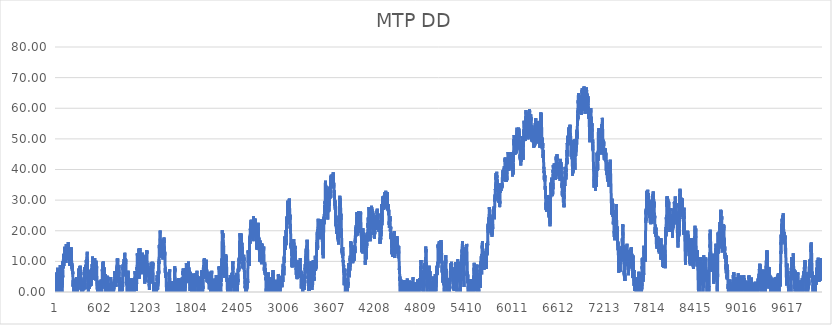
| Category | MTP DD |
|---|---|
| 0 | 0 |
| 1 | 1.56 |
| 2 | 0.56 |
| 3 | 2.81 |
| 4 | 5.21 |
| 5 | 6.337 |
| 6 | 5.343 |
| 7 | 4.35 |
| 8 | 3.353 |
| 9 | 2.357 |
| 10 | 3.92 |
| 11 | 2.94 |
| 12 | 1.94 |
| 13 | 4.39 |
| 14 | 3.39 |
| 15 | 2.41 |
| 16 | 3.31 |
| 17 | 2.33 |
| 18 | 4.15 |
| 19 | 6.13 |
| 20 | 7.89 |
| 21 | 6.89 |
| 22 | 5.91 |
| 23 | 4.93 |
| 24 | 3.95 |
| 25 | 2.97 |
| 26 | 4.79 |
| 27 | 3.79 |
| 28 | 2.81 |
| 29 | 1.83 |
| 30 | 0.85 |
| 31 | 0 |
| 32 | 0 |
| 33 | 1.603 |
| 34 | 0.607 |
| 35 | 2.107 |
| 36 | 1.107 |
| 37 | 1.497 |
| 38 | 0.5 |
| 39 | 1.863 |
| 40 | 0.867 |
| 41 | 3.367 |
| 42 | 2.37 |
| 43 | 3.673 |
| 44 | 2.677 |
| 45 | 4.297 |
| 46 | 4.852 |
| 47 | 3.857 |
| 48 | 5.38 |
| 49 | 4.383 |
| 50 | 3.387 |
| 51 | 6.237 |
| 52 | 5.257 |
| 53 | 4.277 |
| 54 | 6.977 |
| 55 | 8.817 |
| 56 | 7.817 |
| 57 | 6.837 |
| 58 | 7.883 |
| 59 | 6.89 |
| 60 | 5.897 |
| 61 | 4.917 |
| 62 | 3.937 |
| 63 | 2.957 |
| 64 | 1.977 |
| 65 | 0.997 |
| 66 | 2.017 |
| 67 | 1.037 |
| 68 | 0.057 |
| 69 | 0 |
| 70 | 0 |
| 71 | 0 |
| 72 | 0 |
| 73 | 0 |
| 74 | 2.352 |
| 75 | 1.355 |
| 76 | 0.357 |
| 77 | 0 |
| 78 | 0 |
| 79 | 0 |
| 80 | 0 |
| 81 | 2.1 |
| 82 | 3.24 |
| 83 | 2.24 |
| 84 | 4.02 |
| 85 | 3.02 |
| 86 | 5.77 |
| 87 | 4.77 |
| 88 | 7.22 |
| 89 | 9.08 |
| 90 | 8.08 |
| 91 | 10.08 |
| 92 | 9.08 |
| 93 | 9.705 |
| 94 | 8.71 |
| 95 | 7.71 |
| 96 | 9.86 |
| 97 | 12.41 |
| 98 | 11.43 |
| 99 | 12.45 |
| 100 | 11.47 |
| 101 | 10.49 |
| 102 | 9.51 |
| 103 | 8.53 |
| 104 | 10.73 |
| 105 | 9.75 |
| 106 | 10.75 |
| 107 | 9.77 |
| 108 | 10.79 |
| 109 | 9.79 |
| 110 | 11.19 |
| 111 | 10.19 |
| 112 | 12.59 |
| 113 | 11.59 |
| 114 | 13.59 |
| 115 | 14.77 |
| 116 | 13.79 |
| 117 | 12.81 |
| 118 | 14.45 |
| 119 | 13.45 |
| 120 | 14.61 |
| 121 | 13.63 |
| 122 | 12.63 |
| 123 | 13.47 |
| 124 | 12.49 |
| 125 | 11.51 |
| 126 | 10.51 |
| 127 | 13.41 |
| 128 | 12.43 |
| 129 | 11.45 |
| 130 | 10.47 |
| 131 | 9.47 |
| 132 | 12.02 |
| 133 | 14.87 |
| 134 | 15.66 |
| 135 | 14.66 |
| 136 | 13.68 |
| 137 | 12.7 |
| 138 | 14.06 |
| 139 | 14.99 |
| 140 | 14.01 |
| 141 | 13.03 |
| 142 | 12.05 |
| 143 | 11.07 |
| 144 | 12.07 |
| 145 | 13.59 |
| 146 | 12.59 |
| 147 | 11.61 |
| 148 | 12.63 |
| 149 | 14.47 |
| 150 | 13.49 |
| 151 | 12.51 |
| 152 | 14.33 |
| 153 | 13.33 |
| 154 | 12.35 |
| 155 | 11.353 |
| 156 | 12.737 |
| 157 | 11.74 |
| 158 | 12.76 |
| 159 | 11.76 |
| 160 | 14.26 |
| 161 | 16.31 |
| 162 | 15.33 |
| 163 | 14.35 |
| 164 | 13.37 |
| 165 | 12.39 |
| 166 | 11.41 |
| 167 | 10.43 |
| 168 | 12.48 |
| 169 | 11.48 |
| 170 | 10.483 |
| 171 | 11.927 |
| 172 | 10.93 |
| 173 | 12.31 |
| 174 | 11.31 |
| 175 | 10.33 |
| 176 | 9.35 |
| 177 | 10.59 |
| 178 | 9.61 |
| 179 | 8.63 |
| 180 | 10.47 |
| 181 | 9.47 |
| 182 | 8.47 |
| 183 | 10.47 |
| 184 | 11.63 |
| 185 | 10.63 |
| 186 | 11.48 |
| 187 | 10.5 |
| 188 | 12.5 |
| 189 | 11.52 |
| 190 | 10.54 |
| 191 | 9.54 |
| 192 | 11.38 |
| 193 | 14.18 |
| 194 | 13.2 |
| 195 | 12.22 |
| 196 | 11.24 |
| 197 | 10.24 |
| 198 | 12.08 |
| 199 | 13.34 |
| 200 | 14.64 |
| 201 | 13.64 |
| 202 | 12.66 |
| 203 | 11.68 |
| 204 | 10.7 |
| 205 | 9.72 |
| 206 | 8.74 |
| 207 | 9.49 |
| 208 | 8.51 |
| 209 | 7.53 |
| 210 | 8.93 |
| 211 | 7.93 |
| 212 | 6.93 |
| 213 | 8.67 |
| 214 | 7.69 |
| 215 | 6.71 |
| 216 | 7.857 |
| 217 | 6.863 |
| 218 | 5.87 |
| 219 | 6.7 |
| 220 | 5.7 |
| 221 | 4.72 |
| 222 | 3.74 |
| 223 | 2.75 |
| 224 | 1.75 |
| 225 | 3.85 |
| 226 | 2.87 |
| 227 | 1.87 |
| 228 | 4.32 |
| 229 | 3.34 |
| 230 | 2.36 |
| 231 | 1.38 |
| 232 | 0.4 |
| 233 | 0 |
| 234 | 0 |
| 235 | 0 |
| 236 | 2.2 |
| 237 | 1.22 |
| 238 | 0.24 |
| 239 | 0 |
| 240 | 1.24 |
| 241 | 2.407 |
| 242 | 1.413 |
| 243 | 0.42 |
| 244 | 2.3 |
| 245 | 1.3 |
| 246 | 3.24 |
| 247 | 2.26 |
| 248 | 3.44 |
| 249 | 2.46 |
| 250 | 1.48 |
| 251 | 0.5 |
| 252 | 0 |
| 253 | 0.99 |
| 254 | 0 |
| 255 | 0 |
| 256 | 0.8 |
| 257 | 0 |
| 258 | 0.83 |
| 259 | 2.49 |
| 260 | 1.49 |
| 261 | 0.492 |
| 262 | 0 |
| 263 | 0 |
| 264 | 2.552 |
| 265 | 3.972 |
| 266 | 2.972 |
| 267 | 4.132 |
| 268 | 3.152 |
| 269 | 4.832 |
| 270 | 3.852 |
| 271 | 2.872 |
| 272 | 1.892 |
| 273 | 0.912 |
| 274 | 2.792 |
| 275 | 1.792 |
| 276 | 0.792 |
| 277 | 2.792 |
| 278 | 1.792 |
| 279 | 0.792 |
| 280 | 0 |
| 281 | 0 |
| 282 | 0 |
| 283 | 0 |
| 284 | 1.6 |
| 285 | 0.6 |
| 286 | 1.76 |
| 287 | 0.78 |
| 288 | 2.44 |
| 289 | 1.44 |
| 290 | 3.22 |
| 291 | 2.22 |
| 292 | 4.22 |
| 293 | 3.22 |
| 294 | 4.5 |
| 295 | 6.04 |
| 296 | 5.06 |
| 297 | 4.08 |
| 298 | 5.01 |
| 299 | 6.39 |
| 300 | 5.39 |
| 301 | 7.69 |
| 302 | 6.69 |
| 303 | 5.71 |
| 304 | 7.59 |
| 305 | 6.61 |
| 306 | 5.63 |
| 307 | 4.65 |
| 308 | 5.61 |
| 309 | 4.63 |
| 310 | 3.65 |
| 311 | 2.67 |
| 312 | 5.22 |
| 313 | 7.77 |
| 314 | 6.77 |
| 315 | 8.51 |
| 316 | 7.51 |
| 317 | 8.59 |
| 318 | 7.59 |
| 319 | 6.61 |
| 320 | 6.97 |
| 321 | 5.99 |
| 322 | 5.01 |
| 323 | 4.03 |
| 324 | 3.05 |
| 325 | 2.07 |
| 326 | 1.07 |
| 327 | 3.52 |
| 328 | 2.54 |
| 329 | 1.54 |
| 330 | 4.24 |
| 331 | 3.26 |
| 332 | 2.28 |
| 333 | 1.3 |
| 334 | 0.3 |
| 335 | 2.55 |
| 336 | 1.57 |
| 337 | 0.59 |
| 338 | 0 |
| 339 | 0 |
| 340 | 2.4 |
| 341 | 1.42 |
| 342 | 0.44 |
| 343 | 0 |
| 344 | 0 |
| 345 | 0 |
| 346 | 1.448 |
| 347 | 0.455 |
| 348 | 0 |
| 349 | 0 |
| 350 | 0 |
| 351 | 0 |
| 352 | 0 |
| 353 | 0 |
| 354 | 0 |
| 355 | 0 |
| 356 | 0 |
| 357 | 0 |
| 358 | 0 |
| 359 | 0 |
| 360 | 2 |
| 361 | 1.003 |
| 362 | 2.567 |
| 363 | 1.57 |
| 364 | 0.57 |
| 365 | 2.11 |
| 366 | 4.01 |
| 367 | 3.01 |
| 368 | 4.71 |
| 369 | 3.71 |
| 370 | 6.51 |
| 371 | 5.53 |
| 372 | 8.13 |
| 373 | 7.15 |
| 374 | 6.17 |
| 375 | 5.19 |
| 376 | 4.21 |
| 377 | 3.213 |
| 378 | 4.837 |
| 379 | 3.84 |
| 380 | 2.86 |
| 381 | 1.88 |
| 382 | 0.9 |
| 383 | 3 |
| 384 | 5.85 |
| 385 | 7.01 |
| 386 | 6.01 |
| 387 | 7.41 |
| 388 | 8.87 |
| 389 | 7.87 |
| 390 | 8.5 |
| 391 | 7.51 |
| 392 | 6.52 |
| 393 | 8.1 |
| 394 | 7.1 |
| 395 | 6.12 |
| 396 | 8.97 |
| 397 | 10.45 |
| 398 | 9.47 |
| 399 | 8.49 |
| 400 | 7.51 |
| 401 | 6.53 |
| 402 | 7.79 |
| 403 | 9.71 |
| 404 | 8.71 |
| 405 | 10.67 |
| 406 | 9.67 |
| 407 | 11.51 |
| 408 | 13.113 |
| 409 | 12.117 |
| 410 | 11.12 |
| 411 | 10.14 |
| 412 | 9.16 |
| 413 | 8.18 |
| 414 | 7.2 |
| 415 | 6.22 |
| 416 | 5.24 |
| 417 | 4.24 |
| 418 | 5.82 |
| 419 | 4.84 |
| 420 | 3.86 |
| 421 | 2.88 |
| 422 | 1.9 |
| 423 | 0.92 |
| 424 | 0 |
| 425 | 2.1 |
| 426 | 3.12 |
| 427 | 2.12 |
| 428 | 4.72 |
| 429 | 3.725 |
| 430 | 2.73 |
| 431 | 4.935 |
| 432 | 3.94 |
| 433 | 2.96 |
| 434 | 1.98 |
| 435 | 1 |
| 436 | 2.12 |
| 437 | 4.47 |
| 438 | 3.49 |
| 439 | 4.933 |
| 440 | 3.937 |
| 441 | 2.94 |
| 442 | 3.685 |
| 443 | 2.69 |
| 444 | 1.69 |
| 445 | 4.29 |
| 446 | 5.85 |
| 447 | 4.87 |
| 448 | 7.22 |
| 449 | 6.24 |
| 450 | 5.26 |
| 451 | 4.28 |
| 452 | 3.3 |
| 453 | 6.1 |
| 454 | 7.3 |
| 455 | 6.3 |
| 456 | 5.32 |
| 457 | 4.34 |
| 458 | 3.36 |
| 459 | 4.05 |
| 460 | 3.07 |
| 461 | 2.07 |
| 462 | 4.07 |
| 463 | 3.07 |
| 464 | 5.47 |
| 465 | 4.47 |
| 466 | 3.47 |
| 467 | 6.07 |
| 468 | 5.09 |
| 469 | 7.79 |
| 470 | 6.81 |
| 471 | 5.83 |
| 472 | 7.63 |
| 473 | 9.07 |
| 474 | 8.09 |
| 475 | 7.11 |
| 476 | 7.82 |
| 477 | 9.7 |
| 478 | 11.56 |
| 479 | 10.58 |
| 480 | 9.6 |
| 481 | 8.62 |
| 482 | 10.56 |
| 483 | 9.56 |
| 484 | 8.58 |
| 485 | 10.16 |
| 486 | 9.16 |
| 487 | 10.48 |
| 488 | 9.5 |
| 489 | 8.52 |
| 490 | 7.54 |
| 491 | 6.56 |
| 492 | 5.56 |
| 493 | 8.26 |
| 494 | 7.28 |
| 495 | 8.287 |
| 496 | 7.293 |
| 497 | 6.3 |
| 498 | 5.32 |
| 499 | 4.34 |
| 500 | 4.94 |
| 501 | 3.96 |
| 502 | 5.08 |
| 503 | 7.02 |
| 504 | 6.04 |
| 505 | 5.04 |
| 506 | 7 |
| 507 | 8.84 |
| 508 | 11.09 |
| 509 | 10.11 |
| 510 | 9.13 |
| 511 | 10.157 |
| 512 | 9.163 |
| 513 | 8.17 |
| 514 | 7.19 |
| 515 | 6.21 |
| 516 | 7.693 |
| 517 | 6.697 |
| 518 | 5.7 |
| 519 | 4.72 |
| 520 | 3.72 |
| 521 | 6.52 |
| 522 | 5.52 |
| 523 | 8.42 |
| 524 | 7.42 |
| 525 | 10.22 |
| 526 | 9.24 |
| 527 | 8.26 |
| 528 | 7.28 |
| 529 | 6.3 |
| 530 | 8.4 |
| 531 | 7.42 |
| 532 | 8.7 |
| 533 | 7.72 |
| 534 | 6.74 |
| 535 | 5.76 |
| 536 | 4.78 |
| 537 | 3.8 |
| 538 | 2.82 |
| 539 | 1.84 |
| 540 | 0.84 |
| 541 | 3.59 |
| 542 | 2.61 |
| 543 | 1.63 |
| 544 | 0.65 |
| 545 | 0 |
| 546 | 2.005 |
| 547 | 1.01 |
| 548 | 0.015 |
| 549 | 0 |
| 550 | 1.44 |
| 551 | 2.085 |
| 552 | 1.09 |
| 553 | 0.09 |
| 554 | 2.03 |
| 555 | 1.05 |
| 556 | 0.05 |
| 557 | 1.17 |
| 558 | 0.19 |
| 559 | 0 |
| 560 | 1.48 |
| 561 | 0.48 |
| 562 | 3.08 |
| 563 | 2.1 |
| 564 | 3.64 |
| 565 | 2.66 |
| 566 | 1.68 |
| 567 | 3.46 |
| 568 | 2.46 |
| 569 | 1.46 |
| 570 | 3.22 |
| 571 | 2.24 |
| 572 | 1.26 |
| 573 | 0.28 |
| 574 | 0 |
| 575 | 0 |
| 576 | 0 |
| 577 | 0 |
| 578 | 0 |
| 579 | 2 |
| 580 | 1.02 |
| 581 | 2.48 |
| 582 | 1.48 |
| 583 | 3.4 |
| 584 | 2.4 |
| 585 | 1.42 |
| 586 | 0.44 |
| 587 | 0 |
| 588 | 1.7 |
| 589 | 4.05 |
| 590 | 3.07 |
| 591 | 2.09 |
| 592 | 1.09 |
| 593 | 3.44 |
| 594 | 2.46 |
| 595 | 1.48 |
| 596 | 0.5 |
| 597 | 0.82 |
| 598 | 0 |
| 599 | 0 |
| 600 | 0 |
| 601 | 0 |
| 602 | 0 |
| 603 | 0 |
| 604 | 2.7 |
| 605 | 4.2 |
| 606 | 5.68 |
| 607 | 7.42 |
| 608 | 6.42 |
| 609 | 7.58 |
| 610 | 6.58 |
| 611 | 8.12 |
| 612 | 9.64 |
| 613 | 8.64 |
| 614 | 7.66 |
| 615 | 6.68 |
| 616 | 7.58 |
| 617 | 8.48 |
| 618 | 7.48 |
| 619 | 9.93 |
| 620 | 8.93 |
| 621 | 7.93 |
| 622 | 9.41 |
| 623 | 8.43 |
| 624 | 7.45 |
| 625 | 6.453 |
| 626 | 8.037 |
| 627 | 7.04 |
| 628 | 6.06 |
| 629 | 5.08 |
| 630 | 4.08 |
| 631 | 6.53 |
| 632 | 7.99 |
| 633 | 6.99 |
| 634 | 6.01 |
| 635 | 5.03 |
| 636 | 4.05 |
| 637 | 3.07 |
| 638 | 2.09 |
| 639 | 1.09 |
| 640 | 2.91 |
| 641 | 1.91 |
| 642 | 3.45 |
| 643 | 5.85 |
| 644 | 4.87 |
| 645 | 5.68 |
| 646 | 4.68 |
| 647 | 3.7 |
| 648 | 2.72 |
| 649 | 1.74 |
| 650 | 0.76 |
| 651 | 0 |
| 652 | 1.94 |
| 653 | 0.94 |
| 654 | 2.66 |
| 655 | 1.68 |
| 656 | 0.7 |
| 657 | 2.42 |
| 658 | 1.42 |
| 659 | 3.18 |
| 660 | 3.92 |
| 661 | 2.94 |
| 662 | 1.94 |
| 663 | 3.72 |
| 664 | 2.74 |
| 665 | 1.76 |
| 666 | 2.677 |
| 667 | 1.683 |
| 668 | 0.69 |
| 669 | 2.31 |
| 670 | 4.91 |
| 671 | 3.93 |
| 672 | 2.93 |
| 673 | 5.28 |
| 674 | 4.3 |
| 675 | 3.32 |
| 676 | 4.48 |
| 677 | 5.035 |
| 678 | 4.04 |
| 679 | 4.655 |
| 680 | 3.66 |
| 681 | 2.68 |
| 682 | 1.7 |
| 683 | 0.72 |
| 684 | 0 |
| 685 | 0 |
| 686 | 2.55 |
| 687 | 1.57 |
| 688 | 0.59 |
| 689 | 1.5 |
| 690 | 2.52 |
| 691 | 1.54 |
| 692 | 2.37 |
| 693 | 1.39 |
| 694 | 0.41 |
| 695 | 0 |
| 696 | 0 |
| 697 | 0 |
| 698 | 0.87 |
| 699 | 0 |
| 700 | 0 |
| 701 | 0 |
| 702 | 2.25 |
| 703 | 1.25 |
| 704 | 2.89 |
| 705 | 1.89 |
| 706 | 0.91 |
| 707 | 0 |
| 708 | 0 |
| 709 | 0 |
| 710 | 0 |
| 711 | 0 |
| 712 | 0 |
| 713 | 0 |
| 714 | 0 |
| 715 | 0 |
| 716 | 0 |
| 717 | 2.1 |
| 718 | 4.9 |
| 719 | 3.92 |
| 720 | 2.94 |
| 721 | 1.96 |
| 722 | 0.98 |
| 723 | 1.485 |
| 724 | 0.49 |
| 725 | 1.34 |
| 726 | 0.36 |
| 727 | 1.7 |
| 728 | 3.22 |
| 729 | 2.22 |
| 730 | 3.307 |
| 731 | 2.313 |
| 732 | 1.32 |
| 733 | 0.34 |
| 734 | 0 |
| 735 | 0 |
| 736 | 1.84 |
| 737 | 0.86 |
| 738 | 0 |
| 739 | 1.62 |
| 740 | 2.86 |
| 741 | 1.88 |
| 742 | 2.86 |
| 743 | 1.86 |
| 744 | 0.88 |
| 745 | 0 |
| 746 | 0 |
| 747 | 0 |
| 748 | 0 |
| 749 | 0 |
| 750 | 0 |
| 751 | 0 |
| 752 | 0 |
| 753 | 1.647 |
| 754 | 0.667 |
| 755 | 0 |
| 756 | 1.92 |
| 757 | 0.92 |
| 758 | 2.16 |
| 759 | 3.26 |
| 760 | 2.26 |
| 761 | 2.985 |
| 762 | 1.99 |
| 763 | 2.77 |
| 764 | 4.07 |
| 765 | 3.07 |
| 766 | 2.09 |
| 767 | 4.09 |
| 768 | 3.11 |
| 769 | 4.87 |
| 770 | 6.63 |
| 771 | 5.65 |
| 772 | 4.65 |
| 773 | 6.75 |
| 774 | 5.75 |
| 775 | 6.75 |
| 776 | 5.75 |
| 777 | 4.77 |
| 778 | 3.79 |
| 779 | 2.81 |
| 780 | 1.83 |
| 781 | 2.63 |
| 782 | 1.65 |
| 783 | 2.18 |
| 784 | 2.88 |
| 785 | 1.88 |
| 786 | 3.88 |
| 787 | 5.62 |
| 788 | 4.62 |
| 789 | 6.52 |
| 790 | 5.52 |
| 791 | 4.54 |
| 792 | 3.54 |
| 793 | 5.59 |
| 794 | 7.69 |
| 795 | 6.71 |
| 796 | 8.11 |
| 797 | 7.11 |
| 798 | 8.31 |
| 799 | 7.31 |
| 800 | 6.33 |
| 801 | 8.78 |
| 802 | 10.93 |
| 803 | 9.93 |
| 804 | 8.95 |
| 805 | 7.97 |
| 806 | 6.97 |
| 807 | 5.97 |
| 808 | 8.37 |
| 809 | 10.92 |
| 810 | 9.94 |
| 811 | 8.96 |
| 812 | 7.98 |
| 813 | 7 |
| 814 | 6.02 |
| 815 | 5.02 |
| 816 | 4.02 |
| 817 | 5.98 |
| 818 | 5 |
| 819 | 4 |
| 820 | 3 |
| 821 | 5.85 |
| 822 | 7.01 |
| 823 | 6.03 |
| 824 | 6.55 |
| 825 | 8.8 |
| 826 | 7.82 |
| 827 | 6.84 |
| 828 | 5.86 |
| 829 | 4.88 |
| 830 | 3.9 |
| 831 | 2.903 |
| 832 | 1.907 |
| 833 | 3.65 |
| 834 | 2.67 |
| 835 | 1.69 |
| 836 | 0.71 |
| 837 | 0 |
| 838 | 2.1 |
| 839 | 4.85 |
| 840 | 3.87 |
| 841 | 2.89 |
| 842 | 1.91 |
| 843 | 0.93 |
| 844 | 0 |
| 845 | 0 |
| 846 | 0 |
| 847 | 0 |
| 848 | 1.14 |
| 849 | 3.69 |
| 850 | 2.71 |
| 851 | 1.717 |
| 852 | 3.385 |
| 853 | 2.392 |
| 854 | 1.4 |
| 855 | 3.1 |
| 856 | 2.1 |
| 857 | 1.12 |
| 858 | 0.14 |
| 859 | 0 |
| 860 | 1.34 |
| 861 | 0.36 |
| 862 | 0 |
| 863 | 0 |
| 864 | 1.12 |
| 865 | 2.34 |
| 866 | 1.36 |
| 867 | 0.38 |
| 868 | 3.28 |
| 869 | 2.3 |
| 870 | 1.32 |
| 871 | 0.32 |
| 872 | 2.24 |
| 873 | 1.24 |
| 874 | 3.14 |
| 875 | 5.79 |
| 876 | 8.14 |
| 877 | 7.14 |
| 878 | 9 |
| 879 | 8.02 |
| 880 | 7.04 |
| 881 | 6.06 |
| 882 | 5.08 |
| 883 | 6.3 |
| 884 | 5.3 |
| 885 | 7.04 |
| 886 | 9.54 |
| 887 | 8.56 |
| 888 | 9.78 |
| 889 | 8.8 |
| 890 | 7.82 |
| 891 | 9.74 |
| 892 | 10.78 |
| 893 | 9.78 |
| 894 | 8.8 |
| 895 | 7.82 |
| 896 | 6.84 |
| 897 | 8.4 |
| 898 | 10.6 |
| 899 | 11.53 |
| 900 | 10.53 |
| 901 | 12.78 |
| 902 | 11.8 |
| 903 | 10.82 |
| 904 | 9.84 |
| 905 | 8.86 |
| 906 | 7.88 |
| 907 | 9.26 |
| 908 | 8.26 |
| 909 | 7.26 |
| 910 | 9.66 |
| 911 | 10.96 |
| 912 | 9.96 |
| 913 | 8.963 |
| 914 | 10.707 |
| 915 | 9.71 |
| 916 | 8.73 |
| 917 | 7.75 |
| 918 | 6.77 |
| 919 | 5.79 |
| 920 | 4.81 |
| 921 | 3.83 |
| 922 | 2.85 |
| 923 | 4.15 |
| 924 | 3.17 |
| 925 | 2.19 |
| 926 | 3.59 |
| 927 | 2.59 |
| 928 | 4.74 |
| 929 | 3.76 |
| 930 | 2.78 |
| 931 | 1.8 |
| 932 | 0.82 |
| 933 | 0 |
| 934 | 0.51 |
| 935 | 2.86 |
| 936 | 1.86 |
| 937 | 4.21 |
| 938 | 5.57 |
| 939 | 4.59 |
| 940 | 3.61 |
| 941 | 5.27 |
| 942 | 6.57 |
| 943 | 5.57 |
| 944 | 4.57 |
| 945 | 6.97 |
| 946 | 5.99 |
| 947 | 5.01 |
| 948 | 4.03 |
| 949 | 3.05 |
| 950 | 4.69 |
| 951 | 3.69 |
| 952 | 2.71 |
| 953 | 1.73 |
| 954 | 2.89 |
| 955 | 1.89 |
| 956 | 2.977 |
| 957 | 1.983 |
| 958 | 0.99 |
| 959 | 1.92 |
| 960 | 3.14 |
| 961 | 2.14 |
| 962 | 1.16 |
| 963 | 0.18 |
| 964 | 0 |
| 965 | 2.7 |
| 966 | 1.72 |
| 967 | 2.42 |
| 968 | 1.44 |
| 969 | 0.46 |
| 970 | 0 |
| 971 | 0 |
| 972 | 0 |
| 973 | 2.702 |
| 974 | 1.722 |
| 975 | 2.849 |
| 976 | 1.856 |
| 977 | 0.862 |
| 978 | 0 |
| 979 | 0 |
| 980 | 0 |
| 981 | 1.5 |
| 982 | 3.7 |
| 983 | 2.72 |
| 984 | 1.72 |
| 985 | 4.32 |
| 986 | 3.32 |
| 987 | 4.4 |
| 988 | 3.42 |
| 989 | 2.44 |
| 990 | 1.46 |
| 991 | 0.48 |
| 992 | 0 |
| 993 | 0 |
| 994 | 2.15 |
| 995 | 1.17 |
| 996 | 0.19 |
| 997 | 0 |
| 998 | 0 |
| 999 | 0 |
| 1000 | 0 |
| 1001 | 2 |
| 1002 | 2.41 |
| 1003 | 4.35 |
| 1004 | 3.35 |
| 1005 | 2.35 |
| 1006 | 4.21 |
| 1007 | 3.21 |
| 1008 | 2.21 |
| 1009 | 1.23 |
| 1010 | 0.25 |
| 1011 | 0 |
| 1012 | 2.1 |
| 1013 | 1.1 |
| 1014 | 0.12 |
| 1015 | 0 |
| 1016 | 0 |
| 1017 | 0 |
| 1018 | 0 |
| 1019 | 1.2 |
| 1020 | 0.203 |
| 1021 | 1.767 |
| 1022 | 0.77 |
| 1023 | 0 |
| 1024 | 1.68 |
| 1025 | 3 |
| 1026 | 2 |
| 1027 | 1 |
| 1028 | 3.45 |
| 1029 | 2.47 |
| 1030 | 1.49 |
| 1031 | 3.35 |
| 1032 | 2.37 |
| 1033 | 4.62 |
| 1034 | 3.62 |
| 1035 | 5.04 |
| 1036 | 6.84 |
| 1037 | 5.84 |
| 1038 | 4.84 |
| 1039 | 3.86 |
| 1040 | 2.88 |
| 1041 | 1.9 |
| 1042 | 0.92 |
| 1043 | 2.16 |
| 1044 | 1.18 |
| 1045 | 2.38 |
| 1046 | 1.387 |
| 1047 | 2.493 |
| 1048 | 1.5 |
| 1049 | 0.5 |
| 1050 | 2.3 |
| 1051 | 1.3 |
| 1052 | 0.32 |
| 1053 | 1.27 |
| 1054 | 2.31 |
| 1055 | 1.31 |
| 1056 | 0.31 |
| 1057 | 3.01 |
| 1058 | 4.49 |
| 1059 | 5.53 |
| 1060 | 7.01 |
| 1061 | 8.19 |
| 1062 | 7.19 |
| 1063 | 8.12 |
| 1064 | 10.17 |
| 1065 | 11.1 |
| 1066 | 12.62 |
| 1067 | 11.62 |
| 1068 | 12.7 |
| 1069 | 11.72 |
| 1070 | 10.74 |
| 1071 | 9.76 |
| 1072 | 8.76 |
| 1073 | 10.16 |
| 1074 | 9.18 |
| 1075 | 8.2 |
| 1076 | 7.2 |
| 1077 | 9.4 |
| 1078 | 8.4 |
| 1079 | 10.75 |
| 1080 | 12.33 |
| 1081 | 11.35 |
| 1082 | 10.37 |
| 1083 | 12.25 |
| 1084 | 14.17 |
| 1085 | 13.17 |
| 1086 | 12.19 |
| 1087 | 11.21 |
| 1088 | 10.23 |
| 1089 | 9.25 |
| 1090 | 8.27 |
| 1091 | 7.29 |
| 1092 | 6.31 |
| 1093 | 5.33 |
| 1094 | 4.33 |
| 1095 | 7.08 |
| 1096 | 6.08 |
| 1097 | 7.52 |
| 1098 | 9.72 |
| 1099 | 11.5 |
| 1100 | 10.5 |
| 1101 | 13.15 |
| 1102 | 14.377 |
| 1103 | 13.383 |
| 1104 | 12.39 |
| 1105 | 11.41 |
| 1106 | 10.413 |
| 1107 | 12.157 |
| 1108 | 11.16 |
| 1109 | 10.16 |
| 1110 | 11.11 |
| 1111 | 10.13 |
| 1112 | 9.15 |
| 1113 | 8.17 |
| 1114 | 9.91 |
| 1115 | 11.79 |
| 1116 | 10.79 |
| 1117 | 9.81 |
| 1118 | 8.83 |
| 1119 | 7.85 |
| 1120 | 8.81 |
| 1121 | 7.81 |
| 1122 | 6.83 |
| 1123 | 5.83 |
| 1124 | 7.93 |
| 1125 | 6.93 |
| 1126 | 8.77 |
| 1127 | 7.79 |
| 1128 | 10.34 |
| 1129 | 11.48 |
| 1130 | 10.5 |
| 1131 | 9.52 |
| 1132 | 12.27 |
| 1133 | 11.29 |
| 1134 | 12.79 |
| 1135 | 11.81 |
| 1136 | 10.83 |
| 1137 | 11.76 |
| 1138 | 10.76 |
| 1139 | 12.14 |
| 1140 | 11.16 |
| 1141 | 10.163 |
| 1142 | 11.707 |
| 1143 | 10.71 |
| 1144 | 11.27 |
| 1145 | 11.87 |
| 1146 | 10.89 |
| 1147 | 9.91 |
| 1148 | 11.63 |
| 1149 | 10.65 |
| 1150 | 9.657 |
| 1151 | 8.665 |
| 1152 | 10.352 |
| 1153 | 9.36 |
| 1154 | 8.38 |
| 1155 | 7.4 |
| 1156 | 6.4 |
| 1157 | 8.22 |
| 1158 | 7.22 |
| 1159 | 6.24 |
| 1160 | 5.26 |
| 1161 | 4.28 |
| 1162 | 3.3 |
| 1163 | 3.745 |
| 1164 | 2.75 |
| 1165 | 4.11 |
| 1166 | 5.59 |
| 1167 | 4.59 |
| 1168 | 5.31 |
| 1169 | 4.33 |
| 1170 | 3.33 |
| 1171 | 5.58 |
| 1172 | 4.6 |
| 1173 | 5.5 |
| 1174 | 4.5 |
| 1175 | 6.16 |
| 1176 | 5.18 |
| 1177 | 4.2 |
| 1178 | 5.78 |
| 1179 | 4.8 |
| 1180 | 7.25 |
| 1181 | 8.47 |
| 1182 | 7.49 |
| 1183 | 6.49 |
| 1184 | 8.54 |
| 1185 | 11.04 |
| 1186 | 10.06 |
| 1187 | 11.42 |
| 1188 | 12.38 |
| 1189 | 13.46 |
| 1190 | 12.46 |
| 1191 | 13.66 |
| 1192 | 12.68 |
| 1193 | 11.7 |
| 1194 | 10.72 |
| 1195 | 9.74 |
| 1196 | 8.76 |
| 1197 | 9.39 |
| 1198 | 8.41 |
| 1199 | 7.43 |
| 1200 | 6.45 |
| 1201 | 8.21 |
| 1202 | 9.357 |
| 1203 | 8.363 |
| 1204 | 7.37 |
| 1205 | 8.497 |
| 1206 | 7.503 |
| 1207 | 6.51 |
| 1208 | 5.53 |
| 1209 | 6.65 |
| 1210 | 5.65 |
| 1211 | 7.75 |
| 1212 | 6.75 |
| 1213 | 5.77 |
| 1214 | 6.99 |
| 1215 | 5.99 |
| 1216 | 5.01 |
| 1217 | 4.03 |
| 1218 | 3.05 |
| 1219 | 4.11 |
| 1220 | 3.11 |
| 1221 | 2.13 |
| 1222 | 2.635 |
| 1223 | 1.64 |
| 1224 | 0.64 |
| 1225 | 1.86 |
| 1226 | 2.64 |
| 1227 | 5.59 |
| 1228 | 6.5 |
| 1229 | 7.76 |
| 1230 | 6.76 |
| 1231 | 5.78 |
| 1232 | 4.8 |
| 1233 | 6.22 |
| 1234 | 5.22 |
| 1235 | 7.87 |
| 1236 | 6.89 |
| 1237 | 5.91 |
| 1238 | 4.91 |
| 1239 | 3.91 |
| 1240 | 5.83 |
| 1241 | 4.83 |
| 1242 | 6.79 |
| 1243 | 5.81 |
| 1244 | 6.89 |
| 1245 | 5.89 |
| 1246 | 7.99 |
| 1247 | 9.73 |
| 1248 | 8.73 |
| 1249 | 7.75 |
| 1250 | 6.77 |
| 1251 | 5.79 |
| 1252 | 4.81 |
| 1253 | 3.81 |
| 1254 | 5.81 |
| 1255 | 4.81 |
| 1256 | 3.81 |
| 1257 | 2.81 |
| 1258 | 5.01 |
| 1259 | 7.91 |
| 1260 | 9.41 |
| 1261 | 8.41 |
| 1262 | 9.89 |
| 1263 | 8.91 |
| 1264 | 7.93 |
| 1265 | 6.93 |
| 1266 | 7.89 |
| 1267 | 9.61 |
| 1268 | 8.63 |
| 1269 | 7.63 |
| 1270 | 9.51 |
| 1271 | 8.51 |
| 1272 | 7.53 |
| 1273 | 6.55 |
| 1274 | 5.57 |
| 1275 | 4.59 |
| 1276 | 3.61 |
| 1277 | 2.63 |
| 1278 | 1.65 |
| 1279 | 0.67 |
| 1280 | 0 |
| 1281 | 0 |
| 1282 | 1.24 |
| 1283 | 0.24 |
| 1284 | 0 |
| 1285 | 0 |
| 1286 | 1.68 |
| 1287 | 0.7 |
| 1288 | 0 |
| 1289 | 0 |
| 1290 | 0 |
| 1291 | 0 |
| 1292 | 0 |
| 1293 | 0 |
| 1294 | 0 |
| 1295 | 0 |
| 1296 | 0 |
| 1297 | 1.32 |
| 1298 | 0.32 |
| 1299 | 0 |
| 1300 | 1.68 |
| 1301 | 0.68 |
| 1302 | 0 |
| 1303 | 0 |
| 1304 | 0 |
| 1305 | 0 |
| 1306 | 0 |
| 1307 | 1.64 |
| 1308 | 3.16 |
| 1309 | 2.18 |
| 1310 | 1.2 |
| 1311 | 0.22 |
| 1312 | 0.93 |
| 1313 | 1.47 |
| 1314 | 2.14 |
| 1315 | 3.097 |
| 1316 | 2.103 |
| 1317 | 1.11 |
| 1318 | 0.13 |
| 1319 | 0 |
| 1320 | 0 |
| 1321 | 0 |
| 1322 | 0 |
| 1323 | 2.2 |
| 1324 | 3.72 |
| 1325 | 5.46 |
| 1326 | 4.48 |
| 1327 | 3.5 |
| 1328 | 4.567 |
| 1329 | 3.573 |
| 1330 | 2.58 |
| 1331 | 1.6 |
| 1332 | 0.62 |
| 1333 | 1.6 |
| 1334 | 2.78 |
| 1335 | 1.8 |
| 1336 | 3.22 |
| 1337 | 4.96 |
| 1338 | 6.8 |
| 1339 | 5.82 |
| 1340 | 4.84 |
| 1341 | 3.86 |
| 1342 | 2.88 |
| 1343 | 4.93 |
| 1344 | 3.95 |
| 1345 | 5.15 |
| 1346 | 7.03 |
| 1347 | 6.03 |
| 1348 | 8.88 |
| 1349 | 10.1 |
| 1350 | 9.1 |
| 1351 | 10.82 |
| 1352 | 11.54 |
| 1353 | 12.68 |
| 1354 | 15.33 |
| 1355 | 14.35 |
| 1356 | 13.37 |
| 1357 | 12.39 |
| 1358 | 11.39 |
| 1359 | 12.89 |
| 1360 | 13.91 |
| 1361 | 12.91 |
| 1362 | 15.56 |
| 1363 | 14.56 |
| 1364 | 17.46 |
| 1365 | 20.11 |
| 1366 | 19.11 |
| 1367 | 18.11 |
| 1368 | 17.13 |
| 1369 | 16.15 |
| 1370 | 16.58 |
| 1371 | 15.6 |
| 1372 | 14.6 |
| 1373 | 16.9 |
| 1374 | 15.92 |
| 1375 | 14.94 |
| 1376 | 13.96 |
| 1377 | 12.96 |
| 1378 | 11.96 |
| 1379 | 14.21 |
| 1380 | 13.23 |
| 1381 | 12.25 |
| 1382 | 11.25 |
| 1383 | 13.3 |
| 1384 | 12.32 |
| 1385 | 11.32 |
| 1386 | 13.52 |
| 1387 | 16.27 |
| 1388 | 15.29 |
| 1389 | 14.29 |
| 1390 | 17.04 |
| 1391 | 16.06 |
| 1392 | 15.08 |
| 1393 | 14.083 |
| 1394 | 15.467 |
| 1395 | 14.47 |
| 1396 | 15.597 |
| 1397 | 14.603 |
| 1398 | 13.61 |
| 1399 | 12.63 |
| 1400 | 11.63 |
| 1401 | 10.63 |
| 1402 | 12.73 |
| 1403 | 13.66 |
| 1404 | 14.76 |
| 1405 | 13.76 |
| 1406 | 15.66 |
| 1407 | 14.66 |
| 1408 | 13.68 |
| 1409 | 15 |
| 1410 | 16.16 |
| 1411 | 15.16 |
| 1412 | 14.16 |
| 1413 | 15.76 |
| 1414 | 16.96 |
| 1415 | 15.98 |
| 1416 | 17.76 |
| 1417 | 16.76 |
| 1418 | 15.78 |
| 1419 | 14.8 |
| 1420 | 13.82 |
| 1421 | 12.825 |
| 1422 | 14.79 |
| 1423 | 13.795 |
| 1424 | 12.8 |
| 1425 | 11.82 |
| 1426 | 13.14 |
| 1427 | 12.14 |
| 1428 | 11.16 |
| 1429 | 10.18 |
| 1430 | 9.2 |
| 1431 | 8.22 |
| 1432 | 7.24 |
| 1433 | 6.24 |
| 1434 | 8.18 |
| 1435 | 7.18 |
| 1436 | 6.2 |
| 1437 | 5.22 |
| 1438 | 6.603 |
| 1439 | 5.607 |
| 1440 | 4.61 |
| 1441 | 5.44 |
| 1442 | 6.39 |
| 1443 | 5.39 |
| 1444 | 4.41 |
| 1445 | 3.43 |
| 1446 | 2.45 |
| 1447 | 1.453 |
| 1448 | 3.177 |
| 1449 | 2.18 |
| 1450 | 1.2 |
| 1451 | 0.22 |
| 1452 | 0 |
| 1453 | 0 |
| 1454 | 1.52 |
| 1455 | 0.52 |
| 1456 | 0 |
| 1457 | 0 |
| 1458 | 1.663 |
| 1459 | 0.667 |
| 1460 | 0 |
| 1461 | 1.503 |
| 1462 | 0.507 |
| 1463 | 0 |
| 1464 | 0 |
| 1465 | 0 |
| 1466 | 0 |
| 1467 | 0 |
| 1468 | 0 |
| 1469 | 1.12 |
| 1470 | 0.14 |
| 1471 | 0 |
| 1472 | 2.3 |
| 1473 | 1.32 |
| 1474 | 0.34 |
| 1475 | 0 |
| 1476 | 0 |
| 1477 | 0 |
| 1478 | 1.067 |
| 1479 | 0.073 |
| 1480 | 0 |
| 1481 | 0 |
| 1482 | 0.85 |
| 1483 | 2.27 |
| 1484 | 3.41 |
| 1485 | 2.41 |
| 1486 | 4.61 |
| 1487 | 3.63 |
| 1488 | 5.17 |
| 1489 | 5.69 |
| 1490 | 7.41 |
| 1491 | 6.41 |
| 1492 | 5.43 |
| 1493 | 4.45 |
| 1494 | 3.47 |
| 1495 | 2.49 |
| 1496 | 1.51 |
| 1497 | 0.53 |
| 1498 | 1.99 |
| 1499 | 1.01 |
| 1500 | 0.03 |
| 1501 | 0 |
| 1502 | 0 |
| 1503 | 0 |
| 1504 | 0 |
| 1505 | 0 |
| 1506 | 0 |
| 1507 | 0 |
| 1508 | 0 |
| 1509 | 0.85 |
| 1510 | 0 |
| 1511 | 0 |
| 1512 | 0 |
| 1513 | 0 |
| 1514 | 0 |
| 1515 | 0 |
| 1516 | 1.723 |
| 1517 | 0.727 |
| 1518 | 0 |
| 1519 | 0 |
| 1520 | 2.05 |
| 1521 | 1.05 |
| 1522 | 0.07 |
| 1523 | 0 |
| 1524 | 2.1 |
| 1525 | 1.12 |
| 1526 | 0.14 |
| 1527 | 2.34 |
| 1528 | 3.6 |
| 1529 | 2.6 |
| 1530 | 1.6 |
| 1531 | 2.55 |
| 1532 | 1.57 |
| 1533 | 0.59 |
| 1534 | 0 |
| 1535 | 1.52 |
| 1536 | 0.52 |
| 1537 | 0 |
| 1538 | 0 |
| 1539 | 0 |
| 1540 | 0 |
| 1541 | 0 |
| 1542 | 0 |
| 1543 | 0 |
| 1544 | 1.08 |
| 1545 | 0.08 |
| 1546 | 2.43 |
| 1547 | 3.33 |
| 1548 | 2.33 |
| 1549 | 1.33 |
| 1550 | 0.33 |
| 1551 | 2.83 |
| 1552 | 1.83 |
| 1553 | 4.63 |
| 1554 | 5.05 |
| 1555 | 6.49 |
| 1556 | 8.39 |
| 1557 | 7.39 |
| 1558 | 6.41 |
| 1559 | 7.65 |
| 1560 | 6.65 |
| 1561 | 5.67 |
| 1562 | 4.69 |
| 1563 | 3.71 |
| 1564 | 2.71 |
| 1565 | 4.07 |
| 1566 | 3.09 |
| 1567 | 2.11 |
| 1568 | 1.13 |
| 1569 | 0.13 |
| 1570 | 1.83 |
| 1571 | 0.85 |
| 1572 | 0 |
| 1573 | 1.74 |
| 1574 | 0.74 |
| 1575 | 0 |
| 1576 | 0 |
| 1577 | 0 |
| 1578 | 1.785 |
| 1579 | 0.79 |
| 1580 | 0 |
| 1581 | 0 |
| 1582 | 0 |
| 1583 | 0 |
| 1584 | 0.76 |
| 1585 | 0 |
| 1586 | 0 |
| 1587 | 0 |
| 1588 | 0 |
| 1589 | 0 |
| 1590 | 0 |
| 1591 | 1.66 |
| 1592 | 0.68 |
| 1593 | 0 |
| 1594 | 0 |
| 1595 | 0 |
| 1596 | 0 |
| 1597 | 1.1 |
| 1598 | 0.1 |
| 1599 | 0 |
| 1600 | 0 |
| 1601 | 0 |
| 1602 | 1.74 |
| 1603 | 4.54 |
| 1604 | 3.56 |
| 1605 | 2.58 |
| 1606 | 1.6 |
| 1607 | 0.62 |
| 1608 | 2.22 |
| 1609 | 1.22 |
| 1610 | 3.57 |
| 1611 | 2.59 |
| 1612 | 1.61 |
| 1613 | 0.63 |
| 1614 | 0 |
| 1615 | 1.32 |
| 1616 | 3.77 |
| 1617 | 4.48 |
| 1618 | 3.5 |
| 1619 | 2.52 |
| 1620 | 1.54 |
| 1621 | 0.56 |
| 1622 | 0 |
| 1623 | 1.6 |
| 1624 | 3.48 |
| 1625 | 2.48 |
| 1626 | 3.47 |
| 1627 | 2.47 |
| 1628 | 1.49 |
| 1629 | 0.51 |
| 1630 | 0 |
| 1631 | 0 |
| 1632 | 2.25 |
| 1633 | 1.25 |
| 1634 | 0.25 |
| 1635 | 0 |
| 1636 | 0 |
| 1637 | 0.91 |
| 1638 | 0 |
| 1639 | 0 |
| 1640 | 0 |
| 1641 | 0 |
| 1642 | 0.92 |
| 1643 | 0 |
| 1644 | 0 |
| 1645 | 0 |
| 1646 | 0 |
| 1647 | 1.66 |
| 1648 | 0.66 |
| 1649 | 0 |
| 1650 | 0 |
| 1651 | 2 |
| 1652 | 1.02 |
| 1653 | 2.92 |
| 1654 | 4.84 |
| 1655 | 3.86 |
| 1656 | 2.88 |
| 1657 | 1.9 |
| 1658 | 0.92 |
| 1659 | 2.14 |
| 1660 | 3.66 |
| 1661 | 2.68 |
| 1662 | 1.68 |
| 1663 | 3.58 |
| 1664 | 6.53 |
| 1665 | 5.55 |
| 1666 | 6.85 |
| 1667 | 5.85 |
| 1668 | 7.69 |
| 1669 | 6.69 |
| 1670 | 5.69 |
| 1671 | 4.71 |
| 1672 | 3.73 |
| 1673 | 2.75 |
| 1674 | 1.77 |
| 1675 | 0.79 |
| 1676 | 0 |
| 1677 | 0.82 |
| 1678 | 0 |
| 1679 | 0 |
| 1680 | 0 |
| 1681 | 0 |
| 1682 | 0 |
| 1683 | 1.447 |
| 1684 | 0.468 |
| 1685 | 0 |
| 1686 | 0 |
| 1687 | 0 |
| 1688 | 0 |
| 1689 | 2.1 |
| 1690 | 1.1 |
| 1691 | 0.12 |
| 1692 | 1.26 |
| 1693 | 3.41 |
| 1694 | 2.41 |
| 1695 | 1.41 |
| 1696 | 3.39 |
| 1697 | 2.41 |
| 1698 | 3.91 |
| 1699 | 6.56 |
| 1700 | 7.82 |
| 1701 | 6.82 |
| 1702 | 5.84 |
| 1703 | 4.86 |
| 1704 | 3.88 |
| 1705 | 2.88 |
| 1706 | 5.38 |
| 1707 | 6.76 |
| 1708 | 7.57 |
| 1709 | 9.35 |
| 1710 | 8.35 |
| 1711 | 7.35 |
| 1712 | 8.91 |
| 1713 | 7.93 |
| 1714 | 6.95 |
| 1715 | 5.97 |
| 1716 | 7.47 |
| 1717 | 8.99 |
| 1718 | 7.99 |
| 1719 | 7.01 |
| 1720 | 6.03 |
| 1721 | 8.01 |
| 1722 | 7.03 |
| 1723 | 6.05 |
| 1724 | 5.07 |
| 1725 | 6.19 |
| 1726 | 7.99 |
| 1727 | 7.01 |
| 1728 | 6.03 |
| 1729 | 5.05 |
| 1730 | 4.07 |
| 1731 | 3.07 |
| 1732 | 5.37 |
| 1733 | 4.39 |
| 1734 | 5.93 |
| 1735 | 8.58 |
| 1736 | 9.98 |
| 1737 | 8.98 |
| 1738 | 8 |
| 1739 | 7.02 |
| 1740 | 6.04 |
| 1741 | 5.04 |
| 1742 | 7.99 |
| 1743 | 7.01 |
| 1744 | 6.03 |
| 1745 | 5.05 |
| 1746 | 4.07 |
| 1747 | 3.09 |
| 1748 | 5.39 |
| 1749 | 7.17 |
| 1750 | 6.19 |
| 1751 | 5.21 |
| 1752 | 4.22 |
| 1753 | 3.24 |
| 1754 | 2.26 |
| 1755 | 1.28 |
| 1756 | 0.3 |
| 1757 | 0 |
| 1758 | 1.5 |
| 1759 | 4.2 |
| 1760 | 3.22 |
| 1761 | 2.22 |
| 1762 | 4.87 |
| 1763 | 6.573 |
| 1764 | 5.577 |
| 1765 | 4.58 |
| 1766 | 3.6 |
| 1767 | 2.62 |
| 1768 | 1.64 |
| 1769 | 4.14 |
| 1770 | 3.16 |
| 1771 | 2.18 |
| 1772 | 3.06 |
| 1773 | 2.06 |
| 1774 | 1.08 |
| 1775 | 0.1 |
| 1776 | 0 |
| 1777 | 0 |
| 1778 | 0 |
| 1779 | 0 |
| 1780 | 1.72 |
| 1781 | 0.72 |
| 1782 | 2.44 |
| 1783 | 3.84 |
| 1784 | 2.86 |
| 1785 | 1.88 |
| 1786 | 0.9 |
| 1787 | 0 |
| 1788 | 0 |
| 1789 | 1.7 |
| 1790 | 3.64 |
| 1791 | 4.417 |
| 1792 | 3.423 |
| 1793 | 2.43 |
| 1794 | 3.115 |
| 1795 | 2.12 |
| 1796 | 3.54 |
| 1797 | 6.04 |
| 1798 | 5.06 |
| 1799 | 5.907 |
| 1800 | 4.913 |
| 1801 | 3.92 |
| 1802 | 5.172 |
| 1803 | 4.184 |
| 1804 | 3.196 |
| 1805 | 2.208 |
| 1806 | 1.22 |
| 1807 | 1.75 |
| 1808 | 2.23 |
| 1809 | 2.91 |
| 1810 | 1.93 |
| 1811 | 0.95 |
| 1812 | 0 |
| 1813 | 0 |
| 1814 | 2.9 |
| 1815 | 3.76 |
| 1816 | 2.78 |
| 1817 | 1.8 |
| 1818 | 0.82 |
| 1819 | 0 |
| 1820 | 1.3 |
| 1821 | 3.26 |
| 1822 | 2.26 |
| 1823 | 3.4 |
| 1824 | 2.42 |
| 1825 | 3.26 |
| 1826 | 5.22 |
| 1827 | 4.24 |
| 1828 | 3.26 |
| 1829 | 2.28 |
| 1830 | 4.06 |
| 1831 | 5.82 |
| 1832 | 4.82 |
| 1833 | 3.84 |
| 1834 | 4.72 |
| 1835 | 6.18 |
| 1836 | 5.18 |
| 1837 | 6.22 |
| 1838 | 5.24 |
| 1839 | 4.26 |
| 1840 | 3.28 |
| 1841 | 2.3 |
| 1842 | 3.46 |
| 1843 | 2.48 |
| 1844 | 3.64 |
| 1845 | 5.36 |
| 1846 | 4.36 |
| 1847 | 5.8 |
| 1848 | 6.94 |
| 1849 | 5.96 |
| 1850 | 4.98 |
| 1851 | 4 |
| 1852 | 5.42 |
| 1853 | 4.42 |
| 1854 | 3.44 |
| 1855 | 2.46 |
| 1856 | 1.48 |
| 1857 | 2.923 |
| 1858 | 1.927 |
| 1859 | 0.93 |
| 1860 | 0 |
| 1861 | 0 |
| 1862 | 0 |
| 1863 | 1.16 |
| 1864 | 0.16 |
| 1865 | 1.58 |
| 1866 | 3.02 |
| 1867 | 2.02 |
| 1868 | 2.5 |
| 1869 | 1.52 |
| 1870 | 0.54 |
| 1871 | 0 |
| 1872 | 1.443 |
| 1873 | 0.447 |
| 1874 | 2.447 |
| 1875 | 1.447 |
| 1876 | 0.45 |
| 1877 | 2.093 |
| 1878 | 1.097 |
| 1879 | 0.097 |
| 1880 | 1.377 |
| 1881 | 3.297 |
| 1882 | 5.057 |
| 1883 | 4.057 |
| 1884 | 3.077 |
| 1885 | 2.097 |
| 1886 | 1.097 |
| 1887 | 3.547 |
| 1888 | 2.567 |
| 1889 | 1.587 |
| 1890 | 0.59 |
| 1891 | 2.253 |
| 1892 | 1.257 |
| 1893 | 3.507 |
| 1894 | 2.527 |
| 1895 | 1.547 |
| 1896 | 0.567 |
| 1897 | 0 |
| 1898 | 1.2 |
| 1899 | 0.2 |
| 1900 | 0 |
| 1901 | 0 |
| 1902 | 0 |
| 1903 | 0 |
| 1904 | 1.82 |
| 1905 | 3.26 |
| 1906 | 2.26 |
| 1907 | 1.28 |
| 1908 | 3.88 |
| 1909 | 5.93 |
| 1910 | 4.93 |
| 1911 | 7.08 |
| 1912 | 6.1 |
| 1913 | 5.12 |
| 1914 | 4.14 |
| 1915 | 6.69 |
| 1916 | 5.71 |
| 1917 | 4.73 |
| 1918 | 3.75 |
| 1919 | 2.77 |
| 1920 | 1.79 |
| 1921 | 0.81 |
| 1922 | 0 |
| 1923 | 0 |
| 1924 | 0 |
| 1925 | 2.05 |
| 1926 | 1.05 |
| 1927 | 4 |
| 1928 | 6.6 |
| 1929 | 5.62 |
| 1930 | 4.64 |
| 1931 | 6.32 |
| 1932 | 7.8 |
| 1933 | 8.86 |
| 1934 | 7.86 |
| 1935 | 6.88 |
| 1936 | 5.885 |
| 1937 | 4.89 |
| 1938 | 7.045 |
| 1939 | 6.05 |
| 1940 | 7.95 |
| 1941 | 9.09 |
| 1942 | 10.93 |
| 1943 | 9.95 |
| 1944 | 8.97 |
| 1945 | 10.43 |
| 1946 | 9.43 |
| 1947 | 10.91 |
| 1948 | 9.91 |
| 1949 | 8.93 |
| 1950 | 7.93 |
| 1951 | 9.73 |
| 1952 | 8.73 |
| 1953 | 7.75 |
| 1954 | 6.77 |
| 1955 | 5.79 |
| 1956 | 6.43 |
| 1957 | 5.43 |
| 1958 | 7.29 |
| 1959 | 6.31 |
| 1960 | 5.33 |
| 1961 | 4.35 |
| 1962 | 7.1 |
| 1963 | 6.12 |
| 1964 | 8.12 |
| 1965 | 7.12 |
| 1966 | 8.18 |
| 1967 | 8.805 |
| 1968 | 7.81 |
| 1969 | 8.91 |
| 1970 | 7.91 |
| 1971 | 10.56 |
| 1972 | 9.58 |
| 1973 | 8.6 |
| 1974 | 7.62 |
| 1975 | 6.64 |
| 1976 | 5.64 |
| 1977 | 7.3 |
| 1978 | 6.32 |
| 1979 | 5.34 |
| 1980 | 4.36 |
| 1981 | 3.38 |
| 1982 | 4.2 |
| 1983 | 3.2 |
| 1984 | 4.34 |
| 1985 | 3.36 |
| 1986 | 5.18 |
| 1987 | 5.84 |
| 1988 | 4.86 |
| 1989 | 3.86 |
| 1990 | 6.41 |
| 1991 | 5.43 |
| 1992 | 4.45 |
| 1993 | 5.93 |
| 1994 | 4.93 |
| 1995 | 3.95 |
| 1996 | 2.97 |
| 1997 | 4.65 |
| 1998 | 3.65 |
| 1999 | 5.29 |
| 2000 | 4.31 |
| 2001 | 5.51 |
| 2002 | 4.53 |
| 2003 | 3.55 |
| 2004 | 2.57 |
| 2005 | 3.85 |
| 2006 | 2.87 |
| 2007 | 3.82 |
| 2008 | 2.84 |
| 2009 | 1.86 |
| 2010 | 0.86 |
| 2011 | 3.06 |
| 2012 | 2.06 |
| 2013 | 3.96 |
| 2014 | 5.64 |
| 2015 | 4.64 |
| 2016 | 6.58 |
| 2017 | 5.58 |
| 2018 | 4.6 |
| 2019 | 3.62 |
| 2020 | 2.64 |
| 2021 | 3.245 |
| 2022 | 2.25 |
| 2023 | 3.35 |
| 2024 | 2.35 |
| 2025 | 1.37 |
| 2026 | 0.39 |
| 2027 | 0 |
| 2028 | 0 |
| 2029 | 0 |
| 2030 | 0 |
| 2031 | 0 |
| 2032 | 2.45 |
| 2033 | 1.45 |
| 2034 | 0.47 |
| 2035 | 0 |
| 2036 | 0.6 |
| 2037 | 2.8 |
| 2038 | 1.82 |
| 2039 | 2.77 |
| 2040 | 5.52 |
| 2041 | 6.94 |
| 2042 | 5.96 |
| 2043 | 4.98 |
| 2044 | 4 |
| 2045 | 3.02 |
| 2046 | 2.04 |
| 2047 | 1.06 |
| 2048 | 0.06 |
| 2049 | 0 |
| 2050 | 2.4 |
| 2051 | 3.48 |
| 2052 | 2.48 |
| 2053 | 1.5 |
| 2054 | 0.52 |
| 2055 | 0 |
| 2056 | 0 |
| 2057 | 0 |
| 2058 | 2.55 |
| 2059 | 1.57 |
| 2060 | 0.59 |
| 2061 | 2.05 |
| 2062 | 1.05 |
| 2063 | 0.07 |
| 2064 | 0 |
| 2065 | 2.1 |
| 2066 | 1.1 |
| 2067 | 0.12 |
| 2068 | 0 |
| 2069 | 0 |
| 2070 | 0 |
| 2071 | 0.83 |
| 2072 | 0 |
| 2073 | 1.98 |
| 2074 | 2.98 |
| 2075 | 4.2 |
| 2076 | 3.2 |
| 2077 | 2.2 |
| 2078 | 4.3 |
| 2079 | 3.32 |
| 2080 | 2.34 |
| 2081 | 1.36 |
| 2082 | 0.363 |
| 2083 | 2.067 |
| 2084 | 1.07 |
| 2085 | 0.09 |
| 2086 | 0 |
| 2087 | 0.51 |
| 2088 | 0 |
| 2089 | 0.71 |
| 2090 | 2.21 |
| 2091 | 1.23 |
| 2092 | 0.25 |
| 2093 | 0 |
| 2094 | 0 |
| 2095 | 1.64 |
| 2096 | 3.64 |
| 2097 | 2.643 |
| 2098 | 4.387 |
| 2099 | 3.39 |
| 2100 | 4.26 |
| 2101 | 5.56 |
| 2102 | 4.56 |
| 2103 | 3.58 |
| 2104 | 2.6 |
| 2105 | 1.62 |
| 2106 | 2.607 |
| 2107 | 1.613 |
| 2108 | 0.62 |
| 2109 | 0 |
| 2110 | 2.2 |
| 2111 | 2.91 |
| 2112 | 1.91 |
| 2113 | 0.91 |
| 2114 | 3.46 |
| 2115 | 4.07 |
| 2116 | 3.09 |
| 2117 | 2.11 |
| 2118 | 1.13 |
| 2119 | 2.77 |
| 2120 | 1.77 |
| 2121 | 0.77 |
| 2122 | 2.69 |
| 2123 | 1.71 |
| 2124 | 0.73 |
| 2125 | 1.97 |
| 2126 | 0.97 |
| 2127 | 2.23 |
| 2128 | 1.243 |
| 2129 | 0.257 |
| 2130 | 2.807 |
| 2131 | 4.067 |
| 2132 | 3.087 |
| 2133 | 4.447 |
| 2134 | 3.467 |
| 2135 | 2.487 |
| 2136 | 4.387 |
| 2137 | 6.287 |
| 2138 | 8.247 |
| 2139 | 7.267 |
| 2140 | 8.407 |
| 2141 | 7.407 |
| 2142 | 6.427 |
| 2143 | 5.447 |
| 2144 | 4.467 |
| 2145 | 3.487 |
| 2146 | 2.507 |
| 2147 | 1.527 |
| 2148 | 0.547 |
| 2149 | 0 |
| 2150 | 0 |
| 2151 | 0 |
| 2152 | 0 |
| 2153 | 0 |
| 2154 | 1.68 |
| 2155 | 0.7 |
| 2156 | 0 |
| 2157 | 1.84 |
| 2158 | 0.84 |
| 2159 | 0 |
| 2160 | 2.9 |
| 2161 | 1.9 |
| 2162 | 4.15 |
| 2163 | 5.35 |
| 2164 | 4.37 |
| 2165 | 3.39 |
| 2166 | 4.47 |
| 2167 | 6.39 |
| 2168 | 5.41 |
| 2169 | 6.61 |
| 2170 | 8.13 |
| 2171 | 10.58 |
| 2172 | 9.58 |
| 2173 | 10.84 |
| 2174 | 9.84 |
| 2175 | 8.84 |
| 2176 | 11.04 |
| 2177 | 13.89 |
| 2178 | 16.54 |
| 2179 | 18.79 |
| 2180 | 20.21 |
| 2181 | 19.21 |
| 2182 | 18.23 |
| 2183 | 17.25 |
| 2184 | 16.27 |
| 2185 | 15.29 |
| 2186 | 16.97 |
| 2187 | 18.61 |
| 2188 | 17.61 |
| 2189 | 19.17 |
| 2190 | 18.19 |
| 2191 | 17.21 |
| 2192 | 16.23 |
| 2193 | 15.25 |
| 2194 | 14.25 |
| 2195 | 16.11 |
| 2196 | 15.11 |
| 2197 | 15.805 |
| 2198 | 14.81 |
| 2199 | 13.83 |
| 2200 | 12.85 |
| 2201 | 11.87 |
| 2202 | 10.89 |
| 2203 | 9.898 |
| 2204 | 11.565 |
| 2205 | 10.572 |
| 2206 | 9.58 |
| 2207 | 8.6 |
| 2208 | 7.62 |
| 2209 | 6.64 |
| 2210 | 5.66 |
| 2211 | 4.66 |
| 2212 | 6.58 |
| 2213 | 5.6 |
| 2214 | 4.62 |
| 2215 | 6.72 |
| 2216 | 5.72 |
| 2217 | 4.72 |
| 2218 | 6.92 |
| 2219 | 8.8 |
| 2220 | 10.56 |
| 2221 | 9.56 |
| 2222 | 8.56 |
| 2223 | 7.56 |
| 2224 | 9.28 |
| 2225 | 11.93 |
| 2226 | 12.345 |
| 2227 | 11.35 |
| 2228 | 10.37 |
| 2229 | 10.79 |
| 2230 | 9.79 |
| 2231 | 11.84 |
| 2232 | 10.86 |
| 2233 | 9.88 |
| 2234 | 8.9 |
| 2235 | 7.908 |
| 2236 | 9.195 |
| 2237 | 8.203 |
| 2238 | 7.21 |
| 2239 | 6.23 |
| 2240 | 5.25 |
| 2241 | 4.27 |
| 2242 | 3.29 |
| 2243 | 4.59 |
| 2244 | 3.59 |
| 2245 | 2.61 |
| 2246 | 1.63 |
| 2247 | 0.65 |
| 2248 | 0 |
| 2249 | 0 |
| 2250 | 1.56 |
| 2251 | 0.58 |
| 2252 | 0 |
| 2253 | 0 |
| 2254 | 2.1 |
| 2255 | 4 |
| 2256 | 3 |
| 2257 | 2.02 |
| 2258 | 1.04 |
| 2259 | 2.88 |
| 2260 | 1.9 |
| 2261 | 0.92 |
| 2262 | 0 |
| 2263 | 0 |
| 2264 | 0 |
| 2265 | 0 |
| 2266 | 0 |
| 2267 | 0 |
| 2268 | 0.93 |
| 2269 | 0 |
| 2270 | 0 |
| 2271 | 0 |
| 2272 | 0.79 |
| 2273 | 0 |
| 2274 | 0 |
| 2275 | 2.6 |
| 2276 | 1.62 |
| 2277 | 0.62 |
| 2278 | 3.22 |
| 2279 | 4.38 |
| 2280 | 3.38 |
| 2281 | 2.4 |
| 2282 | 1.4 |
| 2283 | 4.15 |
| 2284 | 5.533 |
| 2285 | 4.537 |
| 2286 | 3.54 |
| 2287 | 2.56 |
| 2288 | 1.58 |
| 2289 | 0.58 |
| 2290 | 2.98 |
| 2291 | 1.99 |
| 2292 | 1.01 |
| 2293 | 0.03 |
| 2294 | 1.45 |
| 2295 | 3.8 |
| 2296 | 2.82 |
| 2297 | 4.38 |
| 2298 | 3.4 |
| 2299 | 2.42 |
| 2300 | 5.27 |
| 2301 | 4.29 |
| 2302 | 3.31 |
| 2303 | 2.33 |
| 2304 | 1.33 |
| 2305 | 4.03 |
| 2306 | 6.28 |
| 2307 | 5.3 |
| 2308 | 4.32 |
| 2309 | 3.34 |
| 2310 | 2.36 |
| 2311 | 4.18 |
| 2312 | 6.23 |
| 2313 | 5.23 |
| 2314 | 4.25 |
| 2315 | 5.45 |
| 2316 | 6.83 |
| 2317 | 8.31 |
| 2318 | 7.31 |
| 2319 | 10.11 |
| 2320 | 9.13 |
| 2321 | 8.15 |
| 2322 | 7.17 |
| 2323 | 6.19 |
| 2324 | 5.21 |
| 2325 | 4.215 |
| 2326 | 3.22 |
| 2327 | 5.375 |
| 2328 | 4.38 |
| 2329 | 3.4 |
| 2330 | 4.58 |
| 2331 | 3.6 |
| 2332 | 2.62 |
| 2333 | 3.96 |
| 2334 | 2.98 |
| 2335 | 2 |
| 2336 | 1.02 |
| 2337 | 0.04 |
| 2338 | 2.79 |
| 2339 | 1.79 |
| 2340 | 0.81 |
| 2341 | 1.395 |
| 2342 | 0.4 |
| 2343 | 0 |
| 2344 | 0 |
| 2345 | 0 |
| 2346 | 0 |
| 2347 | 1.92 |
| 2348 | 0.94 |
| 2349 | 0 |
| 2350 | 1.603 |
| 2351 | 0.607 |
| 2352 | 0 |
| 2353 | 0 |
| 2354 | 0 |
| 2355 | 0 |
| 2356 | 0 |
| 2357 | 2.2 |
| 2358 | 3.24 |
| 2359 | 2.26 |
| 2360 | 1.28 |
| 2361 | 0.28 |
| 2362 | 0 |
| 2363 | 2.85 |
| 2364 | 5.45 |
| 2365 | 4.45 |
| 2366 | 3.47 |
| 2367 | 6.02 |
| 2368 | 5.02 |
| 2369 | 5.625 |
| 2370 | 4.63 |
| 2371 | 3.65 |
| 2372 | 4.87 |
| 2373 | 6.293 |
| 2374 | 5.297 |
| 2375 | 4.3 |
| 2376 | 3.32 |
| 2377 | 2.34 |
| 2378 | 1.36 |
| 2379 | 0.38 |
| 2380 | 0 |
| 2381 | 2.35 |
| 2382 | 4.29 |
| 2383 | 3.29 |
| 2384 | 2.29 |
| 2385 | 4.23 |
| 2386 | 3.23 |
| 2387 | 5.83 |
| 2388 | 6.79 |
| 2389 | 7.53 |
| 2390 | 6.55 |
| 2391 | 7.77 |
| 2392 | 9.23 |
| 2393 | 8.23 |
| 2394 | 7.23 |
| 2395 | 7.76 |
| 2396 | 6.78 |
| 2397 | 8.4 |
| 2398 | 7.4 |
| 2399 | 9.8 |
| 2400 | 10.9 |
| 2401 | 9.9 |
| 2402 | 11.22 |
| 2403 | 10.24 |
| 2404 | 9.26 |
| 2405 | 10.82 |
| 2406 | 13.32 |
| 2407 | 14.8 |
| 2408 | 13.8 |
| 2409 | 16.7 |
| 2410 | 15.7 |
| 2411 | 14.7 |
| 2412 | 17.4 |
| 2413 | 19.24 |
| 2414 | 18.24 |
| 2415 | 17.26 |
| 2416 | 18.92 |
| 2417 | 17.94 |
| 2418 | 16.96 |
| 2419 | 17.66 |
| 2420 | 19.14 |
| 2421 | 18.16 |
| 2422 | 17.163 |
| 2423 | 18.787 |
| 2424 | 17.79 |
| 2425 | 16.81 |
| 2426 | 15.813 |
| 2427 | 17.557 |
| 2428 | 16.56 |
| 2429 | 19.06 |
| 2430 | 18.06 |
| 2431 | 18.55 |
| 2432 | 17.57 |
| 2433 | 16.59 |
| 2434 | 15.61 |
| 2435 | 14.63 |
| 2436 | 13.65 |
| 2437 | 16.1 |
| 2438 | 15.12 |
| 2439 | 14.14 |
| 2440 | 13.16 |
| 2441 | 12.16 |
| 2442 | 14.76 |
| 2443 | 13.78 |
| 2444 | 12.8 |
| 2445 | 11.82 |
| 2446 | 10.84 |
| 2447 | 9.86 |
| 2448 | 8.88 |
| 2449 | 7.883 |
| 2450 | 9.627 |
| 2451 | 8.63 |
| 2452 | 7.63 |
| 2453 | 9.83 |
| 2454 | 8.85 |
| 2455 | 10.21 |
| 2456 | 11.357 |
| 2457 | 10.363 |
| 2458 | 9.37 |
| 2459 | 8.39 |
| 2460 | 7.41 |
| 2461 | 9.71 |
| 2462 | 12.16 |
| 2463 | 11.18 |
| 2464 | 10.2 |
| 2465 | 11.26 |
| 2466 | 10.26 |
| 2467 | 9.28 |
| 2468 | 8.3 |
| 2469 | 7.32 |
| 2470 | 6.34 |
| 2471 | 5.343 |
| 2472 | 4.345 |
| 2473 | 7.098 |
| 2474 | 6.1 |
| 2475 | 5.12 |
| 2476 | 4.14 |
| 2477 | 3.16 |
| 2478 | 2.18 |
| 2479 | 1.2 |
| 2480 | 2.46 |
| 2481 | 3.66 |
| 2482 | 2.66 |
| 2483 | 4.02 |
| 2484 | 3.04 |
| 2485 | 2.06 |
| 2486 | 1.08 |
| 2487 | 0.1 |
| 2488 | 0 |
| 2489 | 1.548 |
| 2490 | 0.555 |
| 2491 | 0 |
| 2492 | 0 |
| 2493 | 2.25 |
| 2494 | 3.47 |
| 2495 | 2.49 |
| 2496 | 1.51 |
| 2497 | 0.53 |
| 2498 | 0 |
| 2499 | 0 |
| 2500 | 0 |
| 2501 | 0 |
| 2502 | 0 |
| 2503 | 2.15 |
| 2504 | 1.15 |
| 2505 | 2.27 |
| 2506 | 3.11 |
| 2507 | 2.11 |
| 2508 | 3.45 |
| 2509 | 4.43 |
| 2510 | 3.43 |
| 2511 | 2.433 |
| 2512 | 3.957 |
| 2513 | 2.96 |
| 2514 | 4.22 |
| 2515 | 6 |
| 2516 | 8.45 |
| 2517 | 11.05 |
| 2518 | 13.6 |
| 2519 | 12.62 |
| 2520 | 11.64 |
| 2521 | 10.66 |
| 2522 | 9.66 |
| 2523 | 11.86 |
| 2524 | 10.86 |
| 2525 | 9.88 |
| 2526 | 8.883 |
| 2527 | 10.167 |
| 2528 | 9.17 |
| 2529 | 10.57 |
| 2530 | 11.63 |
| 2531 | 10.63 |
| 2532 | 9.65 |
| 2533 | 8.67 |
| 2534 | 9.49 |
| 2535 | 8.49 |
| 2536 | 10.74 |
| 2537 | 12.56 |
| 2538 | 15.01 |
| 2539 | 16.07 |
| 2540 | 16.645 |
| 2541 | 15.65 |
| 2542 | 17.9 |
| 2543 | 16.92 |
| 2544 | 15.94 |
| 2545 | 18.39 |
| 2546 | 17.41 |
| 2547 | 18.89 |
| 2548 | 20.69 |
| 2549 | 19.71 |
| 2550 | 18.73 |
| 2551 | 20.07 |
| 2552 | 21.59 |
| 2553 | 20.59 |
| 2554 | 19.59 |
| 2555 | 21.64 |
| 2556 | 20.64 |
| 2557 | 22.74 |
| 2558 | 21.74 |
| 2559 | 23.6 |
| 2560 | 22.6 |
| 2561 | 23.44 |
| 2562 | 22.44 |
| 2563 | 21.46 |
| 2564 | 20.48 |
| 2565 | 19.5 |
| 2566 | 21.28 |
| 2567 | 20.3 |
| 2568 | 19.32 |
| 2569 | 18.34 |
| 2570 | 20.59 |
| 2571 | 22.84 |
| 2572 | 21.84 |
| 2573 | 20.86 |
| 2574 | 19.88 |
| 2575 | 18.9 |
| 2576 | 17.92 |
| 2577 | 18.74 |
| 2578 | 20.68 |
| 2579 | 19.68 |
| 2580 | 18.68 |
| 2581 | 21.53 |
| 2582 | 20.55 |
| 2583 | 19.57 |
| 2584 | 18.59 |
| 2585 | 17.61 |
| 2586 | 16.61 |
| 2587 | 19.01 |
| 2588 | 21.71 |
| 2589 | 22.85 |
| 2590 | 24.75 |
| 2591 | 23.77 |
| 2592 | 22.79 |
| 2593 | 21.81 |
| 2594 | 20.83 |
| 2595 | 19.85 |
| 2596 | 18.87 |
| 2597 | 17.87 |
| 2598 | 20.12 |
| 2599 | 19.14 |
| 2600 | 18.14 |
| 2601 | 20.64 |
| 2602 | 19.64 |
| 2603 | 18.64 |
| 2604 | 20.94 |
| 2605 | 19.96 |
| 2606 | 18.96 |
| 2607 | 21.76 |
| 2608 | 23.7 |
| 2609 | 22.7 |
| 2610 | 24.02 |
| 2611 | 23.04 |
| 2612 | 22.06 |
| 2613 | 21.08 |
| 2614 | 22.42 |
| 2615 | 23.76 |
| 2616 | 22.76 |
| 2617 | 21.78 |
| 2618 | 20.8 |
| 2619 | 19.82 |
| 2620 | 18.84 |
| 2621 | 17.86 |
| 2622 | 19.54 |
| 2623 | 18.54 |
| 2624 | 17.56 |
| 2625 | 19.08 |
| 2626 | 18.08 |
| 2627 | 17.1 |
| 2628 | 16.12 |
| 2629 | 15.14 |
| 2630 | 14.16 |
| 2631 | 16.71 |
| 2632 | 15.71 |
| 2633 | 14.73 |
| 2634 | 13.75 |
| 2635 | 15.27 |
| 2636 | 14.27 |
| 2637 | 15.55 |
| 2638 | 14.57 |
| 2639 | 15.12 |
| 2640 | 16.44 |
| 2641 | 19.24 |
| 2642 | 18.24 |
| 2643 | 20.99 |
| 2644 | 22.23 |
| 2645 | 21.25 |
| 2646 | 20.27 |
| 2647 | 19.29 |
| 2648 | 20.237 |
| 2649 | 19.243 |
| 2650 | 18.25 |
| 2651 | 19.91 |
| 2652 | 22.61 |
| 2653 | 21.63 |
| 2654 | 20.65 |
| 2655 | 19.67 |
| 2656 | 18.69 |
| 2657 | 17.71 |
| 2658 | 16.73 |
| 2659 | 15.73 |
| 2660 | 17.71 |
| 2661 | 16.71 |
| 2662 | 15.73 |
| 2663 | 16.77 |
| 2664 | 15.79 |
| 2665 | 14.81 |
| 2666 | 13.83 |
| 2667 | 12.85 |
| 2668 | 11.87 |
| 2669 | 10.87 |
| 2670 | 9.87 |
| 2671 | 12.42 |
| 2672 | 11.44 |
| 2673 | 12.35 |
| 2674 | 11.35 |
| 2675 | 10.35 |
| 2676 | 13.25 |
| 2677 | 15.19 |
| 2678 | 16.79 |
| 2679 | 15.79 |
| 2680 | 14.81 |
| 2681 | 13.83 |
| 2682 | 12.85 |
| 2683 | 11.87 |
| 2684 | 10.89 |
| 2685 | 9.91 |
| 2686 | 11.71 |
| 2687 | 10.73 |
| 2688 | 9.73 |
| 2689 | 12.58 |
| 2690 | 11.6 |
| 2691 | 10.62 |
| 2692 | 11.035 |
| 2693 | 10.04 |
| 2694 | 9.06 |
| 2695 | 11.11 |
| 2696 | 12.75 |
| 2697 | 14.53 |
| 2698 | 13.53 |
| 2699 | 15.93 |
| 2700 | 14.95 |
| 2701 | 13.97 |
| 2702 | 12.99 |
| 2703 | 12.01 |
| 2704 | 13.43 |
| 2705 | 15.53 |
| 2706 | 14.53 |
| 2707 | 13.55 |
| 2708 | 12.57 |
| 2709 | 11.59 |
| 2710 | 13.29 |
| 2711 | 12.29 |
| 2712 | 11.31 |
| 2713 | 13.15 |
| 2714 | 12.15 |
| 2715 | 14.15 |
| 2716 | 13.15 |
| 2717 | 12.17 |
| 2718 | 11.19 |
| 2719 | 12.53 |
| 2720 | 11.53 |
| 2721 | 10.53 |
| 2722 | 13.03 |
| 2723 | 14.83 |
| 2724 | 13.83 |
| 2725 | 12.83 |
| 2726 | 11.85 |
| 2727 | 10.87 |
| 2728 | 9.89 |
| 2729 | 8.91 |
| 2730 | 7.93 |
| 2731 | 6.95 |
| 2732 | 8.03 |
| 2733 | 7.05 |
| 2734 | 8.25 |
| 2735 | 7.27 |
| 2736 | 6.29 |
| 2737 | 7.37 |
| 2738 | 9.67 |
| 2739 | 8.67 |
| 2740 | 7.69 |
| 2741 | 6.71 |
| 2742 | 5.73 |
| 2743 | 7.53 |
| 2744 | 6.55 |
| 2745 | 5.57 |
| 2746 | 7.77 |
| 2747 | 6.79 |
| 2748 | 5.81 |
| 2749 | 4.83 |
| 2750 | 3.85 |
| 2751 | 4.897 |
| 2752 | 3.903 |
| 2753 | 2.91 |
| 2754 | 1.93 |
| 2755 | 0.95 |
| 2756 | 0 |
| 2757 | 1.1 |
| 2758 | 0.1 |
| 2759 | 0 |
| 2760 | 1.42 |
| 2761 | 3.97 |
| 2762 | 2.97 |
| 2763 | 1.97 |
| 2764 | 4.32 |
| 2765 | 3.34 |
| 2766 | 2.36 |
| 2767 | 1.38 |
| 2768 | 0.4 |
| 2769 | 0 |
| 2770 | 0 |
| 2771 | 0 |
| 2772 | 0 |
| 2773 | 2 |
| 2774 | 1 |
| 2775 | 2.38 |
| 2776 | 4.43 |
| 2777 | 3.45 |
| 2778 | 2.47 |
| 2779 | 4.33 |
| 2780 | 3.33 |
| 2781 | 2.35 |
| 2782 | 4.45 |
| 2783 | 3.45 |
| 2784 | 5.65 |
| 2785 | 4.65 |
| 2786 | 6.35 |
| 2787 | 5.37 |
| 2788 | 4.39 |
| 2789 | 3.41 |
| 2790 | 2.41 |
| 2791 | 3.47 |
| 2792 | 2.49 |
| 2793 | 1.51 |
| 2794 | 0.53 |
| 2795 | 1.57 |
| 2796 | 0.57 |
| 2797 | 0 |
| 2798 | 0 |
| 2799 | 0 |
| 2800 | 0 |
| 2801 | 0 |
| 2802 | 0 |
| 2803 | 1.72 |
| 2804 | 0.72 |
| 2805 | 0 |
| 2806 | 0 |
| 2807 | 1 |
| 2808 | 1.8 |
| 2809 | 4.1 |
| 2810 | 3.1 |
| 2811 | 4.38 |
| 2812 | 3.4 |
| 2813 | 2.42 |
| 2814 | 1.44 |
| 2815 | 0.447 |
| 2816 | 2.155 |
| 2817 | 1.162 |
| 2818 | 0.17 |
| 2819 | 0 |
| 2820 | 1.76 |
| 2821 | 0.76 |
| 2822 | 0 |
| 2823 | 1.92 |
| 2824 | 4.87 |
| 2825 | 3.89 |
| 2826 | 2.91 |
| 2827 | 1.93 |
| 2828 | 3.673 |
| 2829 | 2.677 |
| 2830 | 1.68 |
| 2831 | 0.7 |
| 2832 | 0 |
| 2833 | 1.08 |
| 2834 | 2.4 |
| 2835 | 1.4 |
| 2836 | 3.14 |
| 2837 | 2.14 |
| 2838 | 1.16 |
| 2839 | 2.8 |
| 2840 | 1.8 |
| 2841 | 3.02 |
| 2842 | 4.3 |
| 2843 | 6.2 |
| 2844 | 5.2 |
| 2845 | 4.2 |
| 2846 | 7.15 |
| 2847 | 6.17 |
| 2848 | 5.19 |
| 2849 | 4.21 |
| 2850 | 3.21 |
| 2851 | 4.81 |
| 2852 | 3.83 |
| 2853 | 2.85 |
| 2854 | 1.87 |
| 2855 | 0.89 |
| 2856 | 0 |
| 2857 | 0 |
| 2858 | 0 |
| 2859 | 0 |
| 2860 | 2.25 |
| 2861 | 1.256 |
| 2862 | 0.262 |
| 2863 | 0 |
| 2864 | 0 |
| 2865 | 2.606 |
| 2866 | 1.626 |
| 2867 | 0.646 |
| 2868 | 0 |
| 2869 | 1.36 |
| 2870 | 0.36 |
| 2871 | 0 |
| 2872 | 0 |
| 2873 | 0 |
| 2874 | 0 |
| 2875 | 0 |
| 2876 | 2.45 |
| 2877 | 1.47 |
| 2878 | 0.49 |
| 2879 | 0 |
| 2880 | 0.86 |
| 2881 | 0 |
| 2882 | 0 |
| 2883 | 0 |
| 2884 | 0.96 |
| 2885 | 0 |
| 2886 | 0 |
| 2887 | 0 |
| 2888 | 0 |
| 2889 | 0 |
| 2890 | 0 |
| 2891 | 2.55 |
| 2892 | 4.03 |
| 2893 | 3.05 |
| 2894 | 2.07 |
| 2895 | 1.09 |
| 2896 | 0.11 |
| 2897 | 0 |
| 2898 | 1.68 |
| 2899 | 0.7 |
| 2900 | 1.98 |
| 2901 | 0.98 |
| 2902 | 3.38 |
| 2903 | 2.38 |
| 2904 | 1.4 |
| 2905 | 2.08 |
| 2906 | 1.1 |
| 2907 | 0.12 |
| 2908 | 0 |
| 2909 | 0 |
| 2910 | 0 |
| 2911 | 1.42 |
| 2912 | 3.12 |
| 2913 | 2.12 |
| 2914 | 4.72 |
| 2915 | 5.72 |
| 2916 | 4.72 |
| 2917 | 5.907 |
| 2918 | 4.913 |
| 2919 | 3.92 |
| 2920 | 2.94 |
| 2921 | 1.96 |
| 2922 | 0.98 |
| 2923 | 1.49 |
| 2924 | 0.49 |
| 2925 | 3.19 |
| 2926 | 2.192 |
| 2927 | 1.195 |
| 2928 | 0.197 |
| 2929 | 2.6 |
| 2930 | 4.7 |
| 2931 | 3.71 |
| 2932 | 2.73 |
| 2933 | 1.75 |
| 2934 | 2.74 |
| 2935 | 1.74 |
| 2936 | 0.76 |
| 2937 | 0 |
| 2938 | 0 |
| 2939 | 0 |
| 2940 | 0 |
| 2941 | 0 |
| 2942 | 0 |
| 2943 | 1.28 |
| 2944 | 3.53 |
| 2945 | 5.21 |
| 2946 | 4.23 |
| 2947 | 3.25 |
| 2948 | 2.27 |
| 2949 | 3.95 |
| 2950 | 2.97 |
| 2951 | 4.53 |
| 2952 | 3.53 |
| 2953 | 2.53 |
| 2954 | 4.68 |
| 2955 | 3.7 |
| 2956 | 4.727 |
| 2957 | 3.733 |
| 2958 | 2.74 |
| 2959 | 1.76 |
| 2960 | 4.51 |
| 2961 | 3.53 |
| 2962 | 2.55 |
| 2963 | 1.55 |
| 2964 | 3.6 |
| 2965 | 5.44 |
| 2966 | 4.46 |
| 2967 | 3.46 |
| 2968 | 4.72 |
| 2969 | 5.98 |
| 2970 | 4.98 |
| 2971 | 7.23 |
| 2972 | 6.25 |
| 2973 | 5.27 |
| 2974 | 4.29 |
| 2975 | 3.31 |
| 2976 | 5.05 |
| 2977 | 6.81 |
| 2978 | 9.21 |
| 2979 | 8.23 |
| 2980 | 7.25 |
| 2981 | 8.55 |
| 2982 | 7.57 |
| 2983 | 6.59 |
| 2984 | 5.59 |
| 2985 | 8.44 |
| 2986 | 7.46 |
| 2987 | 6.48 |
| 2988 | 5.48 |
| 2989 | 8.43 |
| 2990 | 9.61 |
| 2991 | 11.55 |
| 2992 | 10.55 |
| 2993 | 9.55 |
| 2994 | 11.31 |
| 2995 | 13.03 |
| 2996 | 14.41 |
| 2997 | 16.81 |
| 2998 | 15.81 |
| 2999 | 18.11 |
| 3000 | 17.13 |
| 3001 | 16.15 |
| 3002 | 15.17 |
| 3003 | 14.19 |
| 3004 | 15.45 |
| 3005 | 17.6 |
| 3006 | 16.62 |
| 3007 | 15.64 |
| 3008 | 14.66 |
| 3009 | 13.68 |
| 3010 | 15.68 |
| 3011 | 17.4 |
| 3012 | 16.4 |
| 3013 | 18.4 |
| 3014 | 20.22 |
| 3015 | 19.24 |
| 3016 | 18.26 |
| 3017 | 17.28 |
| 3018 | 16.3 |
| 3019 | 15.3 |
| 3020 | 17.22 |
| 3021 | 18.64 |
| 3022 | 20.99 |
| 3023 | 19.99 |
| 3024 | 22.44 |
| 3025 | 24.64 |
| 3026 | 23.66 |
| 3027 | 22.68 |
| 3028 | 21.7 |
| 3029 | 20.72 |
| 3030 | 21.48 |
| 3031 | 24.13 |
| 3032 | 23.15 |
| 3033 | 22.15 |
| 3034 | 23.99 |
| 3035 | 26.94 |
| 3036 | 29.79 |
| 3037 | 28.81 |
| 3038 | 27.81 |
| 3039 | 29.65 |
| 3040 | 28.67 |
| 3041 | 27.69 |
| 3042 | 26.71 |
| 3043 | 25.73 |
| 3044 | 24.73 |
| 3045 | 26.47 |
| 3046 | 25.49 |
| 3047 | 24.51 |
| 3048 | 23.51 |
| 3049 | 25.81 |
| 3050 | 27.77 |
| 3051 | 26.77 |
| 3052 | 28.29 |
| 3053 | 27.31 |
| 3054 | 26.33 |
| 3055 | 25.33 |
| 3056 | 27.73 |
| 3057 | 30.48 |
| 3058 | 29.5 |
| 3059 | 28.5 |
| 3060 | 30.46 |
| 3061 | 29.48 |
| 3062 | 28.5 |
| 3063 | 27.52 |
| 3064 | 26.54 |
| 3065 | 25.56 |
| 3066 | 24.58 |
| 3067 | 23.6 |
| 3068 | 24.88 |
| 3069 | 23.88 |
| 3070 | 25.24 |
| 3071 | 24.26 |
| 3072 | 23.28 |
| 3073 | 22.3 |
| 3074 | 21.32 |
| 3075 | 20.34 |
| 3076 | 19.36 |
| 3077 | 18.38 |
| 3078 | 17.4 |
| 3079 | 16.42 |
| 3080 | 15.44 |
| 3081 | 14.46 |
| 3082 | 15.98 |
| 3083 | 14.98 |
| 3084 | 14 |
| 3085 | 16.05 |
| 3086 | 15.07 |
| 3087 | 14.09 |
| 3088 | 13.11 |
| 3089 | 12.13 |
| 3090 | 11.15 |
| 3091 | 10.17 |
| 3092 | 9.19 |
| 3093 | 8.19 |
| 3094 | 10.99 |
| 3095 | 10.01 |
| 3096 | 9.01 |
| 3097 | 8.01 |
| 3098 | 10.41 |
| 3099 | 9.43 |
| 3100 | 12.08 |
| 3101 | 11.08 |
| 3102 | 13.38 |
| 3103 | 12.4 |
| 3104 | 13.03 |
| 3105 | 13.79 |
| 3106 | 12.79 |
| 3107 | 11.79 |
| 3108 | 10.79 |
| 3109 | 13.64 |
| 3110 | 12.66 |
| 3111 | 15.61 |
| 3112 | 14.63 |
| 3113 | 13.65 |
| 3114 | 12.67 |
| 3115 | 14.82 |
| 3116 | 17.32 |
| 3117 | 16.32 |
| 3118 | 15.34 |
| 3119 | 16.19 |
| 3120 | 15.19 |
| 3121 | 14.21 |
| 3122 | 13.23 |
| 3123 | 15.11 |
| 3124 | 14.11 |
| 3125 | 13.13 |
| 3126 | 12.137 |
| 3127 | 13.163 |
| 3128 | 12.17 |
| 3129 | 11.19 |
| 3130 | 10.21 |
| 3131 | 12.71 |
| 3132 | 11.71 |
| 3133 | 10.71 |
| 3134 | 13.51 |
| 3135 | 15.09 |
| 3136 | 14.11 |
| 3137 | 15.03 |
| 3138 | 14.03 |
| 3139 | 13.05 |
| 3140 | 12.07 |
| 3141 | 11.09 |
| 3142 | 10.11 |
| 3143 | 9.11 |
| 3144 | 8.11 |
| 3145 | 10.51 |
| 3146 | 9.53 |
| 3147 | 8.55 |
| 3148 | 7.57 |
| 3149 | 6.59 |
| 3150 | 5.59 |
| 3151 | 7.89 |
| 3152 | 6.91 |
| 3153 | 8.09 |
| 3154 | 7.095 |
| 3155 | 9.15 |
| 3156 | 8.155 |
| 3157 | 7.16 |
| 3158 | 6.18 |
| 3159 | 5.2 |
| 3160 | 4.2 |
| 3161 | 5.64 |
| 3162 | 4.643 |
| 3163 | 6.027 |
| 3164 | 5.03 |
| 3165 | 7.38 |
| 3166 | 6.38 |
| 3167 | 5.38 |
| 3168 | 4.4 |
| 3169 | 6.04 |
| 3170 | 5.04 |
| 3171 | 7.04 |
| 3172 | 6.04 |
| 3173 | 7.58 |
| 3174 | 9.56 |
| 3175 | 8.56 |
| 3176 | 7.58 |
| 3177 | 6.6 |
| 3178 | 5.62 |
| 3179 | 6.27 |
| 3180 | 5.27 |
| 3181 | 8.07 |
| 3182 | 7.07 |
| 3183 | 9.62 |
| 3184 | 8.62 |
| 3185 | 10.3 |
| 3186 | 9.32 |
| 3187 | 8.34 |
| 3188 | 7.36 |
| 3189 | 6.38 |
| 3190 | 5.4 |
| 3191 | 7.7 |
| 3192 | 6.7 |
| 3193 | 5.7 |
| 3194 | 6.84 |
| 3195 | 8.48 |
| 3196 | 7.5 |
| 3197 | 6.52 |
| 3198 | 5.54 |
| 3199 | 4.56 |
| 3200 | 6.18 |
| 3201 | 8.48 |
| 3202 | 11.13 |
| 3203 | 10.13 |
| 3204 | 9.15 |
| 3205 | 8.17 |
| 3206 | 7.19 |
| 3207 | 6.21 |
| 3208 | 5.23 |
| 3209 | 6.22 |
| 3210 | 7.06 |
| 3211 | 6.06 |
| 3212 | 5.08 |
| 3213 | 4.1 |
| 3214 | 3.12 |
| 3215 | 2.14 |
| 3216 | 1.16 |
| 3217 | 2.78 |
| 3218 | 4.76 |
| 3219 | 3.76 |
| 3220 | 6.01 |
| 3221 | 6.67 |
| 3222 | 5.69 |
| 3223 | 4.71 |
| 3224 | 3.73 |
| 3225 | 2.75 |
| 3226 | 5.4 |
| 3227 | 4.42 |
| 3228 | 3.44 |
| 3229 | 2.46 |
| 3230 | 1.46 |
| 3231 | 3.76 |
| 3232 | 2.78 |
| 3233 | 1.8 |
| 3234 | 0.82 |
| 3235 | 0 |
| 3236 | 2 |
| 3237 | 1 |
| 3238 | 3 |
| 3239 | 2.02 |
| 3240 | 3.6 |
| 3241 | 4.38 |
| 3242 | 5.05 |
| 3243 | 4.07 |
| 3244 | 5.633 |
| 3245 | 4.637 |
| 3246 | 3.64 |
| 3247 | 2.66 |
| 3248 | 1.68 |
| 3249 | 0.7 |
| 3250 | 1.69 |
| 3251 | 3.33 |
| 3252 | 5.73 |
| 3253 | 4.75 |
| 3254 | 3.77 |
| 3255 | 2.79 |
| 3256 | 3.697 |
| 3257 | 2.703 |
| 3258 | 1.71 |
| 3259 | 0.73 |
| 3260 | 2.21 |
| 3261 | 3.87 |
| 3262 | 2.87 |
| 3263 | 5.32 |
| 3264 | 4.32 |
| 3265 | 6.67 |
| 3266 | 7.91 |
| 3267 | 6.91 |
| 3268 | 9.11 |
| 3269 | 8.13 |
| 3270 | 7.15 |
| 3271 | 6.15 |
| 3272 | 8.8 |
| 3273 | 10.54 |
| 3274 | 9.56 |
| 3275 | 11.28 |
| 3276 | 10.28 |
| 3277 | 11.84 |
| 3278 | 10.84 |
| 3279 | 12.36 |
| 3280 | 14 |
| 3281 | 13 |
| 3282 | 12 |
| 3283 | 14.65 |
| 3284 | 15.095 |
| 3285 | 14.1 |
| 3286 | 13.12 |
| 3287 | 12.14 |
| 3288 | 14.12 |
| 3289 | 13.12 |
| 3290 | 14.06 |
| 3291 | 15.98 |
| 3292 | 17.06 |
| 3293 | 16.06 |
| 3294 | 15.06 |
| 3295 | 14.06 |
| 3296 | 17.01 |
| 3297 | 16.03 |
| 3298 | 15.05 |
| 3299 | 14.07 |
| 3300 | 13.09 |
| 3301 | 12.11 |
| 3302 | 11.13 |
| 3303 | 10.15 |
| 3304 | 9.17 |
| 3305 | 8.19 |
| 3306 | 7.21 |
| 3307 | 6.23 |
| 3308 | 5.25 |
| 3309 | 4.27 |
| 3310 | 3.29 |
| 3311 | 2.31 |
| 3312 | 1.31 |
| 3313 | 0.31 |
| 3314 | 2.61 |
| 3315 | 1.63 |
| 3316 | 2.69 |
| 3317 | 1.71 |
| 3318 | 0.71 |
| 3319 | 2.29 |
| 3320 | 1.29 |
| 3321 | 0.29 |
| 3322 | 2.39 |
| 3323 | 1.39 |
| 3324 | 3.94 |
| 3325 | 2.94 |
| 3326 | 1.94 |
| 3327 | 4.34 |
| 3328 | 6.34 |
| 3329 | 5.36 |
| 3330 | 4.38 |
| 3331 | 3.4 |
| 3332 | 4.52 |
| 3333 | 6.16 |
| 3334 | 7.18 |
| 3335 | 6.18 |
| 3336 | 5.183 |
| 3337 | 6.767 |
| 3338 | 5.77 |
| 3339 | 7.45 |
| 3340 | 6.47 |
| 3341 | 8.82 |
| 3342 | 9.5 |
| 3343 | 8.503 |
| 3344 | 10.047 |
| 3345 | 9.05 |
| 3346 | 8.07 |
| 3347 | 7.09 |
| 3348 | 8.51 |
| 3349 | 7.51 |
| 3350 | 6.53 |
| 3351 | 5.55 |
| 3352 | 4.57 |
| 3353 | 3.59 |
| 3354 | 2.61 |
| 3355 | 1.63 |
| 3356 | 0.65 |
| 3357 | 2.63 |
| 3358 | 1.63 |
| 3359 | 3.73 |
| 3360 | 2.73 |
| 3361 | 4.63 |
| 3362 | 3.65 |
| 3363 | 2.67 |
| 3364 | 1.69 |
| 3365 | 2.64 |
| 3366 | 5.24 |
| 3367 | 6.26 |
| 3368 | 8.56 |
| 3369 | 7.58 |
| 3370 | 6.6 |
| 3371 | 8.24 |
| 3372 | 10.44 |
| 3373 | 9.46 |
| 3374 | 8.48 |
| 3375 | 10.44 |
| 3376 | 9.46 |
| 3377 | 8.48 |
| 3378 | 7.5 |
| 3379 | 6.52 |
| 3380 | 5.54 |
| 3381 | 4.56 |
| 3382 | 3.58 |
| 3383 | 4.92 |
| 3384 | 3.92 |
| 3385 | 4.84 |
| 3386 | 7.64 |
| 3387 | 6.66 |
| 3388 | 5.66 |
| 3389 | 7.5 |
| 3390 | 6.5 |
| 3391 | 8.6 |
| 3392 | 10 |
| 3393 | 9 |
| 3394 | 10 |
| 3395 | 9.02 |
| 3396 | 8.04 |
| 3397 | 8.88 |
| 3398 | 10.88 |
| 3399 | 11.84 |
| 3400 | 10.84 |
| 3401 | 9.86 |
| 3402 | 8.88 |
| 3403 | 7.9 |
| 3404 | 6.92 |
| 3405 | 8.56 |
| 3406 | 10.56 |
| 3407 | 9.58 |
| 3408 | 8.6 |
| 3409 | 7.62 |
| 3410 | 8.84 |
| 3411 | 7.84 |
| 3412 | 10.49 |
| 3413 | 9.49 |
| 3414 | 11.79 |
| 3415 | 13.29 |
| 3416 | 15.89 |
| 3417 | 14.893 |
| 3418 | 16.297 |
| 3419 | 15.3 |
| 3420 | 14.3 |
| 3421 | 16.3 |
| 3422 | 15.3 |
| 3423 | 17 |
| 3424 | 19.65 |
| 3425 | 18.67 |
| 3426 | 17.69 |
| 3427 | 16.71 |
| 3428 | 15.73 |
| 3429 | 14.75 |
| 3430 | 13.75 |
| 3431 | 15.23 |
| 3432 | 17.68 |
| 3433 | 20.48 |
| 3434 | 19.48 |
| 3435 | 21.28 |
| 3436 | 23.2 |
| 3437 | 23.925 |
| 3438 | 22.93 |
| 3439 | 21.95 |
| 3440 | 20.97 |
| 3441 | 19.99 |
| 3442 | 18.99 |
| 3443 | 20.61 |
| 3444 | 21.63 |
| 3445 | 22.77 |
| 3446 | 21.77 |
| 3447 | 23.77 |
| 3448 | 22.79 |
| 3449 | 21.81 |
| 3450 | 20.83 |
| 3451 | 19.85 |
| 3452 | 18.87 |
| 3453 | 17.873 |
| 3454 | 19.197 |
| 3455 | 18.2 |
| 3456 | 17.22 |
| 3457 | 18.07 |
| 3458 | 19.57 |
| 3459 | 18.57 |
| 3460 | 21.32 |
| 3461 | 22.13 |
| 3462 | 22.705 |
| 3463 | 21.71 |
| 3464 | 20.73 |
| 3465 | 19.75 |
| 3466 | 18.77 |
| 3467 | 17.77 |
| 3468 | 19.77 |
| 3469 | 18.79 |
| 3470 | 19.93 |
| 3471 | 21.39 |
| 3472 | 20.41 |
| 3473 | 19.43 |
| 3474 | 21.48 |
| 3475 | 20.48 |
| 3476 | 19.48 |
| 3477 | 21.14 |
| 3478 | 22.3 |
| 3479 | 21.3 |
| 3480 | 23.65 |
| 3481 | 22.65 |
| 3482 | 21.67 |
| 3483 | 20.69 |
| 3484 | 19.71 |
| 3485 | 18.73 |
| 3486 | 20.03 |
| 3487 | 19.03 |
| 3488 | 20.93 |
| 3489 | 19.93 |
| 3490 | 18.93 |
| 3491 | 17.95 |
| 3492 | 16.97 |
| 3493 | 15.99 |
| 3494 | 15.01 |
| 3495 | 14.03 |
| 3496 | 13.05 |
| 3497 | 12.07 |
| 3498 | 13.25 |
| 3499 | 12.25 |
| 3500 | 14.95 |
| 3501 | 13.95 |
| 3502 | 12.97 |
| 3503 | 11.99 |
| 3504 | 11.01 |
| 3505 | 12.41 |
| 3506 | 15.06 |
| 3507 | 15.96 |
| 3508 | 16.87 |
| 3509 | 19.32 |
| 3510 | 21.87 |
| 3511 | 24.57 |
| 3512 | 23.57 |
| 3513 | 22.59 |
| 3514 | 24.15 |
| 3515 | 23.15 |
| 3516 | 22.15 |
| 3517 | 24.4 |
| 3518 | 23.4 |
| 3519 | 25.8 |
| 3520 | 24.8 |
| 3521 | 27.6 |
| 3522 | 26.6 |
| 3523 | 28.38 |
| 3524 | 27.4 |
| 3525 | 26.4 |
| 3526 | 27.38 |
| 3527 | 29.63 |
| 3528 | 28.63 |
| 3529 | 29.85 |
| 3530 | 31.47 |
| 3531 | 33.23 |
| 3532 | 35.73 |
| 3533 | 34.75 |
| 3534 | 36.35 |
| 3535 | 35.37 |
| 3536 | 34.39 |
| 3537 | 33.41 |
| 3538 | 32.43 |
| 3539 | 33.65 |
| 3540 | 32.65 |
| 3541 | 34.7 |
| 3542 | 33.7 |
| 3543 | 32.72 |
| 3544 | 31.74 |
| 3545 | 30.76 |
| 3546 | 29.78 |
| 3547 | 28.8 |
| 3548 | 27.8 |
| 3549 | 29.85 |
| 3550 | 32.45 |
| 3551 | 31.47 |
| 3552 | 32.877 |
| 3553 | 31.885 |
| 3554 | 30.892 |
| 3555 | 29.9 |
| 3556 | 28.92 |
| 3557 | 27.94 |
| 3558 | 26.96 |
| 3559 | 25.98 |
| 3560 | 27.62 |
| 3561 | 26.62 |
| 3562 | 25.64 |
| 3563 | 24.66 |
| 3564 | 23.66 |
| 3565 | 26.56 |
| 3566 | 28.16 |
| 3567 | 27.16 |
| 3568 | 26.16 |
| 3569 | 28.1 |
| 3570 | 27.12 |
| 3571 | 26.12 |
| 3572 | 28.1 |
| 3573 | 27.1 |
| 3574 | 28.22 |
| 3575 | 29.4 |
| 3576 | 30.25 |
| 3577 | 29.25 |
| 3578 | 28.27 |
| 3579 | 27.29 |
| 3580 | 26.31 |
| 3581 | 28.21 |
| 3582 | 29.53 |
| 3583 | 28.53 |
| 3584 | 30.07 |
| 3585 | 29.07 |
| 3586 | 28.07 |
| 3587 | 30.07 |
| 3588 | 32.77 |
| 3589 | 31.77 |
| 3590 | 34.22 |
| 3591 | 33.227 |
| 3592 | 34.453 |
| 3593 | 33.46 |
| 3594 | 32.48 |
| 3595 | 31.5 |
| 3596 | 30.52 |
| 3597 | 33.42 |
| 3598 | 34.62 |
| 3599 | 35.82 |
| 3600 | 34.82 |
| 3601 | 33.82 |
| 3602 | 35.64 |
| 3603 | 34.64 |
| 3604 | 37.14 |
| 3605 | 36.14 |
| 3606 | 37.9 |
| 3607 | 36.9 |
| 3608 | 35.9 |
| 3609 | 38.3 |
| 3610 | 37.3 |
| 3611 | 36.31 |
| 3612 | 35.33 |
| 3613 | 34.33 |
| 3614 | 36.19 |
| 3615 | 35.19 |
| 3616 | 34.21 |
| 3617 | 35.23 |
| 3618 | 34.23 |
| 3619 | 35.81 |
| 3620 | 34.81 |
| 3621 | 36.43 |
| 3622 | 38.29 |
| 3623 | 37.31 |
| 3624 | 36.31 |
| 3625 | 37.81 |
| 3626 | 36.83 |
| 3627 | 35.85 |
| 3628 | 34.87 |
| 3629 | 33.89 |
| 3630 | 36.29 |
| 3631 | 38.15 |
| 3632 | 37.15 |
| 3633 | 36.15 |
| 3634 | 38.5 |
| 3635 | 37.5 |
| 3636 | 39.06 |
| 3637 | 38.06 |
| 3638 | 37.08 |
| 3639 | 36.1 |
| 3640 | 35.12 |
| 3641 | 34.14 |
| 3642 | 35.663 |
| 3643 | 34.667 |
| 3644 | 33.67 |
| 3645 | 32.69 |
| 3646 | 31.71 |
| 3647 | 30.71 |
| 3648 | 31.87 |
| 3649 | 33.25 |
| 3650 | 32.27 |
| 3651 | 31.29 |
| 3652 | 30.31 |
| 3653 | 29.33 |
| 3654 | 28.33 |
| 3655 | 30.13 |
| 3656 | 29.15 |
| 3657 | 28.17 |
| 3658 | 29.813 |
| 3659 | 28.817 |
| 3660 | 27.82 |
| 3661 | 26.823 |
| 3662 | 28.427 |
| 3663 | 27.43 |
| 3664 | 26.45 |
| 3665 | 25.47 |
| 3666 | 24.49 |
| 3667 | 23.492 |
| 3668 | 22.495 |
| 3669 | 21.497 |
| 3670 | 23.95 |
| 3671 | 22.955 |
| 3672 | 24.94 |
| 3673 | 23.945 |
| 3674 | 22.95 |
| 3675 | 21.97 |
| 3676 | 20.99 |
| 3677 | 20.01 |
| 3678 | 19.01 |
| 3679 | 21.26 |
| 3680 | 20.26 |
| 3681 | 19.28 |
| 3682 | 21.48 |
| 3683 | 20.48 |
| 3684 | 19.48 |
| 3685 | 20.96 |
| 3686 | 19.96 |
| 3687 | 22.21 |
| 3688 | 21.21 |
| 3689 | 20.23 |
| 3690 | 19.25 |
| 3691 | 18.27 |
| 3692 | 17.27 |
| 3693 | 19.13 |
| 3694 | 21.28 |
| 3695 | 20.28 |
| 3696 | 21.42 |
| 3697 | 20.42 |
| 3698 | 19.44 |
| 3699 | 18.46 |
| 3700 | 17.48 |
| 3701 | 16.5 |
| 3702 | 17.48 |
| 3703 | 16.48 |
| 3704 | 15.48 |
| 3705 | 17.63 |
| 3706 | 19.63 |
| 3707 | 18.63 |
| 3708 | 17.63 |
| 3709 | 19.49 |
| 3710 | 18.51 |
| 3711 | 20.96 |
| 3712 | 23.61 |
| 3713 | 22.61 |
| 3714 | 24.61 |
| 3715 | 26.71 |
| 3716 | 28.91 |
| 3717 | 27.91 |
| 3718 | 26.93 |
| 3719 | 28.73 |
| 3720 | 27.73 |
| 3721 | 30.28 |
| 3722 | 31.4 |
| 3723 | 30.4 |
| 3724 | 29.42 |
| 3725 | 30.58 |
| 3726 | 29.58 |
| 3727 | 28.6 |
| 3728 | 27.6 |
| 3729 | 26.6 |
| 3730 | 29.45 |
| 3731 | 28.47 |
| 3732 | 27.49 |
| 3733 | 26.51 |
| 3734 | 25.53 |
| 3735 | 24.55 |
| 3736 | 23.57 |
| 3737 | 25.575 |
| 3738 | 24.58 |
| 3739 | 23.585 |
| 3740 | 22.59 |
| 3741 | 21.61 |
| 3742 | 20.63 |
| 3743 | 19.65 |
| 3744 | 18.67 |
| 3745 | 17.69 |
| 3746 | 16.71 |
| 3747 | 15.73 |
| 3748 | 14.75 |
| 3749 | 13.77 |
| 3750 | 12.79 |
| 3751 | 14.25 |
| 3752 | 13.25 |
| 3753 | 12.258 |
| 3754 | 14.146 |
| 3755 | 13.154 |
| 3756 | 12.162 |
| 3757 | 11.17 |
| 3758 | 12.75 |
| 3759 | 11.75 |
| 3760 | 14.7 |
| 3761 | 13.72 |
| 3762 | 12.74 |
| 3763 | 11.76 |
| 3764 | 10.78 |
| 3765 | 9.8 |
| 3766 | 10.38 |
| 3767 | 9.4 |
| 3768 | 8.42 |
| 3769 | 7.44 |
| 3770 | 6.44 |
| 3771 | 9.09 |
| 3772 | 8.11 |
| 3773 | 7.13 |
| 3774 | 6.15 |
| 3775 | 5.17 |
| 3776 | 4.19 |
| 3777 | 3.19 |
| 3778 | 2.19 |
| 3779 | 4.99 |
| 3780 | 7.29 |
| 3781 | 6.31 |
| 3782 | 5.33 |
| 3783 | 4.33 |
| 3784 | 6.53 |
| 3785 | 5.53 |
| 3786 | 7.63 |
| 3787 | 6.65 |
| 3788 | 5.67 |
| 3789 | 4.69 |
| 3790 | 3.71 |
| 3791 | 2.73 |
| 3792 | 1.75 |
| 3793 | 0.77 |
| 3794 | 0 |
| 3795 | 0 |
| 3796 | 0 |
| 3797 | 1.42 |
| 3798 | 3.2 |
| 3799 | 2.2 |
| 3800 | 1.2 |
| 3801 | 0.2 |
| 3802 | 2.8 |
| 3803 | 1.8 |
| 3804 | 4.5 |
| 3805 | 3.52 |
| 3806 | 2.54 |
| 3807 | 1.56 |
| 3808 | 0.58 |
| 3809 | 0 |
| 3810 | 0 |
| 3811 | 1.2 |
| 3812 | 0.22 |
| 3813 | 0 |
| 3814 | 2.3 |
| 3815 | 1.32 |
| 3816 | 0.34 |
| 3817 | 0 |
| 3818 | 0 |
| 3819 | 0.97 |
| 3820 | 0 |
| 3821 | 2.4 |
| 3822 | 3.94 |
| 3823 | 2.96 |
| 3824 | 1.98 |
| 3825 | 3.303 |
| 3826 | 2.307 |
| 3827 | 1.31 |
| 3828 | 3.25 |
| 3829 | 2.25 |
| 3830 | 4.5 |
| 3831 | 6.16 |
| 3832 | 5.16 |
| 3833 | 7.36 |
| 3834 | 6.36 |
| 3835 | 7.4 |
| 3836 | 6.4 |
| 3837 | 8.12 |
| 3838 | 7.12 |
| 3839 | 9.47 |
| 3840 | 8.49 |
| 3841 | 7.51 |
| 3842 | 6.53 |
| 3843 | 5.55 |
| 3844 | 7.75 |
| 3845 | 6.77 |
| 3846 | 5.79 |
| 3847 | 4.81 |
| 3848 | 6.13 |
| 3849 | 8.23 |
| 3850 | 7.25 |
| 3851 | 7.935 |
| 3852 | 6.94 |
| 3853 | 9.04 |
| 3854 | 8.04 |
| 3855 | 9.66 |
| 3856 | 11.02 |
| 3857 | 10.02 |
| 3858 | 11.84 |
| 3859 | 10.84 |
| 3860 | 9.86 |
| 3861 | 8.88 |
| 3862 | 10.22 |
| 3863 | 11.7 |
| 3864 | 14.2 |
| 3865 | 16.6 |
| 3866 | 15.62 |
| 3867 | 14.64 |
| 3868 | 16.2 |
| 3869 | 15.2 |
| 3870 | 14.22 |
| 3871 | 13.24 |
| 3872 | 12.26 |
| 3873 | 11.26 |
| 3874 | 13.31 |
| 3875 | 14.993 |
| 3876 | 13.997 |
| 3877 | 13 |
| 3878 | 12 |
| 3879 | 13.82 |
| 3880 | 12.82 |
| 3881 | 15.37 |
| 3882 | 14.39 |
| 3883 | 13.41 |
| 3884 | 12.41 |
| 3885 | 14.27 |
| 3886 | 13.29 |
| 3887 | 12.31 |
| 3888 | 11.33 |
| 3889 | 10.35 |
| 3890 | 9.37 |
| 3891 | 10.71 |
| 3892 | 9.71 |
| 3893 | 11.27 |
| 3894 | 10.27 |
| 3895 | 13.07 |
| 3896 | 14.02 |
| 3897 | 13.04 |
| 3898 | 12.06 |
| 3899 | 11.08 |
| 3900 | 10.08 |
| 3901 | 12.93 |
| 3902 | 14.01 |
| 3903 | 13.03 |
| 3904 | 14.89 |
| 3905 | 13.89 |
| 3906 | 12.89 |
| 3907 | 11.91 |
| 3908 | 10.91 |
| 3909 | 13.16 |
| 3910 | 12.18 |
| 3911 | 11.2 |
| 3912 | 10.22 |
| 3913 | 12.87 |
| 3914 | 11.87 |
| 3915 | 14.62 |
| 3916 | 13.62 |
| 3917 | 12.62 |
| 3918 | 14.77 |
| 3919 | 13.77 |
| 3920 | 12.77 |
| 3921 | 15.02 |
| 3922 | 16.02 |
| 3923 | 17.06 |
| 3924 | 16.06 |
| 3925 | 17.6 |
| 3926 | 19.75 |
| 3927 | 18.77 |
| 3928 | 17.79 |
| 3929 | 20.14 |
| 3930 | 21.08 |
| 3931 | 20.08 |
| 3932 | 19.1 |
| 3933 | 18.1 |
| 3934 | 20.65 |
| 3935 | 19.65 |
| 3936 | 21.8 |
| 3937 | 20.8 |
| 3938 | 21.27 |
| 3939 | 22.19 |
| 3940 | 23.19 |
| 3941 | 22.19 |
| 3942 | 24.54 |
| 3943 | 26.08 |
| 3944 | 25.1 |
| 3945 | 24.12 |
| 3946 | 23.14 |
| 3947 | 22.14 |
| 3948 | 24.34 |
| 3949 | 23.36 |
| 3950 | 22.38 |
| 3951 | 21.4 |
| 3952 | 20.42 |
| 3953 | 19.44 |
| 3954 | 20.447 |
| 3955 | 19.453 |
| 3956 | 18.46 |
| 3957 | 19.09 |
| 3958 | 20.45 |
| 3959 | 20.98 |
| 3960 | 19.98 |
| 3961 | 21.84 |
| 3962 | 23.12 |
| 3963 | 25.04 |
| 3964 | 24.04 |
| 3965 | 25.84 |
| 3966 | 26.335 |
| 3967 | 25.34 |
| 3968 | 24.36 |
| 3969 | 23.38 |
| 3970 | 22.4 |
| 3971 | 21.42 |
| 3972 | 20.423 |
| 3973 | 19.427 |
| 3974 | 20.83 |
| 3975 | 22.59 |
| 3976 | 24.03 |
| 3977 | 23.05 |
| 3978 | 22.07 |
| 3979 | 21.09 |
| 3980 | 20.09 |
| 3981 | 21.93 |
| 3982 | 20.93 |
| 3983 | 19.93 |
| 3984 | 21.61 |
| 3985 | 22.61 |
| 3986 | 24.49 |
| 3987 | 25.407 |
| 3988 | 24.413 |
| 3989 | 23.42 |
| 3990 | 25.2 |
| 3991 | 24.22 |
| 3992 | 23.24 |
| 3993 | 24.74 |
| 3994 | 26.26 |
| 3995 | 25.28 |
| 3996 | 24.3 |
| 3997 | 23.32 |
| 3998 | 22.34 |
| 3999 | 21.36 |
| 4000 | 20.38 |
| 4001 | 19.4 |
| 4002 | 19.945 |
| 4003 | 18.95 |
| 4004 | 17.97 |
| 4005 | 16.99 |
| 4006 | 16.01 |
| 4007 | 15.03 |
| 4008 | 14.05 |
| 4009 | 13.07 |
| 4010 | 14.97 |
| 4011 | 13.97 |
| 4012 | 14.84 |
| 4013 | 13.84 |
| 4014 | 12.84 |
| 4015 | 15.04 |
| 4016 | 14.06 |
| 4017 | 13.08 |
| 4018 | 13.88 |
| 4019 | 14.525 |
| 4020 | 13.53 |
| 4021 | 12.55 |
| 4022 | 14.15 |
| 4023 | 16.8 |
| 4024 | 18.06 |
| 4025 | 19.58 |
| 4026 | 20.82 |
| 4027 | 19.82 |
| 4028 | 18.84 |
| 4029 | 19.44 |
| 4030 | 18.46 |
| 4031 | 17.48 |
| 4032 | 16.5 |
| 4033 | 15.52 |
| 4034 | 16.35 |
| 4035 | 17.47 |
| 4036 | 16.49 |
| 4037 | 17.135 |
| 4038 | 16.14 |
| 4039 | 15.16 |
| 4040 | 14.18 |
| 4041 | 15.62 |
| 4042 | 18.42 |
| 4043 | 17.42 |
| 4044 | 16.42 |
| 4045 | 18.72 |
| 4046 | 17.72 |
| 4047 | 16.74 |
| 4048 | 15.76 |
| 4049 | 14.78 |
| 4050 | 13.8 |
| 4051 | 12.82 |
| 4052 | 11.84 |
| 4053 | 10.86 |
| 4054 | 9.88 |
| 4055 | 8.9 |
| 4056 | 10.22 |
| 4057 | 9.22 |
| 4058 | 11.82 |
| 4059 | 13.38 |
| 4060 | 12.4 |
| 4061 | 11.42 |
| 4062 | 10.44 |
| 4063 | 11.76 |
| 4064 | 10.76 |
| 4065 | 12.91 |
| 4066 | 11.93 |
| 4067 | 10.93 |
| 4068 | 13.18 |
| 4069 | 12.18 |
| 4070 | 11.18 |
| 4071 | 13.98 |
| 4072 | 13 |
| 4073 | 14.62 |
| 4074 | 16.06 |
| 4075 | 15.06 |
| 4076 | 15.93 |
| 4077 | 17.33 |
| 4078 | 19.38 |
| 4079 | 18.4 |
| 4080 | 17.42 |
| 4081 | 16.44 |
| 4082 | 17.41 |
| 4083 | 18.45 |
| 4084 | 17.45 |
| 4085 | 19.55 |
| 4086 | 18.55 |
| 4087 | 18.89 |
| 4088 | 19.62 |
| 4089 | 20.14 |
| 4090 | 21.94 |
| 4091 | 20.96 |
| 4092 | 22.54 |
| 4093 | 21.54 |
| 4094 | 24.34 |
| 4095 | 23.36 |
| 4096 | 22.36 |
| 4097 | 24.41 |
| 4098 | 23.41 |
| 4099 | 22.43 |
| 4100 | 24.33 |
| 4101 | 26.53 |
| 4102 | 27.71 |
| 4103 | 26.71 |
| 4104 | 25.73 |
| 4105 | 24.75 |
| 4106 | 23.77 |
| 4107 | 22.79 |
| 4108 | 21.81 |
| 4109 | 20.83 |
| 4110 | 19.83 |
| 4111 | 21.47 |
| 4112 | 20.48 |
| 4113 | 22.48 |
| 4114 | 21.48 |
| 4115 | 20.5 |
| 4116 | 19.52 |
| 4117 | 18.54 |
| 4118 | 17.56 |
| 4119 | 16.56 |
| 4120 | 19.46 |
| 4121 | 18.46 |
| 4122 | 21.36 |
| 4123 | 22.72 |
| 4124 | 21.74 |
| 4125 | 22.72 |
| 4126 | 21.74 |
| 4127 | 22.395 |
| 4128 | 21.4 |
| 4129 | 20.4 |
| 4130 | 22.6 |
| 4131 | 21.62 |
| 4132 | 22.27 |
| 4133 | 23.55 |
| 4134 | 24.97 |
| 4135 | 25.99 |
| 4136 | 26.44 |
| 4137 | 28.183 |
| 4138 | 27.187 |
| 4139 | 26.19 |
| 4140 | 27.69 |
| 4141 | 26.69 |
| 4142 | 25.69 |
| 4143 | 27.01 |
| 4144 | 26.03 |
| 4145 | 25.05 |
| 4146 | 24.07 |
| 4147 | 23.09 |
| 4148 | 24.75 |
| 4149 | 23.753 |
| 4150 | 22.757 |
| 4151 | 24.02 |
| 4152 | 23.04 |
| 4153 | 24.6 |
| 4154 | 26.36 |
| 4155 | 25.36 |
| 4156 | 24.36 |
| 4157 | 25.74 |
| 4158 | 24.76 |
| 4159 | 23.78 |
| 4160 | 24.505 |
| 4161 | 23.51 |
| 4162 | 22.53 |
| 4163 | 21.55 |
| 4164 | 20.57 |
| 4165 | 19.59 |
| 4166 | 18.61 |
| 4167 | 20.66 |
| 4168 | 23.61 |
| 4169 | 22.63 |
| 4170 | 21.65 |
| 4171 | 20.67 |
| 4172 | 19.69 |
| 4173 | 18.71 |
| 4174 | 17.73 |
| 4175 | 19.37 |
| 4176 | 18.39 |
| 4177 | 17.39 |
| 4178 | 19.84 |
| 4179 | 18.86 |
| 4180 | 20.6 |
| 4181 | 23.2 |
| 4182 | 22.22 |
| 4183 | 24.67 |
| 4184 | 23.67 |
| 4185 | 22.69 |
| 4186 | 21.71 |
| 4187 | 20.73 |
| 4188 | 23.43 |
| 4189 | 22.45 |
| 4190 | 21.47 |
| 4191 | 22.59 |
| 4192 | 21.593 |
| 4193 | 23.177 |
| 4194 | 22.18 |
| 4195 | 21.18 |
| 4196 | 23.12 |
| 4197 | 24.24 |
| 4198 | 23.24 |
| 4199 | 25.16 |
| 4200 | 24.18 |
| 4201 | 23.2 |
| 4202 | 24.187 |
| 4203 | 23.193 |
| 4204 | 22.2 |
| 4205 | 21.22 |
| 4206 | 20.22 |
| 4207 | 23.92 |
| 4208 | 22.92 |
| 4209 | 21.92 |
| 4210 | 26.62 |
| 4211 | 25.62 |
| 4212 | 27.16 |
| 4213 | 26.18 |
| 4214 | 25.2 |
| 4215 | 25.68 |
| 4216 | 24.69 |
| 4217 | 23.7 |
| 4218 | 25.003 |
| 4219 | 24.007 |
| 4220 | 23.01 |
| 4221 | 22.01 |
| 4222 | 23.03 |
| 4223 | 23.82 |
| 4224 | 25.66 |
| 4225 | 24.68 |
| 4226 | 23.7 |
| 4227 | 22.72 |
| 4228 | 21.74 |
| 4229 | 22.53 |
| 4230 | 23.49 |
| 4231 | 22.51 |
| 4232 | 21.53 |
| 4233 | 20.55 |
| 4234 | 19.57 |
| 4235 | 20.35 |
| 4236 | 22.09 |
| 4237 | 21.09 |
| 4238 | 21.887 |
| 4239 | 20.893 |
| 4240 | 19.9 |
| 4241 | 21.9 |
| 4242 | 20.9 |
| 4243 | 19.9 |
| 4244 | 20.635 |
| 4245 | 19.64 |
| 4246 | 18.66 |
| 4247 | 17.68 |
| 4248 | 16.7 |
| 4249 | 15.72 |
| 4250 | 17.87 |
| 4251 | 16.87 |
| 4252 | 15.87 |
| 4253 | 17.09 |
| 4254 | 16.11 |
| 4255 | 17.04 |
| 4256 | 18.14 |
| 4257 | 17.14 |
| 4258 | 19.14 |
| 4259 | 20.14 |
| 4260 | 19.16 |
| 4261 | 18.18 |
| 4262 | 20.02 |
| 4263 | 19.02 |
| 4264 | 20.42 |
| 4265 | 21.66 |
| 4266 | 20.66 |
| 4267 | 24.76 |
| 4268 | 26.46 |
| 4269 | 28.76 |
| 4270 | 27.76 |
| 4271 | 26.78 |
| 4272 | 25.8 |
| 4273 | 24.82 |
| 4274 | 23.82 |
| 4275 | 22.82 |
| 4276 | 21.82 |
| 4277 | 27.42 |
| 4278 | 28.16 |
| 4279 | 27.16 |
| 4280 | 29.21 |
| 4281 | 30.15 |
| 4282 | 29.15 |
| 4283 | 31.155 |
| 4284 | 30.16 |
| 4285 | 29.165 |
| 4286 | 28.17 |
| 4287 | 29.913 |
| 4288 | 28.917 |
| 4289 | 27.92 |
| 4290 | 26.923 |
| 4291 | 28.647 |
| 4292 | 27.65 |
| 4293 | 29.755 |
| 4294 | 28.76 |
| 4295 | 27.765 |
| 4296 | 26.77 |
| 4297 | 28.51 |
| 4298 | 27.51 |
| 4299 | 28.42 |
| 4300 | 27.42 |
| 4301 | 31.42 |
| 4302 | 30.44 |
| 4303 | 29.46 |
| 4304 | 30.92 |
| 4305 | 29.92 |
| 4306 | 31.9 |
| 4307 | 30.907 |
| 4308 | 32.535 |
| 4309 | 31.542 |
| 4310 | 30.55 |
| 4311 | 32.19 |
| 4312 | 31.19 |
| 4313 | 30.21 |
| 4314 | 29.23 |
| 4315 | 28.25 |
| 4316 | 27.25 |
| 4317 | 29.45 |
| 4318 | 28.45 |
| 4319 | 30.55 |
| 4320 | 29.55 |
| 4321 | 28.55 |
| 4322 | 27.55 |
| 4323 | 29.07 |
| 4324 | 31.87 |
| 4325 | 33.07 |
| 4326 | 32.07 |
| 4327 | 31.07 |
| 4328 | 30.07 |
| 4329 | 31.93 |
| 4330 | 30.95 |
| 4331 | 29.97 |
| 4332 | 30.97 |
| 4333 | 29.97 |
| 4334 | 30.61 |
| 4335 | 32.13 |
| 4336 | 31.13 |
| 4337 | 30.13 |
| 4338 | 29.13 |
| 4339 | 31.68 |
| 4340 | 32.5 |
| 4341 | 31.5 |
| 4342 | 30.5 |
| 4343 | 31.35 |
| 4344 | 32.633 |
| 4345 | 31.637 |
| 4346 | 30.64 |
| 4347 | 29.66 |
| 4348 | 28.68 |
| 4349 | 27.7 |
| 4350 | 26.703 |
| 4351 | 28.307 |
| 4352 | 27.31 |
| 4353 | 28.35 |
| 4354 | 27.35 |
| 4355 | 26.35 |
| 4356 | 28.75 |
| 4357 | 27.75 |
| 4358 | 26.77 |
| 4359 | 25.79 |
| 4360 | 27.073 |
| 4361 | 26.077 |
| 4362 | 25.08 |
| 4363 | 26.823 |
| 4364 | 25.827 |
| 4365 | 24.83 |
| 4366 | 23.85 |
| 4367 | 22.87 |
| 4368 | 21.877 |
| 4369 | 23.063 |
| 4370 | 22.07 |
| 4371 | 21.077 |
| 4372 | 21.883 |
| 4373 | 20.89 |
| 4374 | 21.91 |
| 4375 | 23.96 |
| 4376 | 22.963 |
| 4377 | 24.227 |
| 4378 | 23.23 |
| 4379 | 24.777 |
| 4380 | 23.785 |
| 4381 | 22.792 |
| 4382 | 21.8 |
| 4383 | 20.82 |
| 4384 | 19.84 |
| 4385 | 21.563 |
| 4386 | 20.567 |
| 4387 | 19.57 |
| 4388 | 21.29 |
| 4389 | 20.29 |
| 4390 | 19.31 |
| 4391 | 18.33 |
| 4392 | 17.33 |
| 4393 | 19.19 |
| 4394 | 18.19 |
| 4395 | 17.19 |
| 4396 | 19.19 |
| 4397 | 18.21 |
| 4398 | 17.23 |
| 4399 | 16.25 |
| 4400 | 15.27 |
| 4401 | 14.29 |
| 4402 | 13.31 |
| 4403 | 12.33 |
| 4404 | 13.79 |
| 4405 | 16.99 |
| 4406 | 15.99 |
| 4407 | 15.01 |
| 4408 | 14.03 |
| 4409 | 13.03 |
| 4410 | 14.85 |
| 4411 | 13.85 |
| 4412 | 12.853 |
| 4413 | 11.857 |
| 4414 | 13.38 |
| 4415 | 12.4 |
| 4416 | 11.42 |
| 4417 | 14.62 |
| 4418 | 13.62 |
| 4419 | 14.365 |
| 4420 | 13.37 |
| 4421 | 12.37 |
| 4422 | 13.21 |
| 4423 | 15.46 |
| 4424 | 14.46 |
| 4425 | 13.46 |
| 4426 | 16.21 |
| 4427 | 15.21 |
| 4428 | 14.21 |
| 4429 | 15.79 |
| 4430 | 17.53 |
| 4431 | 19.43 |
| 4432 | 18.43 |
| 4433 | 17.43 |
| 4434 | 19.93 |
| 4435 | 18.93 |
| 4436 | 17.95 |
| 4437 | 16.97 |
| 4438 | 15.99 |
| 4439 | 15.01 |
| 4440 | 14.03 |
| 4441 | 13.05 |
| 4442 | 12.07 |
| 4443 | 11.07 |
| 4444 | 12.79 |
| 4445 | 14.84 |
| 4446 | 13.84 |
| 4447 | 16.69 |
| 4448 | 15.69 |
| 4449 | 14.69 |
| 4450 | 13.69 |
| 4451 | 12.69 |
| 4452 | 16.49 |
| 4453 | 15.51 |
| 4454 | 14.53 |
| 4455 | 15.53 |
| 4456 | 14.53 |
| 4457 | 13.53 |
| 4458 | 15.21 |
| 4459 | 14.21 |
| 4460 | 15.83 |
| 4461 | 14.85 |
| 4462 | 13.87 |
| 4463 | 15.71 |
| 4464 | 14.71 |
| 4465 | 13.71 |
| 4466 | 17.11 |
| 4467 | 17.86 |
| 4468 | 16.87 |
| 4469 | 15.88 |
| 4470 | 17.06 |
| 4471 | 18.3 |
| 4472 | 17.3 |
| 4473 | 16.3 |
| 4474 | 15.3 |
| 4475 | 17.4 |
| 4476 | 16.4 |
| 4477 | 17.36 |
| 4478 | 16.37 |
| 4479 | 15.38 |
| 4480 | 14.39 |
| 4481 | 13.39 |
| 4482 | 15.39 |
| 4483 | 14.39 |
| 4484 | 13.41 |
| 4485 | 12.43 |
| 4486 | 14.48 |
| 4487 | 13.48 |
| 4488 | 12.48 |
| 4489 | 13.983 |
| 4490 | 12.987 |
| 4491 | 11.99 |
| 4492 | 10.99 |
| 4493 | 13.84 |
| 4494 | 15.047 |
| 4495 | 14.053 |
| 4496 | 13.06 |
| 4497 | 12.08 |
| 4498 | 11.1 |
| 4499 | 10.12 |
| 4500 | 9.14 |
| 4501 | 8.16 |
| 4502 | 7.167 |
| 4503 | 8.495 |
| 4504 | 7.502 |
| 4505 | 6.51 |
| 4506 | 5.53 |
| 4507 | 4.55 |
| 4508 | 3.57 |
| 4509 | 5.01 |
| 4510 | 4.01 |
| 4511 | 3.03 |
| 4512 | 2.05 |
| 4513 | 1.05 |
| 4514 | 0.05 |
| 4515 | 3 |
| 4516 | 4.303 |
| 4517 | 3.307 |
| 4518 | 2.31 |
| 4519 | 1.31 |
| 4520 | 0.31 |
| 4521 | 0 |
| 4522 | 4.1 |
| 4523 | 3.12 |
| 4524 | 2.14 |
| 4525 | 1.16 |
| 4526 | 0.18 |
| 4527 | 0 |
| 4528 | 1.563 |
| 4529 | 0.567 |
| 4530 | 0 |
| 4531 | 0 |
| 4532 | 0 |
| 4533 | 0 |
| 4534 | 0 |
| 4535 | 1.728 |
| 4536 | 0.735 |
| 4537 | 0 |
| 4538 | 0 |
| 4539 | 0 |
| 4540 | 0 |
| 4541 | 0 |
| 4542 | 2.15 |
| 4543 | 1.15 |
| 4544 | 0.15 |
| 4545 | 0 |
| 4546 | 3 |
| 4547 | 2 |
| 4548 | 1 |
| 4549 | 0 |
| 4550 | 3.8 |
| 4551 | 2.82 |
| 4552 | 1.84 |
| 4553 | 0.86 |
| 4554 | 0 |
| 4555 | 0 |
| 4556 | 2.005 |
| 4557 | 1.01 |
| 4558 | 0.015 |
| 4559 | 0 |
| 4560 | 1.34 |
| 4561 | 2.883 |
| 4562 | 1.887 |
| 4563 | 0.89 |
| 4564 | 2.47 |
| 4565 | 1.47 |
| 4566 | 0.49 |
| 4567 | 0 |
| 4568 | 0 |
| 4569 | 0 |
| 4570 | 0 |
| 4571 | 0 |
| 4572 | 1.28 |
| 4573 | 0.28 |
| 4574 | 1.22 |
| 4575 | 0.22 |
| 4576 | 2.04 |
| 4577 | 1.04 |
| 4578 | 0.04 |
| 4579 | 1.46 |
| 4580 | 0.46 |
| 4581 | 0 |
| 4582 | 2.45 |
| 4583 | 3.25 |
| 4584 | 2.25 |
| 4585 | 3.81 |
| 4586 | 2.81 |
| 4587 | 1.817 |
| 4588 | 0.825 |
| 4589 | 2.092 |
| 4590 | 1.1 |
| 4591 | 1.98 |
| 4592 | 0.98 |
| 4593 | 2.4 |
| 4594 | 1.4 |
| 4595 | 0.42 |
| 4596 | 0 |
| 4597 | 1.58 |
| 4598 | 0.58 |
| 4599 | 2.385 |
| 4600 | 1.39 |
| 4601 | 0.395 |
| 4602 | 0 |
| 4603 | 0 |
| 4604 | 0 |
| 4605 | 0 |
| 4606 | 2.8 |
| 4607 | 4.403 |
| 4608 | 3.407 |
| 4609 | 2.41 |
| 4610 | 1.43 |
| 4611 | 0.45 |
| 4612 | 2.605 |
| 4613 | 1.61 |
| 4614 | 0.615 |
| 4615 | 0 |
| 4616 | 0 |
| 4617 | 0 |
| 4618 | 0 |
| 4619 | 1.82 |
| 4620 | 0.82 |
| 4621 | 0 |
| 4622 | 1.363 |
| 4623 | 0.367 |
| 4624 | 0 |
| 4625 | 0 |
| 4626 | 0 |
| 4627 | 0 |
| 4628 | 1.027 |
| 4629 | 0.033 |
| 4630 | 0 |
| 4631 | 0 |
| 4632 | 1.54 |
| 4633 | 3.79 |
| 4634 | 2.79 |
| 4635 | 1.79 |
| 4636 | 2.79 |
| 4637 | 1.79 |
| 4638 | 0.79 |
| 4639 | 2.09 |
| 4640 | 1.09 |
| 4641 | 0.09 |
| 4642 | 2.79 |
| 4643 | 1.81 |
| 4644 | 0.83 |
| 4645 | 0 |
| 4646 | 0 |
| 4647 | 0.9 |
| 4648 | 0 |
| 4649 | 0 |
| 4650 | 0 |
| 4651 | 1.087 |
| 4652 | 0.093 |
| 4653 | 0 |
| 4654 | 1.46 |
| 4655 | 3.56 |
| 4656 | 2.56 |
| 4657 | 3.4 |
| 4658 | 2.4 |
| 4659 | 1.402 |
| 4660 | 0.405 |
| 4661 | 3.107 |
| 4662 | 2.11 |
| 4663 | 1.13 |
| 4664 | 0.15 |
| 4665 | 2.35 |
| 4666 | 1.35 |
| 4667 | 3.013 |
| 4668 | 2.017 |
| 4669 | 1.02 |
| 4670 | 0.04 |
| 4671 | 0 |
| 4672 | 0 |
| 4673 | 0 |
| 4674 | 0 |
| 4675 | 0 |
| 4676 | 1.78 |
| 4677 | 0.78 |
| 4678 | 0 |
| 4679 | 0 |
| 4680 | 1.9 |
| 4681 | 4.85 |
| 4682 | 3.87 |
| 4683 | 2.89 |
| 4684 | 1.91 |
| 4685 | 0.93 |
| 4686 | 0 |
| 4687 | 1.82 |
| 4688 | 0.82 |
| 4689 | 0 |
| 4690 | 0 |
| 4691 | 0 |
| 4692 | 0 |
| 4693 | 0 |
| 4694 | 0 |
| 4695 | 1.56 |
| 4696 | 0.56 |
| 4697 | 0 |
| 4698 | 0 |
| 4699 | 2.55 |
| 4700 | 1.57 |
| 4701 | 0.59 |
| 4702 | 2.39 |
| 4703 | 1.39 |
| 4704 | 3.113 |
| 4705 | 2.117 |
| 4706 | 1.12 |
| 4707 | 0.14 |
| 4708 | 0 |
| 4709 | 0 |
| 4710 | 0 |
| 4711 | 1.44 |
| 4712 | 0.44 |
| 4713 | 0 |
| 4714 | 1.187 |
| 4715 | 0.193 |
| 4716 | 1.413 |
| 4717 | 0.413 |
| 4718 | 1.193 |
| 4719 | 0.193 |
| 4720 | 2.893 |
| 4721 | 1.913 |
| 4722 | 0.933 |
| 4723 | 0 |
| 4724 | 0 |
| 4725 | 0 |
| 4726 | 0 |
| 4727 | 0 |
| 4728 | 0 |
| 4729 | 0 |
| 4730 | 0 |
| 4731 | 2.35 |
| 4732 | 1.35 |
| 4733 | 2.91 |
| 4734 | 1.91 |
| 4735 | 0.93 |
| 4736 | 0 |
| 4737 | 0 |
| 4738 | 0 |
| 4739 | 4.1 |
| 4740 | 3.12 |
| 4741 | 2.14 |
| 4742 | 1.16 |
| 4743 | 0.18 |
| 4744 | 0.86 |
| 4745 | 0 |
| 4746 | 0 |
| 4747 | 0 |
| 4748 | 2.9 |
| 4749 | 1.9 |
| 4750 | 0.92 |
| 4751 | 0 |
| 4752 | 0 |
| 4753 | 0 |
| 4754 | 0 |
| 4755 | 0 |
| 4756 | 0 |
| 4757 | 2.75 |
| 4758 | 1.75 |
| 4759 | 0.77 |
| 4760 | 0 |
| 4761 | 0 |
| 4762 | 0 |
| 4763 | 0 |
| 4764 | 0.79 |
| 4765 | 1.69 |
| 4766 | 0.69 |
| 4767 | 1.93 |
| 4768 | 0.93 |
| 4769 | 2.15 |
| 4770 | 1.15 |
| 4771 | 4.55 |
| 4772 | 3.57 |
| 4773 | 2.59 |
| 4774 | 1.59 |
| 4775 | 2.63 |
| 4776 | 3.36 |
| 4777 | 2.37 |
| 4778 | 1.38 |
| 4779 | 2.92 |
| 4780 | 1.92 |
| 4781 | 5.62 |
| 4782 | 4.62 |
| 4783 | 3.62 |
| 4784 | 8.52 |
| 4785 | 7.52 |
| 4786 | 10.42 |
| 4787 | 9.42 |
| 4788 | 8.44 |
| 4789 | 7.46 |
| 4790 | 6.463 |
| 4791 | 5.467 |
| 4792 | 6.89 |
| 4793 | 5.89 |
| 4794 | 4.89 |
| 4795 | 6.99 |
| 4796 | 6.01 |
| 4797 | 5.03 |
| 4798 | 6.93 |
| 4799 | 5.93 |
| 4800 | 4.93 |
| 4801 | 3.93 |
| 4802 | 5.75 |
| 4803 | 4.75 |
| 4804 | 6.093 |
| 4805 | 5.097 |
| 4806 | 4.1 |
| 4807 | 3.12 |
| 4808 | 2.14 |
| 4809 | 1.16 |
| 4810 | 0.18 |
| 4811 | 0 |
| 4812 | 3 |
| 4813 | 2 |
| 4814 | 3.3 |
| 4815 | 2.32 |
| 4816 | 1.34 |
| 4817 | 0.34 |
| 4818 | 2.69 |
| 4819 | 1.71 |
| 4820 | 0.73 |
| 4821 | 0 |
| 4822 | 0 |
| 4823 | 0 |
| 4824 | 0 |
| 4825 | 0 |
| 4826 | 0 |
| 4827 | 2.85 |
| 4828 | 1.85 |
| 4829 | 3.47 |
| 4830 | 5.07 |
| 4831 | 4.07 |
| 4832 | 5.33 |
| 4833 | 7.11 |
| 4834 | 9.21 |
| 4835 | 8.21 |
| 4836 | 9.417 |
| 4837 | 8.423 |
| 4838 | 7.43 |
| 4839 | 6.43 |
| 4840 | 9.03 |
| 4841 | 8.05 |
| 4842 | 7.07 |
| 4843 | 10.37 |
| 4844 | 9.37 |
| 4845 | 11.33 |
| 4846 | 10.33 |
| 4847 | 9.33 |
| 4848 | 10.47 |
| 4849 | 14.87 |
| 4850 | 13.87 |
| 4851 | 12.877 |
| 4852 | 14.063 |
| 4853 | 13.07 |
| 4854 | 12.09 |
| 4855 | 11.11 |
| 4856 | 10.13 |
| 4857 | 9.15 |
| 4858 | 8.17 |
| 4859 | 7.19 |
| 4860 | 6.21 |
| 4861 | 5.23 |
| 4862 | 4.25 |
| 4863 | 3.27 |
| 4864 | 2.29 |
| 4865 | 1.31 |
| 4866 | 0.33 |
| 4867 | 0 |
| 4868 | 4 |
| 4869 | 3.02 |
| 4870 | 2.04 |
| 4871 | 1.04 |
| 4872 | 6.04 |
| 4873 | 7.08 |
| 4874 | 6.08 |
| 4875 | 5.1 |
| 4876 | 4.12 |
| 4877 | 4.83 |
| 4878 | 3.83 |
| 4879 | 5.51 |
| 4880 | 4.51 |
| 4881 | 5.51 |
| 4882 | 4.51 |
| 4883 | 3.51 |
| 4884 | 5.61 |
| 4885 | 4.61 |
| 4886 | 3.61 |
| 4887 | 2.61 |
| 4888 | 6.01 |
| 4889 | 5.01 |
| 4890 | 7.31 |
| 4891 | 6.31 |
| 4892 | 7.65 |
| 4893 | 6.65 |
| 4894 | 8.55 |
| 4895 | 7.55 |
| 4896 | 6.55 |
| 4897 | 5.57 |
| 4898 | 4.59 |
| 4899 | 3.61 |
| 4900 | 5.86 |
| 4901 | 4.86 |
| 4902 | 3.86 |
| 4903 | 6.76 |
| 4904 | 5.78 |
| 4905 | 4.8 |
| 4906 | 3.82 |
| 4907 | 2.84 |
| 4908 | 1.86 |
| 4909 | 0.88 |
| 4910 | 0 |
| 4911 | 0 |
| 4912 | 0 |
| 4913 | 0 |
| 4914 | 1.14 |
| 4915 | 2.32 |
| 4916 | 3.6 |
| 4917 | 2.6 |
| 4918 | 1.62 |
| 4919 | 0.64 |
| 4920 | 0 |
| 4921 | 0.7 |
| 4922 | 0 |
| 4923 | 0 |
| 4924 | 1.62 |
| 4925 | 0.62 |
| 4926 | 0 |
| 4927 | 0 |
| 4928 | 1.845 |
| 4929 | 0.85 |
| 4930 | 0 |
| 4931 | 0 |
| 4932 | 1.743 |
| 4933 | 0.747 |
| 4934 | 0 |
| 4935 | 1.06 |
| 4936 | 0.06 |
| 4937 | 1.94 |
| 4938 | 0.94 |
| 4939 | 0 |
| 4940 | 3.1 |
| 4941 | 5.045 |
| 4942 | 4.05 |
| 4943 | 3.055 |
| 4944 | 2.06 |
| 4945 | 3.52 |
| 4946 | 2.52 |
| 4947 | 1.54 |
| 4948 | 0.56 |
| 4949 | 0 |
| 4950 | 0 |
| 4951 | 0 |
| 4952 | 0 |
| 4953 | 0 |
| 4954 | 1.2 |
| 4955 | 0.2 |
| 4956 | 2.3 |
| 4957 | 1.3 |
| 4958 | 0.32 |
| 4959 | 0 |
| 4960 | 0 |
| 4961 | 0 |
| 4962 | 0 |
| 4963 | 3.8 |
| 4964 | 2.82 |
| 4965 | 1.84 |
| 4966 | 0.86 |
| 4967 | 0 |
| 4968 | 0 |
| 4969 | 2.15 |
| 4970 | 1.15 |
| 4971 | 2.95 |
| 4972 | 5.85 |
| 4973 | 4.85 |
| 4974 | 3.87 |
| 4975 | 2.89 |
| 4976 | 1.89 |
| 4977 | 4.14 |
| 4978 | 3.16 |
| 4979 | 2.18 |
| 4980 | 1.2 |
| 4981 | 0.22 |
| 4982 | 0 |
| 4983 | 0 |
| 4984 | 0 |
| 4985 | 0 |
| 4986 | 0 |
| 4987 | 0 |
| 4988 | 0 |
| 4989 | 3.4 |
| 4990 | 5.24 |
| 4991 | 7.44 |
| 4992 | 6.44 |
| 4993 | 5.44 |
| 4994 | 6.88 |
| 4995 | 8.48 |
| 4996 | 7.48 |
| 4997 | 6.48 |
| 4998 | 8.68 |
| 4999 | 7.68 |
| 5000 | 6.685 |
| 5001 | 5.69 |
| 5002 | 7.455 |
| 5003 | 6.46 |
| 5004 | 8.02 |
| 5005 | 9.86 |
| 5006 | 8.86 |
| 5007 | 7.86 |
| 5008 | 9.48 |
| 5009 | 11.26 |
| 5010 | 15.36 |
| 5011 | 14.367 |
| 5012 | 15.675 |
| 5013 | 14.682 |
| 5014 | 13.69 |
| 5015 | 15.29 |
| 5016 | 14.29 |
| 5017 | 13.31 |
| 5018 | 12.33 |
| 5019 | 11.33 |
| 5020 | 14.08 |
| 5021 | 15.86 |
| 5022 | 14.86 |
| 5023 | 13.86 |
| 5024 | 15.34 |
| 5025 | 14.34 |
| 5026 | 16.54 |
| 5027 | 15.54 |
| 5028 | 14.56 |
| 5029 | 13.58 |
| 5030 | 12.6 |
| 5031 | 11.6 |
| 5032 | 13.44 |
| 5033 | 12.46 |
| 5034 | 11.48 |
| 5035 | 10.48 |
| 5036 | 12.36 |
| 5037 | 11.38 |
| 5038 | 10.4 |
| 5039 | 9.4 |
| 5040 | 11 |
| 5041 | 13.9 |
| 5042 | 12.92 |
| 5043 | 11.94 |
| 5044 | 10.94 |
| 5045 | 9.94 |
| 5046 | 13.94 |
| 5047 | 12.94 |
| 5048 | 11.94 |
| 5049 | 16.94 |
| 5050 | 15.96 |
| 5051 | 14.98 |
| 5052 | 14 |
| 5053 | 16.15 |
| 5054 | 15.15 |
| 5055 | 14.15 |
| 5056 | 13.17 |
| 5057 | 12.19 |
| 5058 | 11.21 |
| 5059 | 10.23 |
| 5060 | 9.25 |
| 5061 | 8.27 |
| 5062 | 7.29 |
| 5063 | 6.292 |
| 5064 | 8.695 |
| 5065 | 7.697 |
| 5066 | 6.7 |
| 5067 | 8.003 |
| 5068 | 7.007 |
| 5069 | 6.01 |
| 5070 | 5.03 |
| 5071 | 4.05 |
| 5072 | 3.07 |
| 5073 | 5.32 |
| 5074 | 8.22 |
| 5075 | 7.22 |
| 5076 | 6.24 |
| 5077 | 5.26 |
| 5078 | 4.28 |
| 5079 | 3.3 |
| 5080 | 2.32 |
| 5081 | 3.64 |
| 5082 | 5.16 |
| 5083 | 4.173 |
| 5084 | 3.187 |
| 5085 | 2.192 |
| 5086 | 4.397 |
| 5087 | 3.402 |
| 5088 | 2.407 |
| 5089 | 1.427 |
| 5090 | 0.447 |
| 5091 | 0 |
| 5092 | 0 |
| 5093 | 0 |
| 5094 | 0 |
| 5095 | 0 |
| 5096 | 4.4 |
| 5097 | 3.4 |
| 5098 | 5.4 |
| 5099 | 7.9 |
| 5100 | 6.9 |
| 5101 | 10.2 |
| 5102 | 9.2 |
| 5103 | 8.22 |
| 5104 | 7.24 |
| 5105 | 8.5 |
| 5106 | 10.6 |
| 5107 | 9.6 |
| 5108 | 11.28 |
| 5109 | 10.282 |
| 5110 | 9.285 |
| 5111 | 12.037 |
| 5112 | 11.04 |
| 5113 | 10.06 |
| 5114 | 9.08 |
| 5115 | 8.1 |
| 5116 | 7.107 |
| 5117 | 6.115 |
| 5118 | 7.442 |
| 5119 | 6.45 |
| 5120 | 5.47 |
| 5121 | 4.49 |
| 5122 | 3.51 |
| 5123 | 2.53 |
| 5124 | 3.67 |
| 5125 | 2.67 |
| 5126 | 1.67 |
| 5127 | 4.37 |
| 5128 | 3.39 |
| 5129 | 2.41 |
| 5130 | 1.413 |
| 5131 | 3.097 |
| 5132 | 2.1 |
| 5133 | 1.12 |
| 5134 | 0.14 |
| 5135 | 0 |
| 5136 | 0 |
| 5137 | 0 |
| 5138 | 2.1 |
| 5139 | 1.1 |
| 5140 | 0.12 |
| 5141 | 0 |
| 5142 | 3.5 |
| 5143 | 2.5 |
| 5144 | 1.5 |
| 5145 | 0.5 |
| 5146 | 2.9 |
| 5147 | 1.9 |
| 5148 | 2.76 |
| 5149 | 4.54 |
| 5150 | 3.54 |
| 5151 | 2.54 |
| 5152 | 1.56 |
| 5153 | 0.58 |
| 5154 | 0 |
| 5155 | 1.76 |
| 5156 | 0.76 |
| 5157 | 1.987 |
| 5158 | 0.993 |
| 5159 | 0 |
| 5160 | 0 |
| 5161 | 0 |
| 5162 | 0 |
| 5163 | 0 |
| 5164 | 0 |
| 5165 | 0 |
| 5166 | 0 |
| 5167 | 0 |
| 5168 | 0 |
| 5169 | 4.9 |
| 5170 | 5.7 |
| 5171 | 6.68 |
| 5172 | 8.5 |
| 5173 | 7.5 |
| 5174 | 9.34 |
| 5175 | 8.34 |
| 5176 | 7.34 |
| 5177 | 6.36 |
| 5178 | 5.38 |
| 5179 | 4.38 |
| 5180 | 5.7 |
| 5181 | 7.06 |
| 5182 | 6.06 |
| 5183 | 5.06 |
| 5184 | 7.61 |
| 5185 | 6.61 |
| 5186 | 8.19 |
| 5187 | 9.89 |
| 5188 | 8.89 |
| 5189 | 7.91 |
| 5190 | 6.93 |
| 5191 | 5.93 |
| 5192 | 8.18 |
| 5193 | 7.18 |
| 5194 | 6.2 |
| 5195 | 5.22 |
| 5196 | 6.07 |
| 5197 | 5.07 |
| 5198 | 6.81 |
| 5199 | 5.81 |
| 5200 | 7.35 |
| 5201 | 6.35 |
| 5202 | 5.37 |
| 5203 | 4.39 |
| 5204 | 3.392 |
| 5205 | 4.835 |
| 5206 | 3.837 |
| 5207 | 2.857 |
| 5208 | 1.877 |
| 5209 | 0.877 |
| 5210 | 1.767 |
| 5211 | 0.767 |
| 5212 | 4.167 |
| 5213 | 3.187 |
| 5214 | 2.207 |
| 5215 | 1.207 |
| 5216 | 3.307 |
| 5217 | 2.327 |
| 5218 | 1.347 |
| 5219 | 0.367 |
| 5220 | 1.967 |
| 5221 | 4.367 |
| 5222 | 5.747 |
| 5223 | 4.747 |
| 5224 | 3.754 |
| 5225 | 4.761 |
| 5226 | 3.767 |
| 5227 | 5.307 |
| 5228 | 7.657 |
| 5229 | 6.657 |
| 5230 | 5.677 |
| 5231 | 4.697 |
| 5232 | 3.7 |
| 5233 | 6.152 |
| 5234 | 5.155 |
| 5235 | 4.157 |
| 5236 | 6.407 |
| 5237 | 5.407 |
| 5238 | 8.707 |
| 5239 | 7.712 |
| 5240 | 9.767 |
| 5241 | 8.772 |
| 5242 | 7.777 |
| 5243 | 8.787 |
| 5244 | 7.797 |
| 5245 | 6.807 |
| 5246 | 5.817 |
| 5247 | 4.837 |
| 5248 | 3.857 |
| 5249 | 2.877 |
| 5250 | 1.897 |
| 5251 | 0.897 |
| 5252 | 2.677 |
| 5253 | 3.587 |
| 5254 | 2.587 |
| 5255 | 1.607 |
| 5256 | 0.627 |
| 5257 | 0 |
| 5258 | 0 |
| 5259 | 2.1 |
| 5260 | 4.45 |
| 5261 | 3.45 |
| 5262 | 6.75 |
| 5263 | 5.75 |
| 5264 | 6.77 |
| 5265 | 5.77 |
| 5266 | 6.87 |
| 5267 | 9.72 |
| 5268 | 10.7 |
| 5269 | 9.7 |
| 5270 | 8.72 |
| 5271 | 7.74 |
| 5272 | 6.74 |
| 5273 | 8.68 |
| 5274 | 7.68 |
| 5275 | 9.54 |
| 5276 | 8.54 |
| 5277 | 9.848 |
| 5278 | 8.855 |
| 5279 | 7.863 |
| 5280 | 6.87 |
| 5281 | 8.655 |
| 5282 | 7.66 |
| 5283 | 6.665 |
| 5284 | 5.67 |
| 5285 | 7.138 |
| 5286 | 6.145 |
| 5287 | 5.153 |
| 5288 | 4.16 |
| 5289 | 3.16 |
| 5290 | 4.82 |
| 5291 | 3.82 |
| 5292 | 5.92 |
| 5293 | 4.92 |
| 5294 | 3.93 |
| 5295 | 2.95 |
| 5296 | 1.97 |
| 5297 | 0.99 |
| 5298 | 0.01 |
| 5299 | 1.37 |
| 5300 | 0.37 |
| 5301 | 0 |
| 5302 | 0 |
| 5303 | 0 |
| 5304 | 0 |
| 5305 | 0 |
| 5306 | 0 |
| 5307 | 0 |
| 5308 | 4 |
| 5309 | 5.6 |
| 5310 | 4.6 |
| 5311 | 3.6 |
| 5312 | 5 |
| 5313 | 4 |
| 5314 | 7.5 |
| 5315 | 6.5 |
| 5316 | 8.7 |
| 5317 | 7.7 |
| 5318 | 10.45 |
| 5319 | 11.272 |
| 5320 | 12.175 |
| 5321 | 11.177 |
| 5322 | 10.18 |
| 5323 | 11.8 |
| 5324 | 13.85 |
| 5325 | 12.85 |
| 5326 | 11.85 |
| 5327 | 10.85 |
| 5328 | 14.85 |
| 5329 | 16.55 |
| 5330 | 15.55 |
| 5331 | 14.57 |
| 5332 | 13.59 |
| 5333 | 12.61 |
| 5334 | 11.63 |
| 5335 | 10.65 |
| 5336 | 9.65 |
| 5337 | 12.1 |
| 5338 | 13.483 |
| 5339 | 12.487 |
| 5340 | 11.49 |
| 5341 | 10.51 |
| 5342 | 9.53 |
| 5343 | 8.55 |
| 5344 | 7.57 |
| 5345 | 6.59 |
| 5346 | 5.61 |
| 5347 | 4.63 |
| 5348 | 3.65 |
| 5349 | 2.65 |
| 5350 | 1.65 |
| 5351 | 5.25 |
| 5352 | 6.29 |
| 5353 | 5.29 |
| 5354 | 7.03 |
| 5355 | 9.68 |
| 5356 | 11.283 |
| 5357 | 10.287 |
| 5358 | 9.29 |
| 5359 | 10.47 |
| 5360 | 9.47 |
| 5361 | 11.97 |
| 5362 | 10.97 |
| 5363 | 12.697 |
| 5364 | 11.705 |
| 5365 | 10.712 |
| 5366 | 9.72 |
| 5367 | 8.72 |
| 5368 | 11.42 |
| 5369 | 13.32 |
| 5370 | 12.32 |
| 5371 | 14.62 |
| 5372 | 13.62 |
| 5373 | 12.627 |
| 5374 | 14.035 |
| 5375 | 13.042 |
| 5376 | 12.05 |
| 5377 | 11.05 |
| 5378 | 13.45 |
| 5379 | 15.35 |
| 5380 | 14.35 |
| 5381 | 13.35 |
| 5382 | 12.35 |
| 5383 | 13.53 |
| 5384 | 14.61 |
| 5385 | 15.71 |
| 5386 | 14.71 |
| 5387 | 13.71 |
| 5388 | 12.73 |
| 5389 | 11.75 |
| 5390 | 10.77 |
| 5391 | 9.79 |
| 5392 | 8.81 |
| 5393 | 7.83 |
| 5394 | 6.85 |
| 5395 | 5.87 |
| 5396 | 4.89 |
| 5397 | 3.89 |
| 5398 | 2.89 |
| 5399 | 5.69 |
| 5400 | 4.71 |
| 5401 | 3.73 |
| 5402 | 2.75 |
| 5403 | 1.77 |
| 5404 | 0.79 |
| 5405 | 0 |
| 5406 | 0 |
| 5407 | 0 |
| 5408 | 2.603 |
| 5409 | 1.605 |
| 5410 | 0.608 |
| 5411 | 2.335 |
| 5412 | 1.343 |
| 5413 | 0.35 |
| 5414 | 0 |
| 5415 | 0 |
| 5416 | 1.52 |
| 5417 | 2.947 |
| 5418 | 1.955 |
| 5419 | 0.962 |
| 5420 | 0 |
| 5421 | 1.16 |
| 5422 | 3.81 |
| 5423 | 2.81 |
| 5424 | 4.037 |
| 5425 | 3.043 |
| 5426 | 2.05 |
| 5427 | 1.07 |
| 5428 | 0.09 |
| 5429 | 0 |
| 5430 | 0 |
| 5431 | 0 |
| 5432 | 2.402 |
| 5433 | 1.422 |
| 5434 | 0.442 |
| 5435 | 0 |
| 5436 | 0 |
| 5437 | 0 |
| 5438 | 3 |
| 5439 | 4.263 |
| 5440 | 3.267 |
| 5441 | 2.27 |
| 5442 | 1.28 |
| 5443 | 2.43 |
| 5444 | 1.44 |
| 5445 | 0.45 |
| 5446 | 0 |
| 5447 | 2.155 |
| 5448 | 1.16 |
| 5449 | 0.165 |
| 5450 | 2.165 |
| 5451 | 1.165 |
| 5452 | 0.165 |
| 5453 | 0 |
| 5454 | 1.46 |
| 5455 | 0.48 |
| 5456 | 0 |
| 5457 | 0 |
| 5458 | 0 |
| 5459 | 0 |
| 5460 | 0 |
| 5461 | 0 |
| 5462 | 0 |
| 5463 | 0 |
| 5464 | 0 |
| 5465 | 1.488 |
| 5466 | 0.495 |
| 5467 | 0 |
| 5468 | 0 |
| 5469 | 1.24 |
| 5470 | 0.24 |
| 5471 | 0 |
| 5472 | 2.9 |
| 5473 | 1.9 |
| 5474 | 3.14 |
| 5475 | 4.6 |
| 5476 | 3.6 |
| 5477 | 2.6 |
| 5478 | 5.35 |
| 5479 | 4.35 |
| 5480 | 6.01 |
| 5481 | 7.91 |
| 5482 | 6.91 |
| 5483 | 5.91 |
| 5484 | 9.51 |
| 5485 | 8.51 |
| 5486 | 7.53 |
| 5487 | 6.55 |
| 5488 | 5.57 |
| 5489 | 4.59 |
| 5490 | 3.61 |
| 5491 | 2.63 |
| 5492 | 1.65 |
| 5493 | 3.173 |
| 5494 | 2.177 |
| 5495 | 1.18 |
| 5496 | 0.18 |
| 5497 | 0 |
| 5498 | 3 |
| 5499 | 5.95 |
| 5500 | 4.95 |
| 5501 | 3.95 |
| 5502 | 2.95 |
| 5503 | 4.353 |
| 5504 | 3.357 |
| 5505 | 2.36 |
| 5506 | 3.8 |
| 5507 | 2.8 |
| 5508 | 1.803 |
| 5509 | 3.547 |
| 5510 | 2.55 |
| 5511 | 1.55 |
| 5512 | 3.05 |
| 5513 | 2.05 |
| 5514 | 5 |
| 5515 | 6.88 |
| 5516 | 8.88 |
| 5517 | 7.88 |
| 5518 | 6.885 |
| 5519 | 8.89 |
| 5520 | 7.895 |
| 5521 | 6.9 |
| 5522 | 5.92 |
| 5523 | 4.94 |
| 5524 | 3.96 |
| 5525 | 2.98 |
| 5526 | 2 |
| 5527 | 1 |
| 5528 | 0 |
| 5529 | 2.5 |
| 5530 | 3.67 |
| 5531 | 2.68 |
| 5532 | 1.69 |
| 5533 | 0.7 |
| 5534 | 0 |
| 5535 | 0 |
| 5536 | 0 |
| 5537 | 0 |
| 5538 | 0 |
| 5539 | 0 |
| 5540 | 0 |
| 5541 | 1.42 |
| 5542 | 0.42 |
| 5543 | 0 |
| 5544 | 4.1 |
| 5545 | 5.26 |
| 5546 | 4.26 |
| 5547 | 3.26 |
| 5548 | 2.26 |
| 5549 | 4.51 |
| 5550 | 3.51 |
| 5551 | 2.51 |
| 5552 | 6.11 |
| 5553 | 5.11 |
| 5554 | 4.13 |
| 5555 | 3.15 |
| 5556 | 5.09 |
| 5557 | 4.09 |
| 5558 | 3.09 |
| 5559 | 7.29 |
| 5560 | 6.31 |
| 5561 | 5.33 |
| 5562 | 4.35 |
| 5563 | 3.37 |
| 5564 | 2.37 |
| 5565 | 1.37 |
| 5566 | 4.97 |
| 5567 | 6.77 |
| 5568 | 8.92 |
| 5569 | 7.92 |
| 5570 | 9.3 |
| 5571 | 8.3 |
| 5572 | 10.06 |
| 5573 | 9.06 |
| 5574 | 10.08 |
| 5575 | 11.68 |
| 5576 | 10.68 |
| 5577 | 9.68 |
| 5578 | 8.7 |
| 5579 | 7.72 |
| 5580 | 6.74 |
| 5581 | 5.76 |
| 5582 | 7.1 |
| 5583 | 9.65 |
| 5584 | 12.45 |
| 5585 | 11.45 |
| 5586 | 10.45 |
| 5587 | 11.81 |
| 5588 | 10.81 |
| 5589 | 15.21 |
| 5590 | 14.21 |
| 5591 | 16.66 |
| 5592 | 15.66 |
| 5593 | 14.68 |
| 5594 | 13.7 |
| 5595 | 12.72 |
| 5596 | 14.163 |
| 5597 | 13.167 |
| 5598 | 12.17 |
| 5599 | 11.175 |
| 5600 | 10.18 |
| 5601 | 12.335 |
| 5602 | 11.34 |
| 5603 | 10.34 |
| 5604 | 12.59 |
| 5605 | 11.59 |
| 5606 | 10.6 |
| 5607 | 11.83 |
| 5608 | 10.84 |
| 5609 | 9.85 |
| 5610 | 8.852 |
| 5611 | 7.855 |
| 5612 | 10.257 |
| 5613 | 9.26 |
| 5614 | 8.28 |
| 5615 | 7.3 |
| 5616 | 9.4 |
| 5617 | 8.4 |
| 5618 | 12 |
| 5619 | 11 |
| 5620 | 12.64 |
| 5621 | 11.64 |
| 5622 | 13.227 |
| 5623 | 12.235 |
| 5624 | 11.242 |
| 5625 | 10.25 |
| 5626 | 11.49 |
| 5627 | 13.13 |
| 5628 | 12.13 |
| 5629 | 11.13 |
| 5630 | 12.2 |
| 5631 | 11.21 |
| 5632 | 10.22 |
| 5633 | 9.23 |
| 5634 | 8.23 |
| 5635 | 12.13 |
| 5636 | 11.15 |
| 5637 | 10.17 |
| 5638 | 9.19 |
| 5639 | 8.19 |
| 5640 | 10.54 |
| 5641 | 9.54 |
| 5642 | 8.54 |
| 5643 | 7.54 |
| 5644 | 10.64 |
| 5645 | 9.64 |
| 5646 | 11.89 |
| 5647 | 14.34 |
| 5648 | 15.943 |
| 5649 | 14.947 |
| 5650 | 13.95 |
| 5651 | 12.955 |
| 5652 | 11.96 |
| 5653 | 14.165 |
| 5654 | 13.17 |
| 5655 | 14.33 |
| 5656 | 13.33 |
| 5657 | 12.33 |
| 5658 | 14.03 |
| 5659 | 16.28 |
| 5660 | 15.28 |
| 5661 | 16.56 |
| 5662 | 17.84 |
| 5663 | 20.94 |
| 5664 | 22.307 |
| 5665 | 21.315 |
| 5666 | 20.322 |
| 5667 | 19.33 |
| 5668 | 21.58 |
| 5669 | 20.58 |
| 5670 | 23.18 |
| 5671 | 22.18 |
| 5672 | 21.18 |
| 5673 | 22.98 |
| 5674 | 23.79 |
| 5675 | 24.325 |
| 5676 | 23.33 |
| 5677 | 22.33 |
| 5678 | 24.43 |
| 5679 | 25.11 |
| 5680 | 26.25 |
| 5681 | 26.55 |
| 5682 | 27.69 |
| 5683 | 26.69 |
| 5684 | 27.71 |
| 5685 | 26.73 |
| 5686 | 25.75 |
| 5687 | 24.77 |
| 5688 | 23.79 |
| 5689 | 22.81 |
| 5690 | 21.83 |
| 5691 | 22.87 |
| 5692 | 24.17 |
| 5693 | 23.19 |
| 5694 | 22.21 |
| 5695 | 22.39 |
| 5696 | 24.25 |
| 5697 | 23.27 |
| 5698 | 22.29 |
| 5699 | 21.29 |
| 5700 | 22.29 |
| 5701 | 21.31 |
| 5702 | 20.33 |
| 5703 | 19.33 |
| 5704 | 20.69 |
| 5705 | 19.71 |
| 5706 | 18.73 |
| 5707 | 19.79 |
| 5708 | 21.19 |
| 5709 | 21.655 |
| 5710 | 20.66 |
| 5711 | 21.54 |
| 5712 | 20.54 |
| 5713 | 19.54 |
| 5714 | 20.98 |
| 5715 | 20 |
| 5716 | 19.02 |
| 5717 | 18.02 |
| 5718 | 19.74 |
| 5719 | 18.74 |
| 5720 | 20.14 |
| 5721 | 19.14 |
| 5722 | 20.07 |
| 5723 | 21.21 |
| 5724 | 22.49 |
| 5725 | 21.51 |
| 5726 | 20.53 |
| 5727 | 22.21 |
| 5728 | 24.05 |
| 5729 | 24.46 |
| 5730 | 25.23 |
| 5731 | 24.23 |
| 5732 | 25.65 |
| 5733 | 26.17 |
| 5734 | 26.98 |
| 5735 | 25.98 |
| 5736 | 26.8 |
| 5737 | 27.395 |
| 5738 | 26.4 |
| 5739 | 27.19 |
| 5740 | 26.19 |
| 5741 | 27.33 |
| 5742 | 26.33 |
| 5743 | 27.93 |
| 5744 | 26.93 |
| 5745 | 25.95 |
| 5746 | 24.97 |
| 5747 | 25.73 |
| 5748 | 24.75 |
| 5749 | 23.77 |
| 5750 | 24.67 |
| 5751 | 26.87 |
| 5752 | 28.43 |
| 5753 | 30.58 |
| 5754 | 29.58 |
| 5755 | 31.26 |
| 5756 | 31.855 |
| 5757 | 30.86 |
| 5758 | 29.86 |
| 5759 | 30.92 |
| 5760 | 32.16 |
| 5761 | 33.62 |
| 5762 | 32.62 |
| 5763 | 33.8 |
| 5764 | 35.12 |
| 5765 | 34.12 |
| 5766 | 35.82 |
| 5767 | 37.68 |
| 5768 | 36.685 |
| 5769 | 37.42 |
| 5770 | 38.86 |
| 5771 | 37.86 |
| 5772 | 36.86 |
| 5773 | 38.28 |
| 5774 | 37.3 |
| 5775 | 36.32 |
| 5776 | 36.98 |
| 5777 | 38.72 |
| 5778 | 39.27 |
| 5779 | 38.28 |
| 5780 | 37.29 |
| 5781 | 38.087 |
| 5782 | 37.093 |
| 5783 | 36.1 |
| 5784 | 35.103 |
| 5785 | 36.707 |
| 5786 | 35.71 |
| 5787 | 36.22 |
| 5788 | 35.23 |
| 5789 | 34.24 |
| 5790 | 35.307 |
| 5791 | 34.313 |
| 5792 | 33.32 |
| 5793 | 34.07 |
| 5794 | 33.08 |
| 5795 | 32.09 |
| 5796 | 31.097 |
| 5797 | 32.053 |
| 5798 | 31.06 |
| 5799 | 31.37 |
| 5800 | 32.53 |
| 5801 | 31.53 |
| 5802 | 30.533 |
| 5803 | 32.137 |
| 5804 | 31.14 |
| 5805 | 30.143 |
| 5806 | 29.147 |
| 5807 | 30.61 |
| 5808 | 31.19 |
| 5809 | 30.19 |
| 5810 | 31.83 |
| 5811 | 31.953 |
| 5812 | 30.967 |
| 5813 | 29.98 |
| 5814 | 30.69 |
| 5815 | 29.7 |
| 5816 | 28.71 |
| 5817 | 27.71 |
| 5818 | 28.73 |
| 5819 | 29.77 |
| 5820 | 28.77 |
| 5821 | 29.53 |
| 5822 | 31.13 |
| 5823 | 31.66 |
| 5824 | 33.34 |
| 5825 | 32.34 |
| 5826 | 32.67 |
| 5827 | 33.89 |
| 5828 | 32.89 |
| 5829 | 33.87 |
| 5830 | 35.41 |
| 5831 | 34.41 |
| 5832 | 34.68 |
| 5833 | 35.34 |
| 5834 | 34.34 |
| 5835 | 34.95 |
| 5836 | 33.96 |
| 5837 | 32.97 |
| 5838 | 33.2 |
| 5839 | 33.84 |
| 5840 | 34.65 |
| 5841 | 34.92 |
| 5842 | 33.92 |
| 5843 | 35.08 |
| 5844 | 35.32 |
| 5845 | 35.56 |
| 5846 | 35.84 |
| 5847 | 34.843 |
| 5848 | 33.847 |
| 5849 | 35.29 |
| 5850 | 34.29 |
| 5851 | 35.43 |
| 5852 | 36.65 |
| 5853 | 37.29 |
| 5854 | 36.29 |
| 5855 | 37.71 |
| 5856 | 38.4 |
| 5857 | 37.4 |
| 5858 | 38.48 |
| 5859 | 38.63 |
| 5860 | 39.87 |
| 5861 | 38.87 |
| 5862 | 37.87 |
| 5863 | 36.87 |
| 5864 | 39.37 |
| 5865 | 39.573 |
| 5866 | 38.587 |
| 5867 | 37.6 |
| 5868 | 38.407 |
| 5869 | 37.413 |
| 5870 | 36.42 |
| 5871 | 36.84 |
| 5872 | 37.31 |
| 5873 | 37.83 |
| 5874 | 38.89 |
| 5875 | 40.33 |
| 5876 | 39.33 |
| 5877 | 40.13 |
| 5878 | 41.08 |
| 5879 | 40.08 |
| 5880 | 39.087 |
| 5881 | 38.093 |
| 5882 | 39.32 |
| 5883 | 38.32 |
| 5884 | 39.36 |
| 5885 | 40.46 |
| 5886 | 41.37 |
| 5887 | 42.33 |
| 5888 | 43.57 |
| 5889 | 42.573 |
| 5890 | 43.897 |
| 5891 | 42.9 |
| 5892 | 41.92 |
| 5893 | 40.94 |
| 5894 | 39.96 |
| 5895 | 38.98 |
| 5896 | 38 |
| 5897 | 37.02 |
| 5898 | 36.027 |
| 5899 | 36.963 |
| 5900 | 35.97 |
| 5901 | 36.66 |
| 5902 | 37.96 |
| 5903 | 36.96 |
| 5904 | 37.12 |
| 5905 | 36.12 |
| 5906 | 37.6 |
| 5907 | 38.49 |
| 5908 | 37.49 |
| 5909 | 38.75 |
| 5910 | 39.44 |
| 5911 | 38.45 |
| 5912 | 37.46 |
| 5913 | 36.46 |
| 5914 | 38.02 |
| 5915 | 40.02 |
| 5916 | 41.22 |
| 5917 | 42.7 |
| 5918 | 41.7 |
| 5919 | 41.91 |
| 5920 | 42.99 |
| 5921 | 41.99 |
| 5922 | 42.28 |
| 5923 | 42.9 |
| 5924 | 41.9 |
| 5925 | 40.9 |
| 5926 | 42.62 |
| 5927 | 44.72 |
| 5928 | 45.727 |
| 5929 | 44.733 |
| 5930 | 43.74 |
| 5931 | 44.003 |
| 5932 | 43.017 |
| 5933 | 42.03 |
| 5934 | 41.033 |
| 5935 | 40.037 |
| 5936 | 41.5 |
| 5937 | 40.503 |
| 5938 | 39.507 |
| 5939 | 40.89 |
| 5940 | 41.65 |
| 5941 | 42.46 |
| 5942 | 41.46 |
| 5943 | 42.943 |
| 5944 | 41.947 |
| 5945 | 40.95 |
| 5946 | 42.41 |
| 5947 | 41.41 |
| 5948 | 42.79 |
| 5949 | 44.073 |
| 5950 | 43.077 |
| 5951 | 42.08 |
| 5952 | 43.26 |
| 5953 | 42.26 |
| 5954 | 43.68 |
| 5955 | 42.68 |
| 5956 | 44.14 |
| 5957 | 45.24 |
| 5958 | 44.24 |
| 5959 | 43.26 |
| 5960 | 42.28 |
| 5961 | 41.3 |
| 5962 | 42.52 |
| 5963 | 44.34 |
| 5964 | 43.34 |
| 5965 | 42.34 |
| 5966 | 41.34 |
| 5967 | 45.74 |
| 5968 | 44.76 |
| 5969 | 43.78 |
| 5970 | 44.82 |
| 5971 | 43.82 |
| 5972 | 45.68 |
| 5973 | 44.68 |
| 5974 | 43.7 |
| 5975 | 42.72 |
| 5976 | 43.71 |
| 5977 | 42.72 |
| 5978 | 41.73 |
| 5979 | 40.74 |
| 5980 | 39.743 |
| 5981 | 41.327 |
| 5982 | 40.33 |
| 5983 | 41.693 |
| 5984 | 40.697 |
| 5985 | 39.7 |
| 5986 | 38.703 |
| 5987 | 37.707 |
| 5988 | 39.29 |
| 5989 | 38.295 |
| 5990 | 40.45 |
| 5991 | 39.455 |
| 5992 | 38.46 |
| 5993 | 42.06 |
| 5994 | 41.06 |
| 5995 | 40.06 |
| 5996 | 39.06 |
| 5997 | 41.36 |
| 5998 | 44.56 |
| 5999 | 45.82 |
| 6000 | 44.82 |
| 6001 | 46.24 |
| 6002 | 47.76 |
| 6003 | 49.91 |
| 6004 | 48.91 |
| 6005 | 47.91 |
| 6006 | 49.53 |
| 6007 | 51.25 |
| 6008 | 50.25 |
| 6009 | 49.25 |
| 6010 | 48.27 |
| 6011 | 47.29 |
| 6012 | 46.31 |
| 6013 | 45.31 |
| 6014 | 47.71 |
| 6015 | 46.71 |
| 6016 | 45.712 |
| 6017 | 44.715 |
| 6018 | 47.117 |
| 6019 | 46.12 |
| 6020 | 48.08 |
| 6021 | 50.93 |
| 6022 | 49.943 |
| 6023 | 48.957 |
| 6024 | 47.977 |
| 6025 | 46.997 |
| 6026 | 46.002 |
| 6027 | 48.107 |
| 6028 | 47.112 |
| 6029 | 46.117 |
| 6030 | 45.117 |
| 6031 | 48.317 |
| 6032 | 47.317 |
| 6033 | 46.317 |
| 6034 | 45.317 |
| 6035 | 47.367 |
| 6036 | 48.647 |
| 6037 | 47.647 |
| 6038 | 46.647 |
| 6039 | 50.547 |
| 6040 | 51.667 |
| 6041 | 50.667 |
| 6042 | 49.667 |
| 6043 | 52.767 |
| 6044 | 53.667 |
| 6045 | 52.677 |
| 6046 | 51.687 |
| 6047 | 50.697 |
| 6048 | 49.717 |
| 6049 | 48.737 |
| 6050 | 47.757 |
| 6051 | 46.777 |
| 6052 | 48.497 |
| 6053 | 47.497 |
| 6054 | 46.497 |
| 6055 | 48.237 |
| 6056 | 49.997 |
| 6057 | 48.997 |
| 6058 | 50.517 |
| 6059 | 52.177 |
| 6060 | 51.177 |
| 6061 | 52.297 |
| 6062 | 53.437 |
| 6063 | 52.437 |
| 6064 | 53.667 |
| 6065 | 52.677 |
| 6066 | 51.687 |
| 6067 | 50.697 |
| 6068 | 52.32 |
| 6069 | 51.323 |
| 6070 | 50.327 |
| 6071 | 51.527 |
| 6072 | 53.347 |
| 6073 | 52.347 |
| 6074 | 51.347 |
| 6075 | 50.367 |
| 6076 | 49.387 |
| 6077 | 48.392 |
| 6078 | 47.397 |
| 6079 | 49.502 |
| 6080 | 48.507 |
| 6081 | 47.527 |
| 6082 | 46.547 |
| 6083 | 45.567 |
| 6084 | 44.587 |
| 6085 | 43.594 |
| 6086 | 44.982 |
| 6087 | 43.989 |
| 6088 | 42.997 |
| 6089 | 43.987 |
| 6090 | 45.287 |
| 6091 | 44.287 |
| 6092 | 43.307 |
| 6093 | 42.327 |
| 6094 | 41.327 |
| 6095 | 43.627 |
| 6096 | 42.627 |
| 6097 | 45.627 |
| 6098 | 46.627 |
| 6099 | 45.637 |
| 6100 | 44.647 |
| 6101 | 43.657 |
| 6102 | 42.657 |
| 6103 | 45.657 |
| 6104 | 44.657 |
| 6105 | 45.917 |
| 6106 | 44.917 |
| 6107 | 43.917 |
| 6108 | 45.657 |
| 6109 | 48.607 |
| 6110 | 47.607 |
| 6111 | 46.607 |
| 6112 | 45.607 |
| 6113 | 48.907 |
| 6114 | 50.727 |
| 6115 | 49.727 |
| 6116 | 50.887 |
| 6117 | 49.887 |
| 6118 | 48.907 |
| 6119 | 47.927 |
| 6120 | 46.947 |
| 6121 | 49.152 |
| 6122 | 48.157 |
| 6123 | 47.162 |
| 6124 | 46.167 |
| 6125 | 45.167 |
| 6126 | 44.167 |
| 6127 | 43.167 |
| 6128 | 46.867 |
| 6129 | 48.347 |
| 6130 | 47.347 |
| 6131 | 50.247 |
| 6132 | 49.247 |
| 6133 | 52.747 |
| 6134 | 51.747 |
| 6135 | 53.227 |
| 6136 | 55.927 |
| 6137 | 54.927 |
| 6138 | 53.947 |
| 6139 | 52.967 |
| 6140 | 51.987 |
| 6141 | 51.007 |
| 6142 | 50.007 |
| 6143 | 52.557 |
| 6144 | 51.564 |
| 6145 | 53.312 |
| 6146 | 52.319 |
| 6147 | 51.327 |
| 6148 | 50.327 |
| 6149 | 53.327 |
| 6150 | 52.327 |
| 6151 | 51.332 |
| 6152 | 50.337 |
| 6153 | 49.342 |
| 6154 | 51.547 |
| 6155 | 53.027 |
| 6156 | 55.177 |
| 6157 | 57.327 |
| 6158 | 56.327 |
| 6159 | 55.327 |
| 6160 | 54.327 |
| 6161 | 53.327 |
| 6162 | 56.827 |
| 6163 | 59.427 |
| 6164 | 58.427 |
| 6165 | 57.427 |
| 6166 | 56.427 |
| 6167 | 58.877 |
| 6168 | 57.877 |
| 6169 | 56.897 |
| 6170 | 55.917 |
| 6171 | 54.937 |
| 6172 | 53.957 |
| 6173 | 52.977 |
| 6174 | 51.997 |
| 6175 | 55.597 |
| 6176 | 54.597 |
| 6177 | 53.597 |
| 6178 | 55.497 |
| 6179 | 56.797 |
| 6180 | 55.797 |
| 6181 | 54.817 |
| 6182 | 53.837 |
| 6183 | 52.857 |
| 6184 | 53.797 |
| 6185 | 52.797 |
| 6186 | 51.817 |
| 6187 | 50.837 |
| 6188 | 49.837 |
| 6189 | 51.697 |
| 6190 | 50.697 |
| 6191 | 52.137 |
| 6192 | 51.137 |
| 6193 | 50.137 |
| 6194 | 53.337 |
| 6195 | 52.337 |
| 6196 | 55.537 |
| 6197 | 54.54 |
| 6198 | 56.003 |
| 6199 | 55.007 |
| 6200 | 54.007 |
| 6201 | 53.007 |
| 6202 | 55.657 |
| 6203 | 56.92 |
| 6204 | 55.923 |
| 6205 | 54.927 |
| 6206 | 57.627 |
| 6207 | 56.627 |
| 6208 | 55.627 |
| 6209 | 57.207 |
| 6210 | 59.657 |
| 6211 | 58.657 |
| 6212 | 57.677 |
| 6213 | 56.697 |
| 6214 | 55.7 |
| 6215 | 57.423 |
| 6216 | 56.427 |
| 6217 | 55.447 |
| 6218 | 54.467 |
| 6219 | 55.667 |
| 6220 | 54.667 |
| 6221 | 56.33 |
| 6222 | 55.333 |
| 6223 | 54.337 |
| 6224 | 54.897 |
| 6225 | 55.467 |
| 6226 | 58.017 |
| 6227 | 57.017 |
| 6228 | 56.017 |
| 6229 | 57.017 |
| 6230 | 56.017 |
| 6231 | 55.037 |
| 6232 | 54.057 |
| 6233 | 53.077 |
| 6234 | 52.097 |
| 6235 | 51.117 |
| 6236 | 50.137 |
| 6237 | 49.157 |
| 6238 | 50.277 |
| 6239 | 49.277 |
| 6240 | 52.777 |
| 6241 | 54.464 |
| 6242 | 53.472 |
| 6243 | 52.479 |
| 6244 | 51.487 |
| 6245 | 52.887 |
| 6246 | 51.887 |
| 6247 | 50.907 |
| 6248 | 49.927 |
| 6249 | 48.947 |
| 6250 | 49.937 |
| 6251 | 48.937 |
| 6252 | 51.287 |
| 6253 | 50.287 |
| 6254 | 49.287 |
| 6255 | 51.047 |
| 6256 | 53.497 |
| 6257 | 52.497 |
| 6258 | 51.517 |
| 6259 | 50.537 |
| 6260 | 49.557 |
| 6261 | 48.56 |
| 6262 | 50.083 |
| 6263 | 49.087 |
| 6264 | 48.107 |
| 6265 | 47.127 |
| 6266 | 48.527 |
| 6267 | 50.267 |
| 6268 | 49.267 |
| 6269 | 51.367 |
| 6270 | 50.367 |
| 6271 | 49.387 |
| 6272 | 48.407 |
| 6273 | 47.427 |
| 6274 | 48.447 |
| 6275 | 49.767 |
| 6276 | 48.767 |
| 6277 | 47.767 |
| 6278 | 50.117 |
| 6279 | 49.117 |
| 6280 | 48.117 |
| 6281 | 52.917 |
| 6282 | 51.917 |
| 6283 | 54.167 |
| 6284 | 53.167 |
| 6285 | 55.147 |
| 6286 | 54.147 |
| 6287 | 53.147 |
| 6288 | 56.147 |
| 6289 | 55.15 |
| 6290 | 56.733 |
| 6291 | 55.737 |
| 6292 | 54.757 |
| 6293 | 53.777 |
| 6294 | 54.747 |
| 6295 | 53.747 |
| 6296 | 52.767 |
| 6297 | 51.787 |
| 6298 | 50.807 |
| 6299 | 49.827 |
| 6300 | 48.827 |
| 6301 | 52.227 |
| 6302 | 54.277 |
| 6303 | 53.277 |
| 6304 | 54.113 |
| 6305 | 53.12 |
| 6306 | 52.127 |
| 6307 | 53.467 |
| 6308 | 52.467 |
| 6309 | 51.487 |
| 6310 | 50.507 |
| 6311 | 49.527 |
| 6312 | 48.547 |
| 6313 | 49.607 |
| 6314 | 48.607 |
| 6315 | 53.007 |
| 6316 | 52.027 |
| 6317 | 51.047 |
| 6318 | 50.047 |
| 6319 | 54.347 |
| 6320 | 55.827 |
| 6321 | 54.827 |
| 6322 | 55.677 |
| 6323 | 54.677 |
| 6324 | 53.677 |
| 6325 | 52.677 |
| 6326 | 51.677 |
| 6327 | 55.077 |
| 6328 | 54.097 |
| 6329 | 53.117 |
| 6330 | 52.137 |
| 6331 | 53.864 |
| 6332 | 52.872 |
| 6333 | 51.879 |
| 6334 | 50.887 |
| 6335 | 49.887 |
| 6336 | 52.987 |
| 6337 | 51.987 |
| 6338 | 51.007 |
| 6339 | 50.027 |
| 6340 | 49.047 |
| 6341 | 48.067 |
| 6342 | 47.087 |
| 6343 | 48.487 |
| 6344 | 50.227 |
| 6345 | 49.227 |
| 6346 | 51.877 |
| 6347 | 55.377 |
| 6348 | 54.377 |
| 6349 | 55.897 |
| 6350 | 54.897 |
| 6351 | 53.897 |
| 6352 | 57.797 |
| 6353 | 56.797 |
| 6354 | 55.797 |
| 6355 | 58.597 |
| 6356 | 57.617 |
| 6357 | 56.637 |
| 6358 | 58.38 |
| 6359 | 57.383 |
| 6360 | 56.387 |
| 6361 | 57.947 |
| 6362 | 56.947 |
| 6363 | 58.49 |
| 6364 | 57.493 |
| 6365 | 56.497 |
| 6366 | 55.512 |
| 6367 | 54.527 |
| 6368 | 53.542 |
| 6369 | 52.562 |
| 6370 | 51.582 |
| 6371 | 50.602 |
| 6372 | 49.622 |
| 6373 | 48.642 |
| 6374 | 47.642 |
| 6375 | 46.642 |
| 6376 | 50.342 |
| 6377 | 49.362 |
| 6378 | 48.382 |
| 6379 | 47.402 |
| 6380 | 48.112 |
| 6381 | 47.112 |
| 6382 | 48.672 |
| 6383 | 47.672 |
| 6384 | 46.692 |
| 6385 | 45.712 |
| 6386 | 44.732 |
| 6387 | 43.732 |
| 6388 | 46.332 |
| 6389 | 45.352 |
| 6390 | 44.372 |
| 6391 | 45.252 |
| 6392 | 44.252 |
| 6393 | 43.272 |
| 6394 | 42.292 |
| 6395 | 41.312 |
| 6396 | 40.332 |
| 6397 | 40.852 |
| 6398 | 39.862 |
| 6399 | 38.872 |
| 6400 | 39.634 |
| 6401 | 38.647 |
| 6402 | 37.659 |
| 6403 | 36.672 |
| 6404 | 38.352 |
| 6405 | 37.352 |
| 6406 | 39.099 |
| 6407 | 38.107 |
| 6408 | 37.114 |
| 6409 | 36.122 |
| 6410 | 38.227 |
| 6411 | 37.232 |
| 6412 | 36.237 |
| 6413 | 35.242 |
| 6414 | 34.262 |
| 6415 | 33.282 |
| 6416 | 34.609 |
| 6417 | 33.617 |
| 6418 | 32.624 |
| 6419 | 31.632 |
| 6420 | 30.652 |
| 6421 | 29.672 |
| 6422 | 28.692 |
| 6423 | 27.712 |
| 6424 | 26.732 |
| 6425 | 27.912 |
| 6426 | 29.152 |
| 6427 | 28.162 |
| 6428 | 27.167 |
| 6429 | 29.222 |
| 6430 | 28.227 |
| 6431 | 27.232 |
| 6432 | 26.232 |
| 6433 | 28.232 |
| 6434 | 29.552 |
| 6435 | 28.552 |
| 6436 | 30.412 |
| 6437 | 29.412 |
| 6438 | 30.875 |
| 6439 | 29.878 |
| 6440 | 28.882 |
| 6441 | 30.082 |
| 6442 | 29.082 |
| 6443 | 30.262 |
| 6444 | 29.262 |
| 6445 | 31.142 |
| 6446 | 30.142 |
| 6447 | 31.202 |
| 6448 | 30.202 |
| 6449 | 31.705 |
| 6450 | 30.708 |
| 6451 | 29.712 |
| 6452 | 31.395 |
| 6453 | 30.398 |
| 6454 | 29.402 |
| 6455 | 28.422 |
| 6456 | 27.442 |
| 6457 | 26.462 |
| 6458 | 28.282 |
| 6459 | 27.302 |
| 6460 | 26.322 |
| 6461 | 25.322 |
| 6462 | 27.322 |
| 6463 | 26.322 |
| 6464 | 25.329 |
| 6465 | 24.337 |
| 6466 | 25.744 |
| 6467 | 24.752 |
| 6468 | 27.002 |
| 6469 | 26.002 |
| 6470 | 25.002 |
| 6471 | 27.402 |
| 6472 | 26.402 |
| 6473 | 25.402 |
| 6474 | 24.422 |
| 6475 | 23.442 |
| 6476 | 22.462 |
| 6477 | 21.482 |
| 6478 | 25.182 |
| 6479 | 24.182 |
| 6480 | 23.182 |
| 6481 | 22.182 |
| 6482 | 27.182 |
| 6483 | 26.182 |
| 6484 | 25.182 |
| 6485 | 29.482 |
| 6486 | 31.082 |
| 6487 | 35.682 |
| 6488 | 34.695 |
| 6489 | 33.708 |
| 6490 | 34.748 |
| 6491 | 33.748 |
| 6492 | 32.768 |
| 6493 | 31.788 |
| 6494 | 33.988 |
| 6495 | 32.988 |
| 6496 | 37.288 |
| 6497 | 36.308 |
| 6498 | 35.328 |
| 6499 | 34.348 |
| 6500 | 33.368 |
| 6501 | 32.388 |
| 6502 | 31.408 |
| 6503 | 32.428 |
| 6504 | 31.428 |
| 6505 | 32.298 |
| 6506 | 31.298 |
| 6507 | 32.678 |
| 6508 | 31.678 |
| 6509 | 32.778 |
| 6510 | 34.828 |
| 6511 | 33.848 |
| 6512 | 32.868 |
| 6513 | 31.868 |
| 6514 | 35.568 |
| 6515 | 34.568 |
| 6516 | 33.568 |
| 6517 | 38.568 |
| 6518 | 39.848 |
| 6519 | 38.848 |
| 6520 | 40.168 |
| 6521 | 41.488 |
| 6522 | 40.488 |
| 6523 | 39.508 |
| 6524 | 38.528 |
| 6525 | 37.528 |
| 6526 | 40.828 |
| 6527 | 39.828 |
| 6528 | 38.828 |
| 6529 | 37.828 |
| 6530 | 41.328 |
| 6531 | 40.328 |
| 6532 | 39.331 |
| 6533 | 41.933 |
| 6534 | 40.936 |
| 6535 | 39.938 |
| 6536 | 41.478 |
| 6537 | 40.478 |
| 6538 | 39.498 |
| 6539 | 38.518 |
| 6540 | 37.518 |
| 6541 | 40.918 |
| 6542 | 39.918 |
| 6543 | 38.918 |
| 6544 | 40.586 |
| 6545 | 39.593 |
| 6546 | 38.601 |
| 6547 | 37.608 |
| 6548 | 36.608 |
| 6549 | 38.608 |
| 6550 | 37.608 |
| 6551 | 36.608 |
| 6552 | 39.708 |
| 6553 | 40.748 |
| 6554 | 39.748 |
| 6555 | 41.108 |
| 6556 | 40.108 |
| 6557 | 42.088 |
| 6558 | 41.088 |
| 6559 | 44.038 |
| 6560 | 43.038 |
| 6561 | 44.298 |
| 6562 | 43.298 |
| 6563 | 43.873 |
| 6564 | 42.878 |
| 6565 | 43.698 |
| 6566 | 42.698 |
| 6567 | 44.078 |
| 6568 | 43.078 |
| 6569 | 45.003 |
| 6570 | 44.008 |
| 6571 | 43.013 |
| 6572 | 42.018 |
| 6573 | 41.038 |
| 6574 | 40.058 |
| 6575 | 39.078 |
| 6576 | 38.078 |
| 6577 | 40.628 |
| 6578 | 39.628 |
| 6579 | 41.678 |
| 6580 | 40.678 |
| 6581 | 42.282 |
| 6582 | 41.285 |
| 6583 | 40.288 |
| 6584 | 41.448 |
| 6585 | 40.448 |
| 6586 | 42.448 |
| 6587 | 41.448 |
| 6588 | 40.468 |
| 6589 | 39.488 |
| 6590 | 38.508 |
| 6591 | 40.048 |
| 6592 | 39.048 |
| 6593 | 38.048 |
| 6594 | 39.908 |
| 6595 | 38.908 |
| 6596 | 37.908 |
| 6597 | 36.908 |
| 6598 | 41.908 |
| 6599 | 40.912 |
| 6600 | 42.455 |
| 6601 | 41.458 |
| 6602 | 42.245 |
| 6603 | 41.252 |
| 6604 | 40.258 |
| 6605 | 39.278 |
| 6606 | 38.298 |
| 6607 | 37.318 |
| 6608 | 36.318 |
| 6609 | 38.768 |
| 6610 | 40.968 |
| 6611 | 39.968 |
| 6612 | 38.968 |
| 6613 | 43.468 |
| 6614 | 42.468 |
| 6615 | 41.468 |
| 6616 | 40.473 |
| 6617 | 39.478 |
| 6618 | 41.733 |
| 6619 | 40.738 |
| 6620 | 39.738 |
| 6621 | 38.738 |
| 6622 | 41.438 |
| 6623 | 42.428 |
| 6624 | 41.428 |
| 6625 | 40.448 |
| 6626 | 39.468 |
| 6627 | 38.488 |
| 6628 | 37.492 |
| 6629 | 38.935 |
| 6630 | 37.938 |
| 6631 | 36.958 |
| 6632 | 35.978 |
| 6633 | 34.998 |
| 6634 | 34.018 |
| 6635 | 35.462 |
| 6636 | 34.465 |
| 6637 | 33.468 |
| 6638 | 32.488 |
| 6639 | 31.508 |
| 6640 | 33.248 |
| 6641 | 32.248 |
| 6642 | 35.248 |
| 6643 | 34.268 |
| 6644 | 33.288 |
| 6645 | 32.288 |
| 6646 | 33.968 |
| 6647 | 32.988 |
| 6648 | 32.008 |
| 6649 | 31.028 |
| 6650 | 32.188 |
| 6651 | 31.188 |
| 6652 | 30.188 |
| 6653 | 29.188 |
| 6654 | 33.688 |
| 6655 | 32.708 |
| 6656 | 31.728 |
| 6657 | 30.748 |
| 6658 | 29.768 |
| 6659 | 28.788 |
| 6660 | 27.808 |
| 6661 | 28.648 |
| 6662 | 27.648 |
| 6663 | 28.988 |
| 6664 | 31.488 |
| 6665 | 30.488 |
| 6666 | 32.348 |
| 6667 | 34.398 |
| 6668 | 33.398 |
| 6669 | 35.448 |
| 6670 | 37.598 |
| 6671 | 36.598 |
| 6672 | 35.598 |
| 6673 | 34.598 |
| 6674 | 39.398 |
| 6675 | 40.862 |
| 6676 | 39.865 |
| 6677 | 38.868 |
| 6678 | 39.488 |
| 6679 | 38.488 |
| 6680 | 40.208 |
| 6681 | 39.208 |
| 6682 | 40.728 |
| 6683 | 39.748 |
| 6684 | 38.768 |
| 6685 | 37.775 |
| 6686 | 38.752 |
| 6687 | 37.758 |
| 6688 | 36.758 |
| 6689 | 40.258 |
| 6690 | 39.258 |
| 6691 | 40.248 |
| 6692 | 41.448 |
| 6693 | 42.728 |
| 6694 | 41.728 |
| 6695 | 43.228 |
| 6696 | 42.228 |
| 6697 | 43.712 |
| 6698 | 42.715 |
| 6699 | 41.718 |
| 6700 | 42.958 |
| 6701 | 41.958 |
| 6702 | 46.358 |
| 6703 | 45.358 |
| 6704 | 44.358 |
| 6705 | 48.658 |
| 6706 | 47.658 |
| 6707 | 50.008 |
| 6708 | 49.008 |
| 6709 | 49.688 |
| 6710 | 48.688 |
| 6711 | 50.988 |
| 6712 | 49.988 |
| 6713 | 48.996 |
| 6714 | 48.003 |
| 6715 | 49.731 |
| 6716 | 48.738 |
| 6717 | 50.738 |
| 6718 | 49.738 |
| 6719 | 48.738 |
| 6720 | 49.688 |
| 6721 | 51.408 |
| 6722 | 53.758 |
| 6723 | 52.758 |
| 6724 | 53.343 |
| 6725 | 52.348 |
| 6726 | 51.368 |
| 6727 | 50.388 |
| 6728 | 51.888 |
| 6729 | 50.888 |
| 6730 | 51.908 |
| 6731 | 53.088 |
| 6732 | 52.088 |
| 6733 | 51.108 |
| 6734 | 50.128 |
| 6735 | 49.128 |
| 6736 | 48.128 |
| 6737 | 49.908 |
| 6738 | 51.588 |
| 6739 | 54.438 |
| 6740 | 53.438 |
| 6741 | 54.598 |
| 6742 | 53.598 |
| 6743 | 52.618 |
| 6744 | 51.638 |
| 6745 | 50.658 |
| 6746 | 49.658 |
| 6747 | 51.958 |
| 6748 | 50.958 |
| 6749 | 49.978 |
| 6750 | 48.998 |
| 6751 | 48.018 |
| 6752 | 47.038 |
| 6753 | 46.058 |
| 6754 | 45.078 |
| 6755 | 44.078 |
| 6756 | 46.228 |
| 6757 | 49.528 |
| 6758 | 48.528 |
| 6759 | 47.548 |
| 6760 | 46.568 |
| 6761 | 45.588 |
| 6762 | 47.268 |
| 6763 | 46.268 |
| 6764 | 45.288 |
| 6765 | 44.308 |
| 6766 | 43.328 |
| 6767 | 44.868 |
| 6768 | 43.868 |
| 6769 | 42.888 |
| 6770 | 41.908 |
| 6771 | 40.928 |
| 6772 | 39.948 |
| 6773 | 38.968 |
| 6774 | 37.968 |
| 6775 | 40.018 |
| 6776 | 39.018 |
| 6777 | 41.018 |
| 6778 | 40.018 |
| 6779 | 39.018 |
| 6780 | 41.568 |
| 6781 | 40.568 |
| 6782 | 39.568 |
| 6783 | 42.968 |
| 6784 | 45.268 |
| 6785 | 44.268 |
| 6786 | 46.208 |
| 6787 | 45.208 |
| 6788 | 44.208 |
| 6789 | 43.228 |
| 6790 | 42.248 |
| 6791 | 41.248 |
| 6792 | 45.048 |
| 6793 | 46.038 |
| 6794 | 49.838 |
| 6795 | 48.858 |
| 6796 | 47.878 |
| 6797 | 46.898 |
| 6798 | 47.788 |
| 6799 | 46.798 |
| 6800 | 45.808 |
| 6801 | 44.818 |
| 6802 | 43.838 |
| 6803 | 42.858 |
| 6804 | 41.878 |
| 6805 | 40.878 |
| 6806 | 39.878 |
| 6807 | 43.878 |
| 6808 | 45.018 |
| 6809 | 47.318 |
| 6810 | 46.318 |
| 6811 | 45.318 |
| 6812 | 44.318 |
| 6813 | 46.368 |
| 6814 | 45.388 |
| 6815 | 44.408 |
| 6816 | 47.808 |
| 6817 | 46.808 |
| 6818 | 45.808 |
| 6819 | 48.008 |
| 6820 | 47.012 |
| 6821 | 48.635 |
| 6822 | 47.638 |
| 6823 | 49.338 |
| 6824 | 51.138 |
| 6825 | 50.138 |
| 6826 | 49.138 |
| 6827 | 48.138 |
| 6828 | 51.638 |
| 6829 | 52.986 |
| 6830 | 51.993 |
| 6831 | 51.001 |
| 6832 | 50.008 |
| 6833 | 52.158 |
| 6834 | 51.158 |
| 6835 | 50.158 |
| 6836 | 52.458 |
| 6837 | 55.458 |
| 6838 | 54.458 |
| 6839 | 56.038 |
| 6840 | 58.038 |
| 6841 | 57.038 |
| 6842 | 56.038 |
| 6843 | 57.498 |
| 6844 | 56.498 |
| 6845 | 59.298 |
| 6846 | 58.298 |
| 6847 | 62.598 |
| 6848 | 61.598 |
| 6849 | 62.548 |
| 6850 | 64.948 |
| 6851 | 63.968 |
| 6852 | 62.988 |
| 6853 | 62.008 |
| 6854 | 63.888 |
| 6855 | 62.888 |
| 6856 | 61.888 |
| 6857 | 60.908 |
| 6858 | 59.928 |
| 6859 | 62.528 |
| 6860 | 61.528 |
| 6861 | 60.528 |
| 6862 | 59.528 |
| 6863 | 61.428 |
| 6864 | 60.428 |
| 6865 | 62.778 |
| 6866 | 61.778 |
| 6867 | 60.798 |
| 6868 | 59.818 |
| 6869 | 61.558 |
| 6870 | 64.108 |
| 6871 | 63.108 |
| 6872 | 62.128 |
| 6873 | 61.148 |
| 6874 | 60.168 |
| 6875 | 59.168 |
| 6876 | 58.168 |
| 6877 | 60.918 |
| 6878 | 63.073 |
| 6879 | 62.078 |
| 6880 | 61.083 |
| 6881 | 60.088 |
| 6882 | 59.088 |
| 6883 | 58.088 |
| 6884 | 61.488 |
| 6885 | 60.493 |
| 6886 | 62.698 |
| 6887 | 61.703 |
| 6888 | 60.708 |
| 6889 | 59.728 |
| 6890 | 58.748 |
| 6891 | 57.768 |
| 6892 | 60.318 |
| 6893 | 59.318 |
| 6894 | 62.518 |
| 6895 | 64.158 |
| 6896 | 63.158 |
| 6897 | 62.158 |
| 6898 | 65.858 |
| 6899 | 64.861 |
| 6900 | 63.863 |
| 6901 | 66.566 |
| 6902 | 65.568 |
| 6903 | 64.588 |
| 6904 | 63.608 |
| 6905 | 62.628 |
| 6906 | 64.168 |
| 6907 | 66.008 |
| 6908 | 65.008 |
| 6909 | 64.008 |
| 6910 | 63.028 |
| 6911 | 62.048 |
| 6912 | 61.068 |
| 6913 | 60.068 |
| 6914 | 59.068 |
| 6915 | 62.068 |
| 6916 | 61.068 |
| 6917 | 62.948 |
| 6918 | 65.498 |
| 6919 | 64.498 |
| 6920 | 63.498 |
| 6921 | 62.498 |
| 6922 | 66.798 |
| 6923 | 65.798 |
| 6924 | 64.801 |
| 6925 | 67.103 |
| 6926 | 66.106 |
| 6927 | 65.108 |
| 6928 | 64.128 |
| 6929 | 63.148 |
| 6930 | 62.168 |
| 6931 | 61.168 |
| 6932 | 64.168 |
| 6933 | 63.168 |
| 6934 | 62.188 |
| 6935 | 61.208 |
| 6936 | 60.228 |
| 6937 | 59.228 |
| 6938 | 58.228 |
| 6939 | 62.128 |
| 6940 | 61.128 |
| 6941 | 64.328 |
| 6942 | 63.328 |
| 6943 | 62.348 |
| 6944 | 61.368 |
| 6945 | 60.388 |
| 6946 | 59.388 |
| 6947 | 58.388 |
| 6948 | 62.388 |
| 6949 | 61.388 |
| 6950 | 63.988 |
| 6951 | 62.988 |
| 6952 | 61.988 |
| 6953 | 60.988 |
| 6954 | 59.988 |
| 6955 | 64.388 |
| 6956 | 63.388 |
| 6957 | 66.788 |
| 6958 | 65.788 |
| 6959 | 64.808 |
| 6960 | 63.828 |
| 6961 | 62.848 |
| 6962 | 61.868 |
| 6963 | 60.868 |
| 6964 | 59.868 |
| 6965 | 58.868 |
| 6966 | 62.668 |
| 6967 | 64.773 |
| 6968 | 63.778 |
| 6969 | 62.783 |
| 6970 | 61.788 |
| 6971 | 60.788 |
| 6972 | 63.088 |
| 6973 | 62.088 |
| 6974 | 61.088 |
| 6975 | 63.888 |
| 6976 | 62.888 |
| 6977 | 61.908 |
| 6978 | 60.928 |
| 6979 | 59.948 |
| 6980 | 58.968 |
| 6981 | 57.968 |
| 6982 | 56.968 |
| 6983 | 60.468 |
| 6984 | 59.488 |
| 6985 | 58.508 |
| 6986 | 57.528 |
| 6987 | 56.528 |
| 6988 | 59.728 |
| 6989 | 58.728 |
| 6990 | 57.728 |
| 6991 | 56.748 |
| 6992 | 55.768 |
| 6993 | 54.788 |
| 6994 | 53.808 |
| 6995 | 52.828 |
| 6996 | 51.848 |
| 6997 | 50.868 |
| 6998 | 49.868 |
| 6999 | 48.868 |
| 7000 | 51.968 |
| 7001 | 50.968 |
| 7002 | 49.968 |
| 7003 | 53.168 |
| 7004 | 52.168 |
| 7005 | 51.168 |
| 7006 | 53.618 |
| 7007 | 56.718 |
| 7008 | 55.718 |
| 7009 | 57.158 |
| 7010 | 59.558 |
| 7011 | 58.558 |
| 7012 | 60.062 |
| 7013 | 59.065 |
| 7014 | 58.068 |
| 7015 | 57.088 |
| 7016 | 56.108 |
| 7017 | 55.128 |
| 7018 | 57.233 |
| 7019 | 56.238 |
| 7020 | 55.243 |
| 7021 | 54.248 |
| 7022 | 53.268 |
| 7023 | 52.288 |
| 7024 | 51.308 |
| 7025 | 50.308 |
| 7026 | 53.408 |
| 7027 | 52.408 |
| 7028 | 55.108 |
| 7029 | 54.108 |
| 7030 | 53.108 |
| 7031 | 52.128 |
| 7032 | 51.148 |
| 7033 | 50.168 |
| 7034 | 49.188 |
| 7035 | 48.208 |
| 7036 | 47.228 |
| 7037 | 46.248 |
| 7038 | 47.948 |
| 7039 | 49.788 |
| 7040 | 48.808 |
| 7041 | 47.828 |
| 7042 | 46.848 |
| 7043 | 45.868 |
| 7044 | 44.888 |
| 7045 | 43.908 |
| 7046 | 42.928 |
| 7047 | 41.948 |
| 7048 | 40.968 |
| 7049 | 39.988 |
| 7050 | 39.008 |
| 7051 | 38.028 |
| 7052 | 37.048 |
| 7053 | 36.068 |
| 7054 | 35.088 |
| 7055 | 34.088 |
| 7056 | 36.788 |
| 7057 | 40.888 |
| 7058 | 39.908 |
| 7059 | 38.928 |
| 7060 | 37.948 |
| 7061 | 36.968 |
| 7062 | 35.988 |
| 7063 | 35.008 |
| 7064 | 37.108 |
| 7065 | 36.108 |
| 7066 | 35.108 |
| 7067 | 34.108 |
| 7068 | 37.308 |
| 7069 | 36.308 |
| 7070 | 38.036 |
| 7071 | 37.043 |
| 7072 | 36.051 |
| 7073 | 35.058 |
| 7074 | 34.058 |
| 7075 | 33.058 |
| 7076 | 37.058 |
| 7077 | 36.058 |
| 7078 | 35.058 |
| 7079 | 37.458 |
| 7080 | 36.458 |
| 7081 | 37.938 |
| 7082 | 40.338 |
| 7083 | 39.338 |
| 7084 | 38.358 |
| 7085 | 37.378 |
| 7086 | 36.398 |
| 7087 | 35.398 |
| 7088 | 34.398 |
| 7089 | 37.598 |
| 7090 | 41.198 |
| 7091 | 42.698 |
| 7092 | 45.498 |
| 7093 | 44.498 |
| 7094 | 43.518 |
| 7095 | 42.538 |
| 7096 | 41.558 |
| 7097 | 40.578 |
| 7098 | 39.578 |
| 7099 | 42.078 |
| 7100 | 41.078 |
| 7101 | 42.802 |
| 7102 | 41.805 |
| 7103 | 40.808 |
| 7104 | 39.808 |
| 7105 | 42.358 |
| 7106 | 45.858 |
| 7107 | 44.858 |
| 7108 | 43.858 |
| 7109 | 42.858 |
| 7110 | 46.258 |
| 7111 | 50.758 |
| 7112 | 52.306 |
| 7113 | 51.313 |
| 7114 | 50.321 |
| 7115 | 49.328 |
| 7116 | 48.328 |
| 7117 | 52.828 |
| 7118 | 51.828 |
| 7119 | 53.532 |
| 7120 | 52.535 |
| 7121 | 51.538 |
| 7122 | 50.538 |
| 7123 | 49.538 |
| 7124 | 53.338 |
| 7125 | 52.358 |
| 7126 | 51.378 |
| 7127 | 50.398 |
| 7128 | 49.418 |
| 7129 | 51.062 |
| 7130 | 50.065 |
| 7131 | 49.068 |
| 7132 | 50.772 |
| 7133 | 49.775 |
| 7134 | 48.778 |
| 7135 | 47.778 |
| 7136 | 46.778 |
| 7137 | 45.778 |
| 7138 | 50.478 |
| 7139 | 49.498 |
| 7140 | 48.518 |
| 7141 | 47.538 |
| 7142 | 46.558 |
| 7143 | 45.558 |
| 7144 | 47.858 |
| 7145 | 46.858 |
| 7146 | 45.858 |
| 7147 | 44.858 |
| 7148 | 48.358 |
| 7149 | 50.908 |
| 7150 | 49.908 |
| 7151 | 48.908 |
| 7152 | 51.408 |
| 7153 | 54.508 |
| 7154 | 53.508 |
| 7155 | 52.508 |
| 7156 | 54.758 |
| 7157 | 53.758 |
| 7158 | 52.758 |
| 7159 | 51.758 |
| 7160 | 54.758 |
| 7161 | 53.758 |
| 7162 | 52.758 |
| 7163 | 55.458 |
| 7164 | 56.862 |
| 7165 | 55.865 |
| 7166 | 54.868 |
| 7167 | 53.888 |
| 7168 | 52.908 |
| 7169 | 51.928 |
| 7170 | 50.948 |
| 7171 | 49.968 |
| 7172 | 48.988 |
| 7173 | 48.008 |
| 7174 | 49.736 |
| 7175 | 48.743 |
| 7176 | 47.751 |
| 7177 | 46.758 |
| 7178 | 45.758 |
| 7179 | 44.758 |
| 7180 | 48.758 |
| 7181 | 47.758 |
| 7182 | 49.126 |
| 7183 | 48.133 |
| 7184 | 47.141 |
| 7185 | 46.148 |
| 7186 | 45.168 |
| 7187 | 44.188 |
| 7188 | 43.208 |
| 7189 | 45.048 |
| 7190 | 47.008 |
| 7191 | 46.008 |
| 7192 | 45.008 |
| 7193 | 47.008 |
| 7194 | 46.008 |
| 7195 | 45.008 |
| 7196 | 44.008 |
| 7197 | 43.008 |
| 7198 | 47.008 |
| 7199 | 46.023 |
| 7200 | 45.038 |
| 7201 | 44.053 |
| 7202 | 43.053 |
| 7203 | 45.353 |
| 7204 | 44.353 |
| 7205 | 46.503 |
| 7206 | 45.503 |
| 7207 | 44.503 |
| 7208 | 43.503 |
| 7209 | 42.503 |
| 7210 | 45.503 |
| 7211 | 44.523 |
| 7212 | 43.543 |
| 7213 | 42.563 |
| 7214 | 41.583 |
| 7215 | 40.583 |
| 7216 | 39.583 |
| 7217 | 43.083 |
| 7218 | 42.103 |
| 7219 | 41.123 |
| 7220 | 40.143 |
| 7221 | 39.163 |
| 7222 | 38.163 |
| 7223 | 41.163 |
| 7224 | 40.163 |
| 7225 | 39.168 |
| 7226 | 41.033 |
| 7227 | 40.038 |
| 7228 | 39.043 |
| 7229 | 38.063 |
| 7230 | 37.083 |
| 7231 | 36.103 |
| 7232 | 38.003 |
| 7233 | 37.003 |
| 7234 | 39.353 |
| 7235 | 38.353 |
| 7236 | 37.353 |
| 7237 | 39.853 |
| 7238 | 38.853 |
| 7239 | 37.853 |
| 7240 | 41.253 |
| 7241 | 40.253 |
| 7242 | 42.233 |
| 7243 | 41.233 |
| 7244 | 40.233 |
| 7245 | 39.253 |
| 7246 | 38.273 |
| 7247 | 37.293 |
| 7248 | 36.296 |
| 7249 | 35.298 |
| 7250 | 34.301 |
| 7251 | 36.953 |
| 7252 | 39.853 |
| 7253 | 38.853 |
| 7254 | 37.853 |
| 7255 | 36.853 |
| 7256 | 38.953 |
| 7257 | 37.953 |
| 7258 | 36.953 |
| 7259 | 38.437 |
| 7260 | 37.44 |
| 7261 | 36.443 |
| 7262 | 35.443 |
| 7263 | 37.843 |
| 7264 | 40.293 |
| 7265 | 39.293 |
| 7266 | 42.393 |
| 7267 | 41.393 |
| 7268 | 43.198 |
| 7269 | 42.203 |
| 7270 | 41.208 |
| 7271 | 40.213 |
| 7272 | 39.233 |
| 7273 | 38.253 |
| 7274 | 37.273 |
| 7275 | 36.293 |
| 7276 | 35.313 |
| 7277 | 34.333 |
| 7278 | 33.353 |
| 7279 | 32.373 |
| 7280 | 31.393 |
| 7281 | 30.413 |
| 7282 | 29.433 |
| 7283 | 28.453 |
| 7284 | 27.473 |
| 7285 | 26.473 |
| 7286 | 25.473 |
| 7287 | 28.173 |
| 7288 | 27.173 |
| 7289 | 26.173 |
| 7290 | 25.173 |
| 7291 | 29.373 |
| 7292 | 28.373 |
| 7293 | 27.373 |
| 7294 | 30.473 |
| 7295 | 29.493 |
| 7296 | 28.513 |
| 7297 | 27.533 |
| 7298 | 26.533 |
| 7299 | 25.533 |
| 7300 | 24.533 |
| 7301 | 28.933 |
| 7302 | 27.953 |
| 7303 | 26.973 |
| 7304 | 25.993 |
| 7305 | 25.013 |
| 7306 | 24.033 |
| 7307 | 23.053 |
| 7308 | 22.073 |
| 7309 | 23.473 |
| 7310 | 22.473 |
| 7311 | 26.773 |
| 7312 | 25.793 |
| 7313 | 24.813 |
| 7314 | 23.833 |
| 7315 | 22.853 |
| 7316 | 21.873 |
| 7317 | 20.893 |
| 7318 | 19.913 |
| 7319 | 18.933 |
| 7320 | 17.953 |
| 7321 | 19.893 |
| 7322 | 18.893 |
| 7323 | 17.893 |
| 7324 | 16.893 |
| 7325 | 19.093 |
| 7326 | 22.693 |
| 7327 | 21.693 |
| 7328 | 20.693 |
| 7329 | 22.943 |
| 7330 | 21.943 |
| 7331 | 20.943 |
| 7332 | 23.143 |
| 7333 | 22.143 |
| 7334 | 24.293 |
| 7335 | 23.293 |
| 7336 | 22.293 |
| 7337 | 21.293 |
| 7338 | 24.593 |
| 7339 | 23.593 |
| 7340 | 22.613 |
| 7341 | 21.633 |
| 7342 | 20.653 |
| 7343 | 19.653 |
| 7344 | 22.953 |
| 7345 | 27.053 |
| 7346 | 28.761 |
| 7347 | 27.768 |
| 7348 | 26.776 |
| 7349 | 25.783 |
| 7350 | 24.803 |
| 7351 | 23.823 |
| 7352 | 22.843 |
| 7353 | 21.863 |
| 7354 | 20.883 |
| 7355 | 19.903 |
| 7356 | 18.903 |
| 7357 | 17.903 |
| 7358 | 16.903 |
| 7359 | 21.403 |
| 7360 | 20.423 |
| 7361 | 19.443 |
| 7362 | 18.463 |
| 7363 | 17.483 |
| 7364 | 16.503 |
| 7365 | 15.523 |
| 7366 | 16.59 |
| 7367 | 15.597 |
| 7368 | 14.603 |
| 7369 | 13.606 |
| 7370 | 16.158 |
| 7371 | 15.161 |
| 7372 | 14.163 |
| 7373 | 13.183 |
| 7374 | 12.203 |
| 7375 | 11.223 |
| 7376 | 10.243 |
| 7377 | 9.263 |
| 7378 | 8.283 |
| 7379 | 7.283 |
| 7380 | 6.283 |
| 7381 | 9.783 |
| 7382 | 8.783 |
| 7383 | 7.783 |
| 7384 | 12.383 |
| 7385 | 11.403 |
| 7386 | 10.423 |
| 7387 | 9.443 |
| 7388 | 11.223 |
| 7389 | 10.223 |
| 7390 | 9.223 |
| 7391 | 10.867 |
| 7392 | 9.87 |
| 7393 | 8.873 |
| 7394 | 10.617 |
| 7395 | 9.62 |
| 7396 | 8.623 |
| 7397 | 7.623 |
| 7398 | 6.623 |
| 7399 | 10.823 |
| 7400 | 9.823 |
| 7401 | 12.223 |
| 7402 | 11.223 |
| 7403 | 13.773 |
| 7404 | 12.773 |
| 7405 | 11.773 |
| 7406 | 10.773 |
| 7407 | 13.873 |
| 7408 | 12.873 |
| 7409 | 11.873 |
| 7410 | 10.873 |
| 7411 | 9.873 |
| 7412 | 14.273 |
| 7413 | 13.273 |
| 7414 | 12.273 |
| 7415 | 14.873 |
| 7416 | 13.893 |
| 7417 | 12.913 |
| 7418 | 11.933 |
| 7419 | 10.953 |
| 7420 | 12.513 |
| 7421 | 11.513 |
| 7422 | 14.113 |
| 7423 | 13.113 |
| 7424 | 15.163 |
| 7425 | 17.513 |
| 7426 | 16.513 |
| 7427 | 15.513 |
| 7428 | 14.513 |
| 7429 | 13.513 |
| 7430 | 17.913 |
| 7431 | 19.513 |
| 7432 | 18.513 |
| 7433 | 22.113 |
| 7434 | 21.133 |
| 7435 | 20.153 |
| 7436 | 19.173 |
| 7437 | 18.193 |
| 7438 | 17.213 |
| 7439 | 16.233 |
| 7440 | 15.253 |
| 7441 | 14.273 |
| 7442 | 13.293 |
| 7443 | 12.313 |
| 7444 | 11.333 |
| 7445 | 10.353 |
| 7446 | 9.373 |
| 7447 | 8.393 |
| 7448 | 7.413 |
| 7449 | 6.433 |
| 7450 | 5.453 |
| 7451 | 6.917 |
| 7452 | 5.92 |
| 7453 | 4.923 |
| 7454 | 6.631 |
| 7455 | 5.638 |
| 7456 | 4.646 |
| 7457 | 3.653 |
| 7458 | 5.633 |
| 7459 | 4.633 |
| 7460 | 3.633 |
| 7461 | 6.183 |
| 7462 | 7.983 |
| 7463 | 10.933 |
| 7464 | 9.933 |
| 7465 | 11.753 |
| 7466 | 14.303 |
| 7467 | 13.303 |
| 7468 | 15.103 |
| 7469 | 14.103 |
| 7470 | 13.103 |
| 7471 | 12.103 |
| 7472 | 11.103 |
| 7473 | 14.103 |
| 7474 | 13.103 |
| 7475 | 12.123 |
| 7476 | 11.143 |
| 7477 | 10.163 |
| 7478 | 9.163 |
| 7479 | 11.163 |
| 7480 | 10.163 |
| 7481 | 9.163 |
| 7482 | 11.463 |
| 7483 | 10.463 |
| 7484 | 9.463 |
| 7485 | 8.463 |
| 7486 | 11.763 |
| 7487 | 15.763 |
| 7488 | 14.783 |
| 7489 | 13.803 |
| 7490 | 12.823 |
| 7491 | 11.843 |
| 7492 | 13.507 |
| 7493 | 12.51 |
| 7494 | 11.513 |
| 7495 | 13.318 |
| 7496 | 12.323 |
| 7497 | 11.328 |
| 7498 | 10.333 |
| 7499 | 9.333 |
| 7500 | 11.173 |
| 7501 | 10.173 |
| 7502 | 9.193 |
| 7503 | 8.213 |
| 7504 | 7.233 |
| 7505 | 8.48 |
| 7506 | 7.487 |
| 7507 | 6.493 |
| 7508 | 5.493 |
| 7509 | 7.793 |
| 7510 | 11.093 |
| 7511 | 10.093 |
| 7512 | 12.243 |
| 7513 | 11.243 |
| 7514 | 13.696 |
| 7515 | 12.698 |
| 7516 | 11.701 |
| 7517 | 10.703 |
| 7518 | 9.703 |
| 7519 | 11.903 |
| 7520 | 10.903 |
| 7521 | 9.903 |
| 7522 | 8.903 |
| 7523 | 13.003 |
| 7524 | 12.023 |
| 7525 | 11.043 |
| 7526 | 10.063 |
| 7527 | 9.068 |
| 7528 | 11.223 |
| 7529 | 10.228 |
| 7530 | 9.233 |
| 7531 | 8.233 |
| 7532 | 11.233 |
| 7533 | 10.233 |
| 7534 | 14.133 |
| 7535 | 13.153 |
| 7536 | 12.173 |
| 7537 | 11.193 |
| 7538 | 10.193 |
| 7539 | 12.443 |
| 7540 | 11.443 |
| 7541 | 10.443 |
| 7542 | 13.093 |
| 7543 | 12.093 |
| 7544 | 14.593 |
| 7545 | 13.593 |
| 7546 | 12.593 |
| 7547 | 11.613 |
| 7548 | 10.633 |
| 7549 | 9.653 |
| 7550 | 8.653 |
| 7551 | 7.653 |
| 7552 | 10.653 |
| 7553 | 12.453 |
| 7554 | 11.453 |
| 7555 | 10.453 |
| 7556 | 9.473 |
| 7557 | 8.493 |
| 7558 | 7.513 |
| 7559 | 6.527 |
| 7560 | 5.54 |
| 7561 | 4.54 |
| 7562 | 8.54 |
| 7563 | 7.54 |
| 7564 | 6.54 |
| 7565 | 5.54 |
| 7566 | 7.79 |
| 7567 | 6.79 |
| 7568 | 9.09 |
| 7569 | 11.89 |
| 7570 | 10.89 |
| 7571 | 9.89 |
| 7572 | 8.91 |
| 7573 | 7.93 |
| 7574 | 6.95 |
| 7575 | 5.97 |
| 7576 | 4.99 |
| 7577 | 4.01 |
| 7578 | 3.01 |
| 7579 | 2.01 |
| 7580 | 5.41 |
| 7581 | 7.21 |
| 7582 | 6.21 |
| 7583 | 5.21 |
| 7584 | 4.23 |
| 7585 | 3.25 |
| 7586 | 2.27 |
| 7587 | 1.29 |
| 7588 | 0.31 |
| 7589 | 0 |
| 7590 | 0 |
| 7591 | 0 |
| 7592 | 0 |
| 7593 | 0 |
| 7594 | 0 |
| 7595 | 3.5 |
| 7596 | 2.5 |
| 7597 | 1.5 |
| 7598 | 4.6 |
| 7599 | 3.6 |
| 7600 | 2.6 |
| 7601 | 1.6 |
| 7602 | 4.7 |
| 7603 | 3.72 |
| 7604 | 2.74 |
| 7605 | 1.76 |
| 7606 | 0.76 |
| 7607 | 0 |
| 7608 | 3.7 |
| 7609 | 2.72 |
| 7610 | 1.74 |
| 7611 | 0.76 |
| 7612 | 0 |
| 7613 | 3.6 |
| 7614 | 2.6 |
| 7615 | 1.62 |
| 7616 | 0.64 |
| 7617 | 0 |
| 7618 | 1.66 |
| 7619 | 0.66 |
| 7620 | 3.51 |
| 7621 | 2.51 |
| 7622 | 1.53 |
| 7623 | 0.55 |
| 7624 | 0 |
| 7625 | 0 |
| 7626 | 0 |
| 7627 | 0 |
| 7628 | 2.85 |
| 7629 | 1.85 |
| 7630 | 3.85 |
| 7631 | 2.85 |
| 7632 | 4.695 |
| 7633 | 3.7 |
| 7634 | 2.705 |
| 7635 | 1.71 |
| 7636 | 3.69 |
| 7637 | 2.69 |
| 7638 | 5.39 |
| 7639 | 4.39 |
| 7640 | 6.44 |
| 7641 | 5.44 |
| 7642 | 4.44 |
| 7643 | 6.59 |
| 7644 | 5.59 |
| 7645 | 4.59 |
| 7646 | 3.59 |
| 7647 | 5.94 |
| 7648 | 4.94 |
| 7649 | 3.96 |
| 7650 | 2.98 |
| 7651 | 2 |
| 7652 | 1 |
| 7653 | 3.85 |
| 7654 | 2.85 |
| 7655 | 1.85 |
| 7656 | 0.85 |
| 7657 | 0 |
| 7658 | 2.75 |
| 7659 | 1.77 |
| 7660 | 0.79 |
| 7661 | 0 |
| 7662 | 0 |
| 7663 | 0 |
| 7664 | 0 |
| 7665 | 0 |
| 7666 | 0 |
| 7667 | 0 |
| 7668 | 0 |
| 7669 | 1.905 |
| 7670 | 0.91 |
| 7671 | 0 |
| 7672 | 0 |
| 7673 | 1.82 |
| 7674 | 0.82 |
| 7675 | 0 |
| 7676 | 0 |
| 7677 | 2.15 |
| 7678 | 1.15 |
| 7679 | 0.15 |
| 7680 | 3 |
| 7681 | 2 |
| 7682 | 1 |
| 7683 | 3.4 |
| 7684 | 5.9 |
| 7685 | 8.4 |
| 7686 | 7.4 |
| 7687 | 11 |
| 7688 | 10 |
| 7689 | 9 |
| 7690 | 8 |
| 7691 | 11.2 |
| 7692 | 10.22 |
| 7693 | 9.24 |
| 7694 | 8.26 |
| 7695 | 7.28 |
| 7696 | 6.3 |
| 7697 | 5.32 |
| 7698 | 4.32 |
| 7699 | 3.32 |
| 7700 | 7.62 |
| 7701 | 6.62 |
| 7702 | 5.62 |
| 7703 | 4.62 |
| 7704 | 7.52 |
| 7705 | 6.52 |
| 7706 | 5.52 |
| 7707 | 10.32 |
| 7708 | 15.12 |
| 7709 | 14.14 |
| 7710 | 13.16 |
| 7711 | 12.18 |
| 7712 | 11.18 |
| 7713 | 13.43 |
| 7714 | 12.43 |
| 7715 | 14.073 |
| 7716 | 13.077 |
| 7717 | 12.08 |
| 7718 | 11.082 |
| 7719 | 13.535 |
| 7720 | 12.537 |
| 7721 | 11.54 |
| 7722 | 10.54 |
| 7723 | 13.84 |
| 7724 | 12.84 |
| 7725 | 11.84 |
| 7726 | 10.84 |
| 7727 | 9.84 |
| 7728 | 12.44 |
| 7729 | 11.44 |
| 7730 | 14.34 |
| 7731 | 18.84 |
| 7732 | 20.94 |
| 7733 | 23.59 |
| 7734 | 22.59 |
| 7735 | 24.27 |
| 7736 | 23.27 |
| 7737 | 26.57 |
| 7738 | 25.57 |
| 7739 | 27.23 |
| 7740 | 26.23 |
| 7741 | 25.23 |
| 7742 | 29.43 |
| 7743 | 28.43 |
| 7744 | 32.73 |
| 7745 | 31.73 |
| 7746 | 30.73 |
| 7747 | 29.73 |
| 7748 | 33.03 |
| 7749 | 32.05 |
| 7750 | 31.07 |
| 7751 | 30.09 |
| 7752 | 31.813 |
| 7753 | 30.817 |
| 7754 | 29.82 |
| 7755 | 28.82 |
| 7756 | 27.82 |
| 7757 | 31.42 |
| 7758 | 33.38 |
| 7759 | 32.38 |
| 7760 | 31.38 |
| 7761 | 30.385 |
| 7762 | 32.19 |
| 7763 | 31.195 |
| 7764 | 30.2 |
| 7765 | 29.22 |
| 7766 | 28.24 |
| 7767 | 27.26 |
| 7768 | 29.61 |
| 7769 | 28.61 |
| 7770 | 32.21 |
| 7771 | 31.23 |
| 7772 | 30.25 |
| 7773 | 29.27 |
| 7774 | 28.29 |
| 7775 | 27.31 |
| 7776 | 26.33 |
| 7777 | 25.35 |
| 7778 | 24.35 |
| 7779 | 26.55 |
| 7780 | 25.55 |
| 7781 | 27.133 |
| 7782 | 26.137 |
| 7783 | 25.14 |
| 7784 | 24.14 |
| 7785 | 27.04 |
| 7786 | 26.04 |
| 7787 | 27.547 |
| 7788 | 26.555 |
| 7789 | 25.562 |
| 7790 | 24.57 |
| 7791 | 23.57 |
| 7792 | 22.57 |
| 7793 | 27.07 |
| 7794 | 26.09 |
| 7795 | 25.11 |
| 7796 | 24.13 |
| 7797 | 23.13 |
| 7798 | 22.13 |
| 7799 | 26.23 |
| 7800 | 25.23 |
| 7801 | 24.23 |
| 7802 | 28.93 |
| 7803 | 27.93 |
| 7804 | 30.085 |
| 7805 | 29.09 |
| 7806 | 28.095 |
| 7807 | 27.1 |
| 7808 | 29.2 |
| 7809 | 28.2 |
| 7810 | 27.2 |
| 7811 | 26.22 |
| 7812 | 25.24 |
| 7813 | 24.26 |
| 7814 | 23.28 |
| 7815 | 22.28 |
| 7816 | 25.23 |
| 7817 | 24.23 |
| 7818 | 25.57 |
| 7819 | 24.57 |
| 7820 | 28.57 |
| 7821 | 31.52 |
| 7822 | 30.52 |
| 7823 | 29.52 |
| 7824 | 30.983 |
| 7825 | 29.987 |
| 7826 | 28.99 |
| 7827 | 27.99 |
| 7828 | 26.99 |
| 7829 | 31.89 |
| 7830 | 30.89 |
| 7831 | 32.81 |
| 7832 | 31.81 |
| 7833 | 30.83 |
| 7834 | 29.85 |
| 7835 | 28.87 |
| 7836 | 30.695 |
| 7837 | 29.7 |
| 7838 | 28.705 |
| 7839 | 27.71 |
| 7840 | 29.57 |
| 7841 | 28.57 |
| 7842 | 27.57 |
| 7843 | 29.257 |
| 7844 | 28.265 |
| 7845 | 27.272 |
| 7846 | 26.28 |
| 7847 | 25.3 |
| 7848 | 24.32 |
| 7849 | 23.34 |
| 7850 | 24.883 |
| 7851 | 23.887 |
| 7852 | 22.89 |
| 7853 | 21.91 |
| 7854 | 20.93 |
| 7855 | 19.95 |
| 7856 | 18.95 |
| 7857 | 21.25 |
| 7858 | 20.25 |
| 7859 | 19.25 |
| 7860 | 21.95 |
| 7861 | 20.95 |
| 7862 | 19.97 |
| 7863 | 18.99 |
| 7864 | 18.01 |
| 7865 | 19.57 |
| 7866 | 18.57 |
| 7867 | 21.02 |
| 7868 | 20.04 |
| 7869 | 19.06 |
| 7870 | 18.08 |
| 7871 | 17.1 |
| 7872 | 16.12 |
| 7873 | 15.14 |
| 7874 | 16.743 |
| 7875 | 15.747 |
| 7876 | 14.75 |
| 7877 | 16.153 |
| 7878 | 15.157 |
| 7879 | 14.16 |
| 7880 | 16.04 |
| 7881 | 18.39 |
| 7882 | 17.39 |
| 7883 | 16.39 |
| 7884 | 15.39 |
| 7885 | 18.24 |
| 7886 | 17.24 |
| 7887 | 16.24 |
| 7888 | 18.04 |
| 7889 | 17.04 |
| 7890 | 16.04 |
| 7891 | 17.98 |
| 7892 | 16.98 |
| 7893 | 15.98 |
| 7894 | 14.98 |
| 7895 | 18.08 |
| 7896 | 17.1 |
| 7897 | 16.12 |
| 7898 | 15.14 |
| 7899 | 14.14 |
| 7900 | 13.14 |
| 7901 | 16.09 |
| 7902 | 15.09 |
| 7903 | 17.54 |
| 7904 | 16.54 |
| 7905 | 15.54 |
| 7906 | 14.545 |
| 7907 | 16.55 |
| 7908 | 15.555 |
| 7909 | 14.56 |
| 7910 | 13.56 |
| 7911 | 12.56 |
| 7912 | 15.96 |
| 7913 | 14.96 |
| 7914 | 13.96 |
| 7915 | 17.06 |
| 7916 | 16.08 |
| 7917 | 15.1 |
| 7918 | 14.12 |
| 7919 | 16.422 |
| 7920 | 15.425 |
| 7921 | 14.427 |
| 7922 | 13.43 |
| 7923 | 15.83 |
| 7924 | 14.83 |
| 7925 | 13.83 |
| 7926 | 15.557 |
| 7927 | 14.565 |
| 7928 | 13.572 |
| 7929 | 12.58 |
| 7930 | 11.58 |
| 7931 | 10.58 |
| 7932 | 14.98 |
| 7933 | 13.98 |
| 7934 | 17.58 |
| 7935 | 16.58 |
| 7936 | 15.58 |
| 7937 | 14.6 |
| 7938 | 13.62 |
| 7939 | 12.64 |
| 7940 | 11.64 |
| 7941 | 10.64 |
| 7942 | 13.44 |
| 7943 | 15.49 |
| 7944 | 14.49 |
| 7945 | 13.49 |
| 7946 | 12.49 |
| 7947 | 11.49 |
| 7948 | 15.09 |
| 7949 | 14.11 |
| 7950 | 13.13 |
| 7951 | 12.15 |
| 7952 | 11.17 |
| 7953 | 10.19 |
| 7954 | 9.21 |
| 7955 | 8.23 |
| 7956 | 10.73 |
| 7957 | 13.23 |
| 7958 | 12.23 |
| 7959 | 11.25 |
| 7960 | 10.27 |
| 7961 | 9.29 |
| 7962 | 8.29 |
| 7963 | 10.94 |
| 7964 | 9.94 |
| 7965 | 8.94 |
| 7966 | 7.94 |
| 7967 | 11.04 |
| 7968 | 10.04 |
| 7969 | 9.04 |
| 7970 | 11.84 |
| 7971 | 10.84 |
| 7972 | 9.84 |
| 7973 | 11.89 |
| 7974 | 10.89 |
| 7975 | 9.89 |
| 7976 | 8.89 |
| 7977 | 12.69 |
| 7978 | 11.69 |
| 7979 | 13.59 |
| 7980 | 12.59 |
| 7981 | 11.59 |
| 7982 | 13.745 |
| 7983 | 12.75 |
| 7984 | 11.755 |
| 7985 | 10.76 |
| 7986 | 9.76 |
| 7987 | 8.76 |
| 7988 | 7.76 |
| 7989 | 12.36 |
| 7990 | 13.6 |
| 7991 | 16.9 |
| 7992 | 15.9 |
| 7993 | 17.95 |
| 7994 | 20.3 |
| 7995 | 19.3 |
| 7996 | 18.3 |
| 7997 | 20.16 |
| 7998 | 19.16 |
| 7999 | 18.16 |
| 8000 | 21.26 |
| 8001 | 20.26 |
| 8002 | 22.08 |
| 8003 | 24.43 |
| 8004 | 23.43 |
| 8005 | 22.43 |
| 8006 | 21.43 |
| 8007 | 25.33 |
| 8008 | 29.83 |
| 8009 | 28.83 |
| 8010 | 27.83 |
| 8011 | 31.23 |
| 8012 | 30.25 |
| 8013 | 29.27 |
| 8014 | 28.29 |
| 8015 | 30.013 |
| 8016 | 29.017 |
| 8017 | 28.02 |
| 8018 | 31.12 |
| 8019 | 30.12 |
| 8020 | 29.12 |
| 8021 | 28.12 |
| 8022 | 30.47 |
| 8023 | 29.47 |
| 8024 | 28.49 |
| 8025 | 27.51 |
| 8026 | 26.53 |
| 8027 | 25.53 |
| 8028 | 24.53 |
| 8029 | 28.03 |
| 8030 | 29.79 |
| 8031 | 28.79 |
| 8032 | 27.79 |
| 8033 | 26.79 |
| 8034 | 29.49 |
| 8035 | 28.49 |
| 8036 | 27.51 |
| 8037 | 26.53 |
| 8038 | 25.55 |
| 8039 | 24.57 |
| 8040 | 23.59 |
| 8041 | 22.61 |
| 8042 | 24.313 |
| 8043 | 23.317 |
| 8044 | 22.32 |
| 8045 | 23.567 |
| 8046 | 22.573 |
| 8047 | 21.58 |
| 8048 | 20.58 |
| 8049 | 19.58 |
| 8050 | 24.38 |
| 8051 | 23.38 |
| 8052 | 22.38 |
| 8053 | 27.38 |
| 8054 | 26.4 |
| 8055 | 25.42 |
| 8056 | 24.44 |
| 8057 | 23.46 |
| 8058 | 24.943 |
| 8059 | 23.947 |
| 8060 | 22.95 |
| 8061 | 24.353 |
| 8062 | 23.357 |
| 8063 | 22.36 |
| 8064 | 21.36 |
| 8065 | 20.36 |
| 8066 | 25.06 |
| 8067 | 24.06 |
| 8068 | 23.06 |
| 8069 | 25.04 |
| 8070 | 24.04 |
| 8071 | 25.463 |
| 8072 | 24.467 |
| 8073 | 23.47 |
| 8074 | 22.49 |
| 8075 | 21.51 |
| 8076 | 20.53 |
| 8077 | 22.35 |
| 8078 | 21.35 |
| 8079 | 20.35 |
| 8080 | 22.75 |
| 8081 | 21.75 |
| 8082 | 20.75 |
| 8083 | 19.75 |
| 8084 | 18.75 |
| 8085 | 17.75 |
| 8086 | 22.35 |
| 8087 | 21.35 |
| 8088 | 20.35 |
| 8089 | 23.75 |
| 8090 | 22.75 |
| 8091 | 24.95 |
| 8092 | 23.95 |
| 8093 | 22.95 |
| 8094 | 21.95 |
| 8095 | 20.95 |
| 8096 | 23.8 |
| 8097 | 27.3 |
| 8098 | 26.3 |
| 8099 | 25.3 |
| 8100 | 24.3 |
| 8101 | 23.3 |
| 8102 | 26.15 |
| 8103 | 25.15 |
| 8104 | 27.09 |
| 8105 | 26.09 |
| 8106 | 25.09 |
| 8107 | 26.87 |
| 8108 | 29.42 |
| 8109 | 28.42 |
| 8110 | 27.44 |
| 8111 | 26.46 |
| 8112 | 25.48 |
| 8113 | 26.86 |
| 8114 | 28.82 |
| 8115 | 27.82 |
| 8116 | 29.68 |
| 8117 | 28.68 |
| 8118 | 27.68 |
| 8119 | 29.34 |
| 8120 | 31.22 |
| 8121 | 30.22 |
| 8122 | 29.24 |
| 8123 | 28.26 |
| 8124 | 27.28 |
| 8125 | 26.3 |
| 8126 | 25.32 |
| 8127 | 24.34 |
| 8128 | 26.49 |
| 8129 | 25.49 |
| 8130 | 28.59 |
| 8131 | 27.59 |
| 8132 | 28.953 |
| 8133 | 27.957 |
| 8134 | 26.96 |
| 8135 | 25.98 |
| 8136 | 25 |
| 8137 | 24.02 |
| 8138 | 23.02 |
| 8139 | 22.02 |
| 8140 | 24.87 |
| 8141 | 26.117 |
| 8142 | 25.123 |
| 8143 | 24.13 |
| 8144 | 23.15 |
| 8145 | 22.17 |
| 8146 | 21.19 |
| 8147 | 20.21 |
| 8148 | 19.23 |
| 8149 | 18.25 |
| 8150 | 20.505 |
| 8151 | 19.51 |
| 8152 | 18.515 |
| 8153 | 17.52 |
| 8154 | 16.52 |
| 8155 | 15.52 |
| 8156 | 14.52 |
| 8157 | 18.82 |
| 8158 | 17.822 |
| 8159 | 20.375 |
| 8160 | 19.377 |
| 8161 | 18.38 |
| 8162 | 17.38 |
| 8163 | 16.38 |
| 8164 | 19.13 |
| 8165 | 18.13 |
| 8166 | 20.93 |
| 8167 | 19.93 |
| 8168 | 18.93 |
| 8169 | 20.513 |
| 8170 | 19.517 |
| 8171 | 18.52 |
| 8172 | 20.62 |
| 8173 | 22.87 |
| 8174 | 21.87 |
| 8175 | 20.87 |
| 8176 | 23.72 |
| 8177 | 28.72 |
| 8178 | 31.92 |
| 8179 | 30.92 |
| 8180 | 29.92 |
| 8181 | 28.92 |
| 8182 | 32.32 |
| 8183 | 33.723 |
| 8184 | 32.727 |
| 8185 | 31.73 |
| 8186 | 33.333 |
| 8187 | 32.337 |
| 8188 | 31.34 |
| 8189 | 30.36 |
| 8190 | 29.38 |
| 8191 | 28.4 |
| 8192 | 27.4 |
| 8193 | 26.4 |
| 8194 | 25.4 |
| 8195 | 29.4 |
| 8196 | 28.402 |
| 8197 | 30.705 |
| 8198 | 29.707 |
| 8199 | 28.71 |
| 8200 | 30.765 |
| 8201 | 29.77 |
| 8202 | 28.775 |
| 8203 | 27.78 |
| 8204 | 29.443 |
| 8205 | 28.447 |
| 8206 | 27.45 |
| 8207 | 26.45 |
| 8208 | 29.95 |
| 8209 | 28.95 |
| 8210 | 30.513 |
| 8211 | 29.517 |
| 8212 | 28.52 |
| 8213 | 30.445 |
| 8214 | 29.45 |
| 8215 | 28.455 |
| 8216 | 27.46 |
| 8217 | 26.48 |
| 8218 | 25.5 |
| 8219 | 24.52 |
| 8220 | 26.82 |
| 8221 | 25.82 |
| 8222 | 24.82 |
| 8223 | 23.82 |
| 8224 | 25.58 |
| 8225 | 24.58 |
| 8226 | 23.6 |
| 8227 | 22.62 |
| 8228 | 21.64 |
| 8229 | 20.66 |
| 8230 | 19.66 |
| 8231 | 18.66 |
| 8232 | 23.46 |
| 8233 | 24.84 |
| 8234 | 23.84 |
| 8235 | 27.54 |
| 8236 | 26.56 |
| 8237 | 25.58 |
| 8238 | 24.6 |
| 8239 | 23.62 |
| 8240 | 22.64 |
| 8241 | 21.66 |
| 8242 | 20.68 |
| 8243 | 19.7 |
| 8244 | 18.72 |
| 8245 | 17.733 |
| 8246 | 16.747 |
| 8247 | 15.767 |
| 8248 | 14.787 |
| 8249 | 13.807 |
| 8250 | 12.827 |
| 8251 | 11.847 |
| 8252 | 10.867 |
| 8253 | 9.867 |
| 8254 | 8.867 |
| 8255 | 13.767 |
| 8256 | 12.767 |
| 8257 | 11.767 |
| 8258 | 16.267 |
| 8259 | 15.267 |
| 8260 | 19.067 |
| 8261 | 18.067 |
| 8262 | 19.75 |
| 8263 | 18.753 |
| 8264 | 17.757 |
| 8265 | 19.06 |
| 8266 | 18.063 |
| 8267 | 17.067 |
| 8268 | 16.067 |
| 8269 | 18.917 |
| 8270 | 17.917 |
| 8271 | 16.917 |
| 8272 | 18.66 |
| 8273 | 17.663 |
| 8274 | 16.667 |
| 8275 | 18.817 |
| 8276 | 17.817 |
| 8277 | 16.817 |
| 8278 | 19.917 |
| 8279 | 18.917 |
| 8280 | 17.917 |
| 8281 | 20.017 |
| 8282 | 19.017 |
| 8283 | 18.017 |
| 8284 | 19.922 |
| 8285 | 18.927 |
| 8286 | 17.932 |
| 8287 | 16.937 |
| 8288 | 18.777 |
| 8289 | 17.777 |
| 8290 | 16.777 |
| 8291 | 18.557 |
| 8292 | 17.557 |
| 8293 | 16.557 |
| 8294 | 15.577 |
| 8295 | 14.597 |
| 8296 | 13.617 |
| 8297 | 15.02 |
| 8298 | 14.023 |
| 8299 | 13.027 |
| 8300 | 14.67 |
| 8301 | 13.673 |
| 8302 | 12.677 |
| 8303 | 11.68 |
| 8304 | 13.323 |
| 8305 | 12.327 |
| 8306 | 11.327 |
| 8307 | 10.327 |
| 8308 | 9.327 |
| 8309 | 14.327 |
| 8310 | 15.59 |
| 8311 | 14.593 |
| 8312 | 13.597 |
| 8313 | 12.617 |
| 8314 | 11.637 |
| 8315 | 10.657 |
| 8316 | 9.657 |
| 8317 | 8.657 |
| 8318 | 11.607 |
| 8319 | 10.607 |
| 8320 | 9.607 |
| 8321 | 14.207 |
| 8322 | 13.207 |
| 8323 | 12.207 |
| 8324 | 17.207 |
| 8325 | 16.227 |
| 8326 | 15.247 |
| 8327 | 14.267 |
| 8328 | 13.267 |
| 8329 | 12.267 |
| 8330 | 14.767 |
| 8331 | 13.767 |
| 8332 | 12.767 |
| 8333 | 16.067 |
| 8334 | 17.57 |
| 8335 | 16.573 |
| 8336 | 15.577 |
| 8337 | 14.597 |
| 8338 | 13.617 |
| 8339 | 12.637 |
| 8340 | 14.457 |
| 8341 | 13.457 |
| 8342 | 12.477 |
| 8343 | 11.497 |
| 8344 | 10.517 |
| 8345 | 9.517 |
| 8346 | 12.367 |
| 8347 | 15.217 |
| 8348 | 14.217 |
| 8349 | 13.237 |
| 8350 | 12.257 |
| 8351 | 11.277 |
| 8352 | 10.297 |
| 8353 | 9.317 |
| 8354 | 8.337 |
| 8355 | 10.487 |
| 8356 | 9.487 |
| 8357 | 8.487 |
| 8358 | 7.487 |
| 8359 | 9.787 |
| 8360 | 8.787 |
| 8361 | 10.747 |
| 8362 | 9.747 |
| 8363 | 14.247 |
| 8364 | 13.267 |
| 8365 | 12.287 |
| 8366 | 11.307 |
| 8367 | 13.107 |
| 8368 | 12.107 |
| 8369 | 16.207 |
| 8370 | 17.67 |
| 8371 | 16.673 |
| 8372 | 15.677 |
| 8373 | 14.677 |
| 8374 | 17.527 |
| 8375 | 16.527 |
| 8376 | 18.227 |
| 8377 | 17.227 |
| 8378 | 20.127 |
| 8379 | 21.654 |
| 8380 | 20.662 |
| 8381 | 19.669 |
| 8382 | 18.677 |
| 8383 | 20.657 |
| 8384 | 19.657 |
| 8385 | 18.657 |
| 8386 | 17.657 |
| 8387 | 16.657 |
| 8388 | 20.757 |
| 8389 | 19.777 |
| 8390 | 18.797 |
| 8391 | 17.817 |
| 8392 | 16.837 |
| 8393 | 15.857 |
| 8394 | 14.877 |
| 8395 | 13.897 |
| 8396 | 12.917 |
| 8397 | 11.937 |
| 8398 | 10.957 |
| 8399 | 9.977 |
| 8400 | 12.277 |
| 8401 | 11.277 |
| 8402 | 10.297 |
| 8403 | 9.317 |
| 8404 | 8.337 |
| 8405 | 11.237 |
| 8406 | 10.257 |
| 8407 | 12.607 |
| 8408 | 11.627 |
| 8409 | 10.647 |
| 8410 | 13.647 |
| 8411 | 12.667 |
| 8412 | 11.687 |
| 8413 | 10.707 |
| 8414 | 9.727 |
| 8415 | 8.747 |
| 8416 | 7.767 |
| 8417 | 6.787 |
| 8418 | 5.807 |
| 8419 | 4.827 |
| 8420 | 3.847 |
| 8421 | 2.867 |
| 8422 | 1.887 |
| 8423 | 0.907 |
| 8424 | 0 |
| 8425 | 2.35 |
| 8426 | 1.37 |
| 8427 | 0.39 |
| 8428 | 0 |
| 8429 | 0 |
| 8430 | 0 |
| 8431 | 0 |
| 8432 | 0 |
| 8433 | 2.95 |
| 8434 | 1.97 |
| 8435 | 0.99 |
| 8436 | 0.01 |
| 8437 | 2.86 |
| 8438 | 5.46 |
| 8439 | 4.48 |
| 8440 | 7.48 |
| 8441 | 6.5 |
| 8442 | 5.52 |
| 8443 | 4.54 |
| 8444 | 7.44 |
| 8445 | 6.46 |
| 8446 | 5.48 |
| 8447 | 8.18 |
| 8448 | 10.83 |
| 8449 | 9.85 |
| 8450 | 8.87 |
| 8451 | 11.37 |
| 8452 | 10.39 |
| 8453 | 9.41 |
| 8454 | 8.43 |
| 8455 | 7.45 |
| 8456 | 6.47 |
| 8457 | 5.49 |
| 8458 | 4.51 |
| 8459 | 7.41 |
| 8460 | 6.43 |
| 8461 | 5.45 |
| 8462 | 4.47 |
| 8463 | 3.47 |
| 8464 | 6.32 |
| 8465 | 5.34 |
| 8466 | 4.36 |
| 8467 | 7.26 |
| 8468 | 6.28 |
| 8469 | 5.3 |
| 8470 | 8.1 |
| 8471 | 7.12 |
| 8472 | 6.14 |
| 8473 | 5.16 |
| 8474 | 4.18 |
| 8475 | 3.2 |
| 8476 | 2.22 |
| 8477 | 4.37 |
| 8478 | 3.39 |
| 8479 | 2.41 |
| 8480 | 1.43 |
| 8481 | 0.45 |
| 8482 | 0 |
| 8483 | 0 |
| 8484 | 0 |
| 8485 | 0 |
| 8486 | 0 |
| 8487 | 0 |
| 8488 | 2.45 |
| 8489 | 1.47 |
| 8490 | 4.37 |
| 8491 | 6.87 |
| 8492 | 9.32 |
| 8493 | 12.02 |
| 8494 | 11.04 |
| 8495 | 10.06 |
| 8496 | 9.08 |
| 8497 | 11.23 |
| 8498 | 10.25 |
| 8499 | 9.27 |
| 8500 | 8.29 |
| 8501 | 7.31 |
| 8502 | 9.56 |
| 8503 | 8.58 |
| 8504 | 7.6 |
| 8505 | 6.62 |
| 8506 | 5.64 |
| 8507 | 7.99 |
| 8508 | 10.54 |
| 8509 | 9.56 |
| 8510 | 8.58 |
| 8511 | 7.6 |
| 8512 | 6.62 |
| 8513 | 9.27 |
| 8514 | 8.29 |
| 8515 | 7.31 |
| 8516 | 6.33 |
| 8517 | 9.53 |
| 8518 | 8.55 |
| 8519 | 7.57 |
| 8520 | 6.59 |
| 8521 | 11.29 |
| 8522 | 10.31 |
| 8523 | 9.33 |
| 8524 | 8.35 |
| 8525 | 7.37 |
| 8526 | 6.39 |
| 8527 | 5.41 |
| 8528 | 4.43 |
| 8529 | 3.45 |
| 8530 | 5.75 |
| 8531 | 4.77 |
| 8532 | 3.79 |
| 8533 | 2.81 |
| 8534 | 1.83 |
| 8535 | 0.85 |
| 8536 | 0 |
| 8537 | 2.1 |
| 8538 | 4.15 |
| 8539 | 3.17 |
| 8540 | 5.32 |
| 8541 | 4.34 |
| 8542 | 7.14 |
| 8543 | 6.16 |
| 8544 | 5.18 |
| 8545 | 4.2 |
| 8546 | 3.22 |
| 8547 | 2.24 |
| 8548 | 1.26 |
| 8549 | 0.28 |
| 8550 | 0 |
| 8551 | 0 |
| 8552 | 0 |
| 8553 | 0 |
| 8554 | 0 |
| 8555 | 0 |
| 8556 | 0 |
| 8557 | 2.65 |
| 8558 | 1.67 |
| 8559 | 0.69 |
| 8560 | 0 |
| 8561 | 0 |
| 8562 | 0 |
| 8563 | 0 |
| 8564 | 0 |
| 8565 | 1.96 |
| 8566 | 4.21 |
| 8567 | 7.01 |
| 8568 | 9.01 |
| 8569 | 12.31 |
| 8570 | 11.33 |
| 8571 | 10.35 |
| 8572 | 9.37 |
| 8573 | 8.39 |
| 8574 | 12.89 |
| 8575 | 15.54 |
| 8576 | 14.56 |
| 8577 | 19.06 |
| 8578 | 18.08 |
| 8579 | 17.1 |
| 8580 | 20.3 |
| 8581 | 19.32 |
| 8582 | 18.34 |
| 8583 | 17.36 |
| 8584 | 16.38 |
| 8585 | 15.4 |
| 8586 | 14.42 |
| 8587 | 13.44 |
| 8588 | 12.46 |
| 8589 | 11.48 |
| 8590 | 10.5 |
| 8591 | 9.52 |
| 8592 | 8.54 |
| 8593 | 7.56 |
| 8594 | 6.58 |
| 8595 | 10.88 |
| 8596 | 9.9 |
| 8597 | 8.92 |
| 8598 | 7.94 |
| 8599 | 6.96 |
| 8600 | 11.86 |
| 8601 | 10.88 |
| 8602 | 9.9 |
| 8603 | 8.92 |
| 8604 | 7.94 |
| 8605 | 12.04 |
| 8606 | 11.06 |
| 8607 | 10.08 |
| 8608 | 9.1 |
| 8609 | 8.12 |
| 8610 | 11.32 |
| 8611 | 10.34 |
| 8612 | 9.36 |
| 8613 | 8.38 |
| 8614 | 12.48 |
| 8615 | 11.5 |
| 8616 | 10.52 |
| 8617 | 9.54 |
| 8618 | 8.56 |
| 8619 | 7.58 |
| 8620 | 6.6 |
| 8621 | 5.62 |
| 8622 | 4.64 |
| 8623 | 3.66 |
| 8624 | 2.68 |
| 8625 | 5.28 |
| 8626 | 4.3 |
| 8627 | 3.32 |
| 8628 | 4.96 |
| 8629 | 3.98 |
| 8630 | 6.03 |
| 8631 | 5.05 |
| 8632 | 7.3 |
| 8633 | 6.32 |
| 8634 | 5.34 |
| 8635 | 4.36 |
| 8636 | 7.21 |
| 8637 | 9.41 |
| 8638 | 8.43 |
| 8639 | 7.45 |
| 8640 | 6.47 |
| 8641 | 5.49 |
| 8642 | 4.51 |
| 8643 | 7.71 |
| 8644 | 10.81 |
| 8645 | 9.83 |
| 8646 | 8.85 |
| 8647 | 7.87 |
| 8648 | 11.27 |
| 8649 | 13.92 |
| 8650 | 12.94 |
| 8651 | 11.96 |
| 8652 | 14.31 |
| 8653 | 13.33 |
| 8654 | 15.73 |
| 8655 | 14.75 |
| 8656 | 13.77 |
| 8657 | 12.79 |
| 8658 | 11.81 |
| 8659 | 10.83 |
| 8660 | 9.85 |
| 8661 | 8.87 |
| 8662 | 7.89 |
| 8663 | 6.91 |
| 8664 | 5.93 |
| 8665 | 4.95 |
| 8666 | 3.97 |
| 8667 | 2.99 |
| 8668 | 2.01 |
| 8669 | 1.03 |
| 8670 | 0.05 |
| 8671 | 0 |
| 8672 | 0 |
| 8673 | 0 |
| 8674 | 0 |
| 8675 | 0 |
| 8676 | 0 |
| 8677 | 6 |
| 8678 | 17 |
| 8679 | 19.45 |
| 8680 | 18.47 |
| 8681 | 17.49 |
| 8682 | 16.51 |
| 8683 | 15.53 |
| 8684 | 14.55 |
| 8685 | 13.57 |
| 8686 | 12.59 |
| 8687 | 16.69 |
| 8688 | 15.71 |
| 8689 | 14.73 |
| 8690 | 13.75 |
| 8691 | 12.77 |
| 8692 | 15.77 |
| 8693 | 14.79 |
| 8694 | 17.14 |
| 8695 | 16.16 |
| 8696 | 15.18 |
| 8697 | 14.2 |
| 8698 | 19.8 |
| 8699 | 18.82 |
| 8700 | 17.84 |
| 8701 | 16.86 |
| 8702 | 15.88 |
| 8703 | 14.9 |
| 8704 | 21.9 |
| 8705 | 20.92 |
| 8706 | 19.94 |
| 8707 | 22.84 |
| 8708 | 21.86 |
| 8709 | 20.88 |
| 8710 | 19.9 |
| 8711 | 18.92 |
| 8712 | 17.94 |
| 8713 | 20.79 |
| 8714 | 23.19 |
| 8715 | 26.89 |
| 8716 | 25.91 |
| 8717 | 24.93 |
| 8718 | 23.95 |
| 8719 | 22.97 |
| 8720 | 21.97 |
| 8721 | 24.67 |
| 8722 | 26.61 |
| 8723 | 25.61 |
| 8724 | 24.61 |
| 8725 | 23.63 |
| 8726 | 22.65 |
| 8727 | 24.31 |
| 8728 | 23.31 |
| 8729 | 24.737 |
| 8730 | 23.745 |
| 8731 | 22.752 |
| 8732 | 21.76 |
| 8733 | 20.78 |
| 8734 | 19.8 |
| 8735 | 18.82 |
| 8736 | 17.84 |
| 8737 | 16.86 |
| 8738 | 15.88 |
| 8739 | 14.9 |
| 8740 | 13.9 |
| 8741 | 12.9 |
| 8742 | 17.7 |
| 8743 | 18.72 |
| 8744 | 19.76 |
| 8745 | 18.76 |
| 8746 | 17.76 |
| 8747 | 18.8 |
| 8748 | 17.8 |
| 8749 | 16.82 |
| 8750 | 15.84 |
| 8751 | 18.84 |
| 8752 | 21.94 |
| 8753 | 20.94 |
| 8754 | 22.12 |
| 8755 | 21.12 |
| 8756 | 20.125 |
| 8757 | 21.91 |
| 8758 | 20.915 |
| 8759 | 19.92 |
| 8760 | 18.94 |
| 8761 | 17.96 |
| 8762 | 16.98 |
| 8763 | 16 |
| 8764 | 17.44 |
| 8765 | 16.44 |
| 8766 | 15.46 |
| 8767 | 14.48 |
| 8768 | 13.487 |
| 8769 | 14.835 |
| 8770 | 13.842 |
| 8771 | 12.85 |
| 8772 | 11.855 |
| 8773 | 10.86 |
| 8774 | 12.725 |
| 8775 | 11.73 |
| 8776 | 12.737 |
| 8777 | 11.743 |
| 8778 | 10.75 |
| 8779 | 9.75 |
| 8780 | 11.35 |
| 8781 | 10.37 |
| 8782 | 9.39 |
| 8783 | 8.41 |
| 8784 | 7.413 |
| 8785 | 9.057 |
| 8786 | 8.06 |
| 8787 | 7.08 |
| 8788 | 6.1 |
| 8789 | 8.4 |
| 8790 | 12 |
| 8791 | 11 |
| 8792 | 10 |
| 8793 | 9.02 |
| 8794 | 8.04 |
| 8795 | 7.06 |
| 8796 | 6.08 |
| 8797 | 5.1 |
| 8798 | 4.12 |
| 8799 | 5.58 |
| 8800 | 4.58 |
| 8801 | 6.68 |
| 8802 | 8.98 |
| 8803 | 8 |
| 8804 | 7.02 |
| 8805 | 6.04 |
| 8806 | 7.925 |
| 8807 | 6.93 |
| 8808 | 5.935 |
| 8809 | 4.94 |
| 8810 | 3.96 |
| 8811 | 2.98 |
| 8812 | 2 |
| 8813 | 1.02 |
| 8814 | 2.627 |
| 8815 | 1.635 |
| 8816 | 0.642 |
| 8817 | 0 |
| 8818 | 0 |
| 8819 | 0 |
| 8820 | 0 |
| 8821 | 0 |
| 8822 | 0 |
| 8823 | 0 |
| 8824 | 0 |
| 8825 | 0 |
| 8826 | 2.3 |
| 8827 | 1.3 |
| 8828 | 0.32 |
| 8829 | 0 |
| 8830 | 0 |
| 8831 | 0 |
| 8832 | 0 |
| 8833 | 0 |
| 8834 | 1.6 |
| 8835 | 0.6 |
| 8836 | 3 |
| 8837 | 2 |
| 8838 | 4.1 |
| 8839 | 3.1 |
| 8840 | 2.12 |
| 8841 | 1.14 |
| 8842 | 0.14 |
| 8843 | 2.02 |
| 8844 | 1.04 |
| 8845 | 0.06 |
| 8846 | 0 |
| 8847 | 0 |
| 8848 | 0 |
| 8849 | 0 |
| 8850 | 1.463 |
| 8851 | 0.467 |
| 8852 | 0 |
| 8853 | 1.543 |
| 8854 | 0.547 |
| 8855 | 0 |
| 8856 | 0 |
| 8857 | 0 |
| 8858 | 0 |
| 8859 | 0 |
| 8860 | 1.98 |
| 8861 | 0.98 |
| 8862 | 0 |
| 8863 | 2 |
| 8864 | 1 |
| 8865 | 0.02 |
| 8866 | 0 |
| 8867 | 0 |
| 8868 | 2.35 |
| 8869 | 1.35 |
| 8870 | 0.35 |
| 8871 | 2.4 |
| 8872 | 1.4 |
| 8873 | 0.42 |
| 8874 | 0 |
| 8875 | 0 |
| 8876 | 3.3 |
| 8877 | 2.3 |
| 8878 | 1.3 |
| 8879 | 2.72 |
| 8880 | 4.1 |
| 8881 | 5.58 |
| 8882 | 4.58 |
| 8883 | 3.58 |
| 8884 | 5.83 |
| 8885 | 4.83 |
| 8886 | 5.99 |
| 8887 | 4.99 |
| 8888 | 6.497 |
| 8889 | 5.505 |
| 8890 | 4.512 |
| 8891 | 3.52 |
| 8892 | 4.65 |
| 8893 | 3.66 |
| 8894 | 2.67 |
| 8895 | 1.68 |
| 8896 | 0.688 |
| 8897 | 2.175 |
| 8898 | 1.182 |
| 8899 | 0.19 |
| 8900 | 0 |
| 8901 | 0 |
| 8902 | 0 |
| 8903 | 0 |
| 8904 | 0 |
| 8905 | 0 |
| 8906 | 0 |
| 8907 | 4 |
| 8908 | 3.02 |
| 8909 | 2.04 |
| 8910 | 1.06 |
| 8911 | 0.06 |
| 8912 | 2.81 |
| 8913 | 1.81 |
| 8914 | 0.81 |
| 8915 | 0 |
| 8916 | 4.9 |
| 8917 | 3.92 |
| 8918 | 2.94 |
| 8919 | 1.96 |
| 8920 | 0.98 |
| 8921 | 0 |
| 8922 | 0 |
| 8923 | 1.44 |
| 8924 | 0.44 |
| 8925 | 0 |
| 8926 | 0 |
| 8927 | 0 |
| 8928 | 2.205 |
| 8929 | 3.785 |
| 8930 | 2.785 |
| 8931 | 1.785 |
| 8932 | 3.725 |
| 8933 | 2.725 |
| 8934 | 4.775 |
| 8935 | 3.775 |
| 8936 | 2.795 |
| 8937 | 1.815 |
| 8938 | 0.835 |
| 8939 | 0 |
| 8940 | 0 |
| 8941 | 0 |
| 8942 | 0 |
| 8943 | 1.12 |
| 8944 | 4.72 |
| 8945 | 6.128 |
| 8946 | 5.135 |
| 8947 | 4.143 |
| 8948 | 3.15 |
| 8949 | 4.63 |
| 8950 | 3.63 |
| 8951 | 2.65 |
| 8952 | 1.67 |
| 8953 | 0.69 |
| 8954 | 0 |
| 8955 | 1.12 |
| 8956 | 0.12 |
| 8957 | 1.28 |
| 8958 | 2.52 |
| 8959 | 1.52 |
| 8960 | 0.52 |
| 8961 | 2.083 |
| 8962 | 1.087 |
| 8963 | 0.09 |
| 8964 | 1.373 |
| 8965 | 0.377 |
| 8966 | 0 |
| 8967 | 0 |
| 8968 | 0 |
| 8969 | 0 |
| 8970 | 4.2 |
| 8971 | 3.203 |
| 8972 | 2.205 |
| 8973 | 4.508 |
| 8974 | 3.51 |
| 8975 | 5.39 |
| 8976 | 4.39 |
| 8977 | 3.39 |
| 8978 | 2.41 |
| 8979 | 1.43 |
| 8980 | 0.45 |
| 8981 | 0 |
| 8982 | 0 |
| 8983 | 2.2 |
| 8984 | 4.65 |
| 8985 | 3.65 |
| 8986 | 2.65 |
| 8987 | 1.67 |
| 8988 | 0.69 |
| 8989 | 0 |
| 8990 | 0 |
| 8991 | 0 |
| 8992 | 0 |
| 8993 | 0 |
| 8994 | 0 |
| 8995 | 1.945 |
| 8996 | 0.95 |
| 8997 | 0 |
| 8998 | 0 |
| 8999 | 0 |
| 9000 | 0 |
| 9001 | 0 |
| 9002 | 1.9 |
| 9003 | 3.82 |
| 9004 | 2.82 |
| 9005 | 1.82 |
| 9006 | 0.82 |
| 9007 | 3.77 |
| 9008 | 2.77 |
| 9009 | 4.87 |
| 9010 | 3.87 |
| 9011 | 2.87 |
| 9012 | 1.87 |
| 9013 | 3.49 |
| 9014 | 5.13 |
| 9015 | 4.13 |
| 9016 | 5.237 |
| 9017 | 4.243 |
| 9018 | 3.25 |
| 9019 | 5.45 |
| 9020 | 4.45 |
| 9021 | 3.45 |
| 9022 | 2.47 |
| 9023 | 1.49 |
| 9024 | 2.77 |
| 9025 | 1.77 |
| 9026 | 2.95 |
| 9027 | 4.53 |
| 9028 | 3.53 |
| 9029 | 2.55 |
| 9030 | 1.57 |
| 9031 | 0.57 |
| 9032 | 2.03 |
| 9033 | 3.93 |
| 9034 | 2.95 |
| 9035 | 1.97 |
| 9036 | 0.99 |
| 9037 | 0.01 |
| 9038 | 2.16 |
| 9039 | 1.16 |
| 9040 | 0.16 |
| 9041 | 1.4 |
| 9042 | 0.4 |
| 9043 | 2.26 |
| 9044 | 1.262 |
| 9045 | 0.265 |
| 9046 | 2.967 |
| 9047 | 1.97 |
| 9048 | 3.518 |
| 9049 | 2.525 |
| 9050 | 1.533 |
| 9051 | 0.54 |
| 9052 | 0 |
| 9053 | 0 |
| 9054 | 0 |
| 9055 | 0 |
| 9056 | 0 |
| 9057 | 0 |
| 9058 | 0 |
| 9059 | 0 |
| 9060 | 0 |
| 9061 | 1.548 |
| 9062 | 0.555 |
| 9063 | 0 |
| 9064 | 0 |
| 9065 | 0 |
| 9066 | 0 |
| 9067 | 3.3 |
| 9068 | 2.32 |
| 9069 | 1.34 |
| 9070 | 0.36 |
| 9071 | 0 |
| 9072 | 0 |
| 9073 | 0 |
| 9074 | 1.303 |
| 9075 | 0.307 |
| 9076 | 0 |
| 9077 | 0 |
| 9078 | 0 |
| 9079 | 0 |
| 9080 | 1.4 |
| 9081 | 3.3 |
| 9082 | 2.3 |
| 9083 | 3.38 |
| 9084 | 5.26 |
| 9085 | 4.26 |
| 9086 | 5.427 |
| 9087 | 4.433 |
| 9088 | 3.44 |
| 9089 | 2.46 |
| 9090 | 1.48 |
| 9091 | 2.64 |
| 9092 | 1.64 |
| 9093 | 0.66 |
| 9094 | 0 |
| 9095 | 0 |
| 9096 | 0 |
| 9097 | 0 |
| 9098 | 0 |
| 9099 | 0 |
| 9100 | 1.567 |
| 9101 | 0.575 |
| 9102 | 0 |
| 9103 | 1.668 |
| 9104 | 0.675 |
| 9105 | 0 |
| 9106 | 0 |
| 9107 | 0 |
| 9108 | 3 |
| 9109 | 2 |
| 9110 | 3.487 |
| 9111 | 2.495 |
| 9112 | 1.503 |
| 9113 | 0.51 |
| 9114 | 1.61 |
| 9115 | 3.66 |
| 9116 | 2.66 |
| 9117 | 1.66 |
| 9118 | 2.98 |
| 9119 | 4.72 |
| 9120 | 3.72 |
| 9121 | 2.74 |
| 9122 | 1.76 |
| 9123 | 0.78 |
| 9124 | 0 |
| 9125 | 0 |
| 9126 | 1.743 |
| 9127 | 0.747 |
| 9128 | 0 |
| 9129 | 0 |
| 9130 | 2.8 |
| 9131 | 1.82 |
| 9132 | 0.84 |
| 9133 | 0 |
| 9134 | 3 |
| 9135 | 2.02 |
| 9136 | 1.04 |
| 9137 | 0.06 |
| 9138 | 0 |
| 9139 | 0 |
| 9140 | 1.367 |
| 9141 | 0.375 |
| 9142 | 0 |
| 9143 | 0 |
| 9144 | 0 |
| 9145 | 0 |
| 9146 | 1.607 |
| 9147 | 0.615 |
| 9148 | 0 |
| 9149 | 0 |
| 9150 | 0 |
| 9151 | 0 |
| 9152 | 1.403 |
| 9153 | 0.407 |
| 9154 | 0 |
| 9155 | 0 |
| 9156 | 0 |
| 9157 | 2.155 |
| 9158 | 1.16 |
| 9159 | 2.523 |
| 9160 | 1.527 |
| 9161 | 0.53 |
| 9162 | 0 |
| 9163 | 0 |
| 9164 | 1.925 |
| 9165 | 0.93 |
| 9166 | 2.19 |
| 9167 | 1.19 |
| 9168 | 3.34 |
| 9169 | 2.34 |
| 9170 | 1.36 |
| 9171 | 0.38 |
| 9172 | 2.063 |
| 9173 | 1.067 |
| 9174 | 0.07 |
| 9175 | 1.337 |
| 9176 | 0.345 |
| 9177 | 0 |
| 9178 | 0 |
| 9179 | 2.255 |
| 9180 | 1.26 |
| 9181 | 0.265 |
| 9182 | 0 |
| 9183 | 0 |
| 9184 | 0 |
| 9185 | 1.227 |
| 9186 | 2.313 |
| 9187 | 1.32 |
| 9188 | 0.327 |
| 9189 | 1.367 |
| 9190 | 2.487 |
| 9191 | 1.487 |
| 9192 | 3.19 |
| 9193 | 2.193 |
| 9194 | 1.197 |
| 9195 | 0.197 |
| 9196 | 2.697 |
| 9197 | 1.697 |
| 9198 | 2.777 |
| 9199 | 1.777 |
| 9200 | 0.797 |
| 9201 | 0 |
| 9202 | 0 |
| 9203 | 0 |
| 9204 | 2.7 |
| 9205 | 4.403 |
| 9206 | 3.407 |
| 9207 | 2.41 |
| 9208 | 1.41 |
| 9209 | 0.41 |
| 9210 | 3.41 |
| 9211 | 2.43 |
| 9212 | 1.45 |
| 9213 | 2.53 |
| 9214 | 1.53 |
| 9215 | 5.23 |
| 9216 | 4.25 |
| 9217 | 3.27 |
| 9218 | 4.63 |
| 9219 | 5.99 |
| 9220 | 4.99 |
| 9221 | 3.99 |
| 9222 | 5.31 |
| 9223 | 7.51 |
| 9224 | 6.51 |
| 9225 | 8.09 |
| 9226 | 7.09 |
| 9227 | 9.24 |
| 9228 | 8.24 |
| 9229 | 7.26 |
| 9230 | 6.28 |
| 9231 | 5.28 |
| 9232 | 4.28 |
| 9233 | 7.28 |
| 9234 | 8.943 |
| 9235 | 7.947 |
| 9236 | 6.95 |
| 9237 | 8.117 |
| 9238 | 7.123 |
| 9239 | 6.13 |
| 9240 | 5.15 |
| 9241 | 4.17 |
| 9242 | 3.19 |
| 9243 | 2.198 |
| 9244 | 3.625 |
| 9245 | 2.633 |
| 9246 | 1.64 |
| 9247 | 0.66 |
| 9248 | 0 |
| 9249 | 0 |
| 9250 | 1.3 |
| 9251 | 0.3 |
| 9252 | 0 |
| 9253 | 0 |
| 9254 | 0 |
| 9255 | 0 |
| 9256 | 0 |
| 9257 | 0 |
| 9258 | 0 |
| 9259 | 0 |
| 9260 | 1.18 |
| 9261 | 4.58 |
| 9262 | 3.6 |
| 9263 | 2.62 |
| 9264 | 1.64 |
| 9265 | 2.72 |
| 9266 | 1.72 |
| 9267 | 0.74 |
| 9268 | 0 |
| 9269 | 1.98 |
| 9270 | 0.98 |
| 9271 | 0 |
| 9272 | 0 |
| 9273 | 2.9 |
| 9274 | 5.75 |
| 9275 | 4.75 |
| 9276 | 3.75 |
| 9277 | 5.9 |
| 9278 | 7.367 |
| 9279 | 6.375 |
| 9280 | 5.383 |
| 9281 | 4.39 |
| 9282 | 3.41 |
| 9283 | 2.43 |
| 9284 | 5.033 |
| 9285 | 4.035 |
| 9286 | 3.038 |
| 9287 | 2.04 |
| 9288 | 3.543 |
| 9289 | 2.547 |
| 9290 | 1.55 |
| 9291 | 2.58 |
| 9292 | 1.59 |
| 9293 | 0.6 |
| 9294 | 0 |
| 9295 | 1.16 |
| 9296 | 0.16 |
| 9297 | 0 |
| 9298 | 1.965 |
| 9299 | 0.97 |
| 9300 | 0 |
| 9301 | 0 |
| 9302 | 0 |
| 9303 | 0 |
| 9304 | 2.005 |
| 9305 | 1.005 |
| 9306 | 3.555 |
| 9307 | 2.575 |
| 9308 | 1.595 |
| 9309 | 3.035 |
| 9310 | 4.915 |
| 9311 | 7.015 |
| 9312 | 6.015 |
| 9313 | 8.565 |
| 9314 | 7.565 |
| 9315 | 10.265 |
| 9316 | 9.265 |
| 9317 | 8.265 |
| 9318 | 13.165 |
| 9319 | 12.185 |
| 9320 | 11.205 |
| 9321 | 13.255 |
| 9322 | 12.255 |
| 9323 | 13.615 |
| 9324 | 12.615 |
| 9325 | 11.62 |
| 9326 | 10.625 |
| 9327 | 12.73 |
| 9328 | 11.735 |
| 9329 | 10.755 |
| 9330 | 9.775 |
| 9331 | 8.795 |
| 9332 | 7.815 |
| 9333 | 6.835 |
| 9334 | 5.855 |
| 9335 | 4.875 |
| 9336 | 6.735 |
| 9337 | 5.735 |
| 9338 | 7.985 |
| 9339 | 6.985 |
| 9340 | 8.035 |
| 9341 | 7.045 |
| 9342 | 6.055 |
| 9343 | 5.065 |
| 9344 | 4.085 |
| 9345 | 3.105 |
| 9346 | 2.105 |
| 9347 | 1.105 |
| 9348 | 4.405 |
| 9349 | 3.405 |
| 9350 | 4.645 |
| 9351 | 6.345 |
| 9352 | 8.185 |
| 9353 | 7.185 |
| 9354 | 6.185 |
| 9355 | 5.19 |
| 9356 | 7.345 |
| 9357 | 6.35 |
| 9358 | 5.355 |
| 9359 | 4.375 |
| 9360 | 3.395 |
| 9361 | 4.695 |
| 9362 | 3.695 |
| 9363 | 2.697 |
| 9364 | 5.35 |
| 9365 | 4.352 |
| 9366 | 3.355 |
| 9367 | 2.375 |
| 9368 | 1.395 |
| 9369 | 0.395 |
| 9370 | 2.945 |
| 9371 | 1.945 |
| 9372 | 0.945 |
| 9373 | 0 |
| 9374 | 5 |
| 9375 | 4.02 |
| 9376 | 3.04 |
| 9377 | 2.04 |
| 9378 | 1.04 |
| 9379 | 3.24 |
| 9380 | 2.26 |
| 9381 | 1.28 |
| 9382 | 0.3 |
| 9383 | 1.46 |
| 9384 | 0.46 |
| 9385 | 2.71 |
| 9386 | 1.71 |
| 9387 | 0.71 |
| 9388 | 1.73 |
| 9389 | 3.35 |
| 9390 | 2.35 |
| 9391 | 1.35 |
| 9392 | 2.37 |
| 9393 | 1.39 |
| 9394 | 0.41 |
| 9395 | 0 |
| 9396 | 0 |
| 9397 | 0 |
| 9398 | 0 |
| 9399 | 0 |
| 9400 | 0 |
| 9401 | 0 |
| 9402 | 2.05 |
| 9403 | 1.05 |
| 9404 | 0.05 |
| 9405 | 1.33 |
| 9406 | 2.63 |
| 9407 | 1.63 |
| 9408 | 0.63 |
| 9409 | 0 |
| 9410 | 1.74 |
| 9411 | 4.14 |
| 9412 | 3.14 |
| 9413 | 4.44 |
| 9414 | 3.44 |
| 9415 | 2.46 |
| 9416 | 1.48 |
| 9417 | 2.743 |
| 9418 | 1.747 |
| 9419 | 0.75 |
| 9420 | 0 |
| 9421 | 3.1 |
| 9422 | 2.12 |
| 9423 | 1.14 |
| 9424 | 2.37 |
| 9425 | 1.38 |
| 9426 | 0.39 |
| 9427 | 0 |
| 9428 | 0 |
| 9429 | 0 |
| 9430 | 0 |
| 9431 | 3.6 |
| 9432 | 4.868 |
| 9433 | 3.875 |
| 9434 | 2.883 |
| 9435 | 1.89 |
| 9436 | 0.89 |
| 9437 | 0 |
| 9438 | 4.5 |
| 9439 | 3.5 |
| 9440 | 2.5 |
| 9441 | 4.65 |
| 9442 | 3.65 |
| 9443 | 2.655 |
| 9444 | 1.66 |
| 9445 | 0.665 |
| 9446 | 2.72 |
| 9447 | 1.72 |
| 9448 | 0.72 |
| 9449 | 3.82 |
| 9450 | 2.84 |
| 9451 | 1.86 |
| 9452 | 0.88 |
| 9453 | 0 |
| 9454 | 0 |
| 9455 | 0 |
| 9456 | 1.603 |
| 9457 | 0.607 |
| 9458 | 0 |
| 9459 | 5 |
| 9460 | 4.02 |
| 9461 | 3.04 |
| 9462 | 2.06 |
| 9463 | 1.06 |
| 9464 | 3.31 |
| 9465 | 5.053 |
| 9466 | 4.057 |
| 9467 | 3.06 |
| 9468 | 2.06 |
| 9469 | 5.66 |
| 9470 | 4.66 |
| 9471 | 6 |
| 9472 | 5 |
| 9473 | 6.227 |
| 9474 | 5.233 |
| 9475 | 4.24 |
| 9476 | 3.24 |
| 9477 | 5.39 |
| 9478 | 4.39 |
| 9479 | 3.41 |
| 9480 | 2.43 |
| 9481 | 1.45 |
| 9482 | 0.47 |
| 9483 | 0 |
| 9484 | 0 |
| 9485 | 0 |
| 9486 | 0 |
| 9487 | 5 |
| 9488 | 4.02 |
| 9489 | 3.04 |
| 9490 | 2.04 |
| 9491 | 5.74 |
| 9492 | 4.76 |
| 9493 | 3.78 |
| 9494 | 2.785 |
| 9495 | 1.79 |
| 9496 | 3.845 |
| 9497 | 2.85 |
| 9498 | 1.85 |
| 9499 | 4.25 |
| 9500 | 3.25 |
| 9501 | 8.25 |
| 9502 | 9.33 |
| 9503 | 11.83 |
| 9504 | 13.43 |
| 9505 | 12.43 |
| 9506 | 15.43 |
| 9507 | 16.43 |
| 9508 | 15.43 |
| 9509 | 18.63 |
| 9510 | 17.63 |
| 9511 | 16.63 |
| 9512 | 19.83 |
| 9513 | 21.71 |
| 9514 | 20.71 |
| 9515 | 19.71 |
| 9516 | 18.71 |
| 9517 | 22.21 |
| 9518 | 21.21 |
| 9519 | 22.33 |
| 9520 | 23.93 |
| 9521 | 22.93 |
| 9522 | 21.95 |
| 9523 | 20.97 |
| 9524 | 19.97 |
| 9525 | 23.07 |
| 9526 | 22.09 |
| 9527 | 21.11 |
| 9528 | 22.31 |
| 9529 | 24.11 |
| 9530 | 23.11 |
| 9531 | 24.97 |
| 9532 | 23.97 |
| 9533 | 22.97 |
| 9534 | 21.97 |
| 9535 | 23.57 |
| 9536 | 25.72 |
| 9537 | 24.72 |
| 9538 | 23.74 |
| 9539 | 22.76 |
| 9540 | 21.78 |
| 9541 | 20.8 |
| 9542 | 19.82 |
| 9543 | 18.84 |
| 9544 | 17.86 |
| 9545 | 16.88 |
| 9546 | 15.88 |
| 9547 | 18.08 |
| 9548 | 19.623 |
| 9549 | 18.627 |
| 9550 | 17.63 |
| 9551 | 16.637 |
| 9552 | 18.265 |
| 9553 | 17.272 |
| 9554 | 16.28 |
| 9555 | 18.53 |
| 9556 | 17.53 |
| 9557 | 16.53 |
| 9558 | 15.53 |
| 9559 | 18.38 |
| 9560 | 17.38 |
| 9561 | 16.4 |
| 9562 | 15.42 |
| 9563 | 14.44 |
| 9564 | 13.46 |
| 9565 | 12.46 |
| 9566 | 15.86 |
| 9567 | 14.88 |
| 9568 | 13.9 |
| 9569 | 12.92 |
| 9570 | 11.94 |
| 9571 | 10.96 |
| 9572 | 9.98 |
| 9573 | 9 |
| 9574 | 8.02 |
| 9575 | 7.04 |
| 9576 | 6.06 |
| 9577 | 5.08 |
| 9578 | 4.1 |
| 9579 | 3.12 |
| 9580 | 2.14 |
| 9581 | 3.42 |
| 9582 | 2.42 |
| 9583 | 3.72 |
| 9584 | 5.18 |
| 9585 | 4.18 |
| 9586 | 7.28 |
| 9587 | 9.335 |
| 9588 | 8.34 |
| 9589 | 7.345 |
| 9590 | 6.35 |
| 9591 | 5.37 |
| 9592 | 4.39 |
| 9593 | 3.39 |
| 9594 | 5.44 |
| 9595 | 4.443 |
| 9596 | 3.447 |
| 9597 | 4.99 |
| 9598 | 6.87 |
| 9599 | 5.87 |
| 9600 | 4.87 |
| 9601 | 3.89 |
| 9602 | 2.91 |
| 9603 | 1.93 |
| 9604 | 0.95 |
| 9605 | 0 |
| 9606 | 0 |
| 9607 | 0 |
| 9608 | 0 |
| 9609 | 1.428 |
| 9610 | 0.435 |
| 9611 | 0 |
| 9612 | 0 |
| 9613 | 1.483 |
| 9614 | 0.487 |
| 9615 | 0 |
| 9616 | 0 |
| 9617 | 0 |
| 9618 | 0 |
| 9619 | 0 |
| 9620 | 2.25 |
| 9621 | 1.25 |
| 9622 | 0.27 |
| 9623 | 0 |
| 9624 | 0 |
| 9625 | 0 |
| 9626 | 1.54 |
| 9627 | 0.54 |
| 9628 | 0 |
| 9629 | 1.543 |
| 9630 | 0.547 |
| 9631 | 1.707 |
| 9632 | 0.707 |
| 9633 | 0 |
| 9634 | 2.35 |
| 9635 | 1.37 |
| 9636 | 0.39 |
| 9637 | 0 |
| 9638 | 0 |
| 9639 | 4.9 |
| 9640 | 3.9 |
| 9641 | 6.9 |
| 9642 | 7.9 |
| 9643 | 6.9 |
| 9644 | 8.7 |
| 9645 | 11.45 |
| 9646 | 10.45 |
| 9647 | 9.47 |
| 9648 | 8.49 |
| 9649 | 7.49 |
| 9650 | 9.54 |
| 9651 | 8.54 |
| 9652 | 7.56 |
| 9653 | 6.58 |
| 9654 | 5.58 |
| 9655 | 4.58 |
| 9656 | 7.88 |
| 9657 | 9.367 |
| 9658 | 8.375 |
| 9659 | 7.382 |
| 9660 | 6.39 |
| 9661 | 5.39 |
| 9662 | 7.19 |
| 9663 | 6.19 |
| 9664 | 9.29 |
| 9665 | 10.39 |
| 9666 | 9.39 |
| 9667 | 10.73 |
| 9668 | 12.65 |
| 9669 | 11.67 |
| 9670 | 10.69 |
| 9671 | 9.71 |
| 9672 | 8.73 |
| 9673 | 7.75 |
| 9674 | 6.77 |
| 9675 | 5.79 |
| 9676 | 4.79 |
| 9677 | 6.07 |
| 9678 | 7.51 |
| 9679 | 6.51 |
| 9680 | 5.53 |
| 9681 | 4.55 |
| 9682 | 3.57 |
| 9683 | 4.957 |
| 9684 | 3.965 |
| 9685 | 2.972 |
| 9686 | 1.98 |
| 9687 | 0.98 |
| 9688 | 3.08 |
| 9689 | 2.08 |
| 9690 | 1.1 |
| 9691 | 0.12 |
| 9692 | 0 |
| 9693 | 1.52 |
| 9694 | 5.82 |
| 9695 | 4.82 |
| 9696 | 6.92 |
| 9697 | 5.92 |
| 9698 | 4.94 |
| 9699 | 3.96 |
| 9700 | 5.26 |
| 9701 | 4.26 |
| 9702 | 3.28 |
| 9703 | 2.3 |
| 9704 | 1.3 |
| 9705 | 3.7 |
| 9706 | 2.7 |
| 9707 | 4.043 |
| 9708 | 3.047 |
| 9709 | 2.05 |
| 9710 | 1.05 |
| 9711 | 0.05 |
| 9712 | 1.85 |
| 9713 | 6.25 |
| 9714 | 5.27 |
| 9715 | 4.29 |
| 9716 | 3.31 |
| 9717 | 2.33 |
| 9718 | 1.35 |
| 9719 | 0.37 |
| 9720 | 0 |
| 9721 | 1.743 |
| 9722 | 0.747 |
| 9723 | 0 |
| 9724 | 0 |
| 9725 | 1.66 |
| 9726 | 0.66 |
| 9727 | 5.16 |
| 9728 | 6.41 |
| 9729 | 5.42 |
| 9730 | 4.43 |
| 9731 | 3.44 |
| 9732 | 2.46 |
| 9733 | 1.48 |
| 9734 | 0.5 |
| 9735 | 0 |
| 9736 | 0 |
| 9737 | 1.905 |
| 9738 | 0.91 |
| 9739 | 0 |
| 9740 | 0 |
| 9741 | 1.6 |
| 9742 | 0.6 |
| 9743 | 1.847 |
| 9744 | 0.853 |
| 9745 | 0 |
| 9746 | 1 |
| 9747 | 2.44 |
| 9748 | 1.44 |
| 9749 | 2.54 |
| 9750 | 1.54 |
| 9751 | 0.54 |
| 9752 | 2.99 |
| 9753 | 1.993 |
| 9754 | 0.995 |
| 9755 | 3.748 |
| 9756 | 2.75 |
| 9757 | 1.753 |
| 9758 | 3.157 |
| 9759 | 2.16 |
| 9760 | 1.18 |
| 9761 | 0.2 |
| 9762 | 0 |
| 9763 | 0 |
| 9764 | 0 |
| 9765 | 1.9 |
| 9766 | 0.9 |
| 9767 | 0 |
| 9768 | 0 |
| 9769 | 1.4 |
| 9770 | 0.4 |
| 9771 | 1.6 |
| 9772 | 0.6 |
| 9773 | 0 |
| 9774 | 0 |
| 9775 | 0 |
| 9776 | 3.4 |
| 9777 | 2.403 |
| 9778 | 1.405 |
| 9779 | 3.758 |
| 9780 | 2.76 |
| 9781 | 1.76 |
| 9782 | 0.76 |
| 9783 | 3.51 |
| 9784 | 4.577 |
| 9785 | 3.583 |
| 9786 | 2.59 |
| 9787 | 3.79 |
| 9788 | 2.79 |
| 9789 | 1.81 |
| 9790 | 0.83 |
| 9791 | 0 |
| 9792 | 1.247 |
| 9793 | 0.253 |
| 9794 | 3.153 |
| 9795 | 2.153 |
| 9796 | 1.153 |
| 9797 | 0.153 |
| 9798 | 3.553 |
| 9799 | 5.413 |
| 9800 | 4.413 |
| 9801 | 5.433 |
| 9802 | 4.433 |
| 9803 | 3.433 |
| 9804 | 5.833 |
| 9805 | 4.833 |
| 9806 | 6.883 |
| 9807 | 5.883 |
| 9808 | 4.883 |
| 9809 | 6.703 |
| 9810 | 5.703 |
| 9811 | 4.703 |
| 9812 | 6.003 |
| 9813 | 8.003 |
| 9814 | 7.003 |
| 9815 | 6.003 |
| 9816 | 7.303 |
| 9817 | 8.683 |
| 9818 | 7.683 |
| 9819 | 9.463 |
| 9820 | 10.47 |
| 9821 | 9.477 |
| 9822 | 8.483 |
| 9823 | 9.931 |
| 9824 | 8.938 |
| 9825 | 7.946 |
| 9826 | 6.953 |
| 9827 | 5.973 |
| 9828 | 4.993 |
| 9829 | 3.996 |
| 9830 | 2.998 |
| 9831 | 5.551 |
| 9832 | 4.553 |
| 9833 | 3.573 |
| 9834 | 2.593 |
| 9835 | 1.613 |
| 9836 | 0.618 |
| 9837 | 2.463 |
| 9838 | 1.468 |
| 9839 | 0.473 |
| 9840 | 1.753 |
| 9841 | 0.753 |
| 9842 | 0 |
| 9843 | 0 |
| 9844 | 0 |
| 9845 | 0 |
| 9846 | 0 |
| 9847 | 1.04 |
| 9848 | 3.99 |
| 9849 | 2.99 |
| 9850 | 1.99 |
| 9851 | 0.99 |
| 9852 | 3.44 |
| 9853 | 6.04 |
| 9854 | 5.04 |
| 9855 | 4.06 |
| 9856 | 3.08 |
| 9857 | 2.1 |
| 9858 | 1.1 |
| 9859 | 0.1 |
| 9860 | 2.55 |
| 9861 | 1.55 |
| 9862 | 4.1 |
| 9863 | 3.1 |
| 9864 | 2.12 |
| 9865 | 1.14 |
| 9866 | 2.48 |
| 9867 | 1.48 |
| 9868 | 2.98 |
| 9869 | 1.98 |
| 9870 | 3.32 |
| 9871 | 2.32 |
| 9872 | 4.2 |
| 9873 | 5.32 |
| 9874 | 6.54 |
| 9875 | 5.54 |
| 9876 | 6.64 |
| 9877 | 5.64 |
| 9878 | 4.64 |
| 9879 | 8.84 |
| 9880 | 7.843 |
| 9881 | 9.207 |
| 9882 | 8.21 |
| 9883 | 7.21 |
| 9884 | 8.89 |
| 9885 | 10.63 |
| 9886 | 9.63 |
| 9887 | 8.65 |
| 9888 | 7.67 |
| 9889 | 6.67 |
| 9890 | 8.43 |
| 9891 | 7.43 |
| 9892 | 9.93 |
| 9893 | 8.93 |
| 9894 | 7.93 |
| 9895 | 6.93 |
| 9896 | 11.03 |
| 9897 | 12.45 |
| 9898 | 14.05 |
| 9899 | 13.05 |
| 9900 | 15.2 |
| 9901 | 14.2 |
| 9902 | 16.14 |
| 9903 | 15.14 |
| 9904 | 14.16 |
| 9905 | 13.18 |
| 9906 | 12.18 |
| 9907 | 14.04 |
| 9908 | 13.06 |
| 9909 | 12.08 |
| 9910 | 11.1 |
| 9911 | 10.12 |
| 9912 | 9.14 |
| 9913 | 8.16 |
| 9914 | 7.18 |
| 9915 | 6.2 |
| 9916 | 5.22 |
| 9917 | 4.22 |
| 9918 | 3.22 |
| 9919 | 6.62 |
| 9920 | 5.62 |
| 9921 | 4.64 |
| 9922 | 3.66 |
| 9923 | 2.68 |
| 9924 | 1.7 |
| 9925 | 0.72 |
| 9926 | 0 |
| 9927 | 0 |
| 9928 | 0 |
| 9929 | 0 |
| 9930 | 2.352 |
| 9931 | 1.355 |
| 9932 | 0.355 |
| 9933 | 0 |
| 9934 | 0 |
| 9935 | 3.1 |
| 9936 | 2.12 |
| 9937 | 1.14 |
| 9938 | 3.14 |
| 9939 | 2.14 |
| 9940 | 3.945 |
| 9941 | 2.95 |
| 9942 | 1.955 |
| 9943 | 0.96 |
| 9944 | 0 |
| 9945 | 3.6 |
| 9946 | 2.62 |
| 9947 | 1.64 |
| 9948 | 0.64 |
| 9949 | 0 |
| 9950 | 2.3 |
| 9951 | 1.32 |
| 9952 | 0.34 |
| 9953 | 1.9 |
| 9954 | 3.64 |
| 9955 | 2.64 |
| 9956 | 1.64 |
| 9957 | 0.66 |
| 9958 | 0 |
| 9959 | 0 |
| 9960 | 0 |
| 9961 | 0 |
| 9962 | 0 |
| 9963 | 4.3 |
| 9964 | 5.563 |
| 9965 | 4.567 |
| 9966 | 3.57 |
| 9967 | 5.33 |
| 9968 | 4.33 |
| 9969 | 3.33 |
| 9970 | 2.33 |
| 9971 | 6.33 |
| 9972 | 7.793 |
| 9973 | 6.797 |
| 9974 | 5.8 |
| 9975 | 4.8 |
| 9976 | 7.3 |
| 9977 | 6.3 |
| 9978 | 5.3 |
| 9979 | 7.95 |
| 9980 | 6.95 |
| 9981 | 9.25 |
| 9982 | 10.34 |
| 9983 | 9.35 |
| 9984 | 8.36 |
| 9985 | 7.37 |
| 9986 | 6.39 |
| 9987 | 5.41 |
| 9988 | 6.49 |
| 9989 | 5.49 |
| 9990 | 10.39 |
| 9991 | 9.41 |
| 9992 | 8.43 |
| 9993 | 9.71 |
| 9994 | 8.71 |
| 9995 | 11.16 |
| 9996 | 10.16 |
| 9997 | 9.18 |
| 9998 | 8.2 |
| 9999 | 7.22 |
| 10000 | 6.24 |
| 10001 | 5.26 |
| 10002 | 4.28 |
| 10003 | 3.28 |
| 10004 | 5.33 |
| 10005 | 4.33 |
| 10006 | 3.33 |
| 10007 | 7.83 |
| 10008 | 6.85 |
| 10009 | 5.87 |
| 10010 | 4.875 |
| 10011 | 6.88 |
| 10012 | 5.885 |
| 10013 | 4.89 |
| 10014 | 6.633 |
| 10015 | 5.637 |
| 10016 | 4.64 |
| 10017 | 3.64 |
| 10018 | 5.22 |
| 10019 | 7.72 |
| 10020 | 6.72 |
| 10021 | 8.187 |
| 10022 | 7.195 |
| 10023 | 6.202 |
| 10024 | 5.21 |
| 10025 | 6.41 |
| 10026 | 10.81 |
| 10027 | 9.81 |
| 10028 | 8.83 |
| 10029 | 7.85 |
| 10030 | 10.4 |
| 10031 | 9.4 |
| 10032 | 8.4 |
| 10033 | 7.4 |
| 10034 | 6.4 |
| 10035 | 10.1 |
| 10036 | 9.1 |
| 10037 | 11.1 |
| 10038 | 10.1 |
| 10039 | 9.107 |
| 10040 | 10.735 |
| 10041 | 9.742 |
| 10042 | 8.75 |
| 10043 | 7.77 |
| 10044 | 6.79 |
| 10045 | 5.81 |
| 10046 | 4.83 |
| 10047 | 3.83 |
| 10048 | 6.78 |
| 10049 | 8.62 |
| 10050 | 7.62 |
| 10051 | 6.62 |
| 10052 | 8.97 |
| 10053 | 7.99 |
| 10054 | 7.01 |
| 10055 | 6.03 |
| 10056 | 5.05 |
| 10057 | 4.07 |